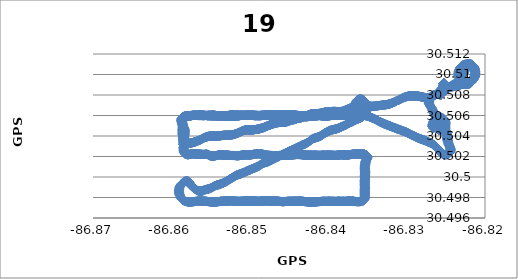
| Category | GPS Long |
|---|---|
| -86.825249 | 30.509 |
| -86.825249 | 30.509 |
| -86.825249 | 30.509 |
| -86.825249 | 30.509 |
| -86.825249 | 30.509 |
| -86.825249 | 30.509 |
| -86.825249 | 30.509 |
| -86.825249 | 30.509 |
| -86.825249 | 30.509 |
| -86.825249 | 30.509 |
| -86.825249 | 30.509 |
| -86.825249 | 30.509 |
| -86.825249 | 30.509 |
| -86.825249 | 30.509 |
| -86.825249 | 30.509 |
| -86.825249 | 30.509 |
| -86.825249 | 30.509 |
| -86.825249 | 30.509 |
| -86.825249 | 30.509 |
| -86.825249 | 30.509 |
| -86.825249 | 30.509 |
| -86.825249 | 30.509 |
| -86.825249 | 30.509 |
| -86.825249 | 30.509 |
| -86.825249 | 30.509 |
| -86.825249 | 30.509 |
| -86.825249 | 30.509 |
| -86.825249 | 30.509 |
| -86.825249 | 30.509 |
| -86.825249 | 30.509 |
| -86.825249 | 30.509 |
| -86.825249 | 30.509 |
| -86.825249 | 30.509 |
| -86.825249 | 30.509 |
| -86.825249 | 30.509 |
| -86.825249 | 30.509 |
| -86.825249 | 30.509 |
| -86.825249 | 30.509 |
| -86.825249 | 30.509 |
| -86.825249 | 30.509 |
| -86.825249 | 30.509 |
| -86.825249 | 30.509 |
| -86.825249 | 30.509 |
| -86.825249 | 30.509 |
| -86.825249 | 30.509 |
| -86.825249 | 30.509 |
| -86.825249 | 30.509 |
| -86.825249 | 30.509 |
| -86.825233 | 30.509 |
| -86.825233 | 30.509 |
| -86.825233 | 30.509 |
| -86.825233 | 30.509 |
| -86.825233 | 30.509 |
| -86.825233 | 30.509 |
| -86.825233 | 30.509 |
| -86.825233 | 30.509 |
| -86.825233 | 30.509 |
| -86.825233 | 30.509 |
| -86.825233 | 30.509 |
| -86.825233 | 30.509 |
| -86.825233 | 30.509 |
| -86.825233 | 30.509 |
| -86.825233 | 30.509 |
| -86.825233 | 30.509 |
| -86.825233 | 30.509 |
| -86.825233 | 30.509 |
| -86.825233 | 30.509 |
| -86.825233 | 30.509 |
| -86.825233 | 30.509 |
| -86.825233 | 30.509 |
| -86.825233 | 30.509 |
| -86.825233 | 30.509 |
| -86.825233 | 30.509 |
| -86.825233 | 30.509 |
| -86.825233 | 30.509 |
| -86.825233 | 30.509 |
| -86.825233 | 30.509 |
| -86.825233 | 30.509 |
| -86.825233 | 30.509 |
| -86.825233 | 30.509 |
| -86.825233 | 30.509 |
| -86.825233 | 30.509 |
| -86.825233 | 30.509 |
| -86.825233 | 30.509 |
| -86.825233 | 30.509 |
| -86.825233 | 30.509 |
| -86.825233 | 30.509 |
| -86.825233 | 30.509 |
| -86.825233 | 30.509 |
| -86.825233 | 30.509 |
| -86.825233 | 30.509 |
| -86.825233 | 30.509 |
| -86.825233 | 30.509 |
| -86.825233 | 30.509 |
| -86.825233 | 30.509 |
| -86.825233 | 30.509 |
| -86.825233 | 30.509 |
| -86.825233 | 30.509 |
| -86.825233 | 30.509 |
| -86.825233 | 30.509 |
| -86.825233 | 30.509 |
| -86.825233 | 30.509 |
| -86.825233 | 30.509 |
| -86.825233 | 30.509 |
| -86.825233 | 30.509 |
| -86.825233 | 30.509 |
| -86.825233 | 30.509 |
| -86.825233 | 30.509 |
| -86.825233 | 30.509 |
| -86.825233 | 30.509 |
| -86.825233 | 30.509 |
| -86.825233 | 30.509 |
| -86.825233 | 30.509 |
| -86.825233 | 30.509 |
| -86.825233 | 30.509 |
| -86.825233 | 30.509 |
| -86.825233 | 30.509 |
| -86.825233 | 30.509 |
| -86.825233 | 30.509 |
| -86.825233 | 30.509 |
| -86.825233 | 30.509 |
| -86.825233 | 30.509 |
| -86.825233 | 30.509 |
| -86.825233 | 30.509 |
| -86.825233 | 30.509 |
| -86.825233 | 30.509 |
| -86.825233 | 30.509 |
| -86.825233 | 30.509 |
| -86.825233 | 30.509 |
| -86.825233 | 30.509 |
| -86.825233 | 30.509 |
| -86.825233 | 30.509 |
| -86.825233 | 30.509 |
| -86.825233 | 30.509 |
| -86.825233 | 30.509 |
| -86.825233 | 30.509 |
| -86.825233 | 30.509 |
| -86.825233 | 30.509 |
| -86.825233 | 30.509 |
| -86.825249 | 30.509 |
| -86.825264 | 30.509 |
| -86.825264 | 30.509 |
| -86.825279 | 30.509 |
| -86.825279 | 30.509 |
| -86.82531 | 30.509 |
| -86.82531 | 30.509 |
| -86.82531 | 30.509 |
| -86.825325 | 30.509 |
| -86.825325 | 30.509 |
| -86.825325 | 30.509 |
| -86.825371 | 30.509 |
| -86.825409 | 30.509 |
| -86.825409 | 30.509 |
| -86.825455 | 30.509 |
| -86.825455 | 30.509 |
| -86.825485 | 30.509 |
| -86.825485 | 30.509 |
| -86.825531 | 30.509 |
| -86.825539 | 30.509 |
| -86.825539 | 30.509 |
| -86.825577 | 30.509 |
| -86.825577 | 30.509 |
| -86.82563 | 30.509 |
| -86.82563 | 30.509 |
| -86.825691 | 30.508 |
| -86.825691 | 30.508 |
| -86.825737 | 30.508 |
| -86.825737 | 30.508 |
| -86.825783 | 30.508 |
| -86.825783 | 30.508 |
| -86.825851 | 30.508 |
| -86.825851 | 30.508 |
| -86.825897 | 30.508 |
| -86.825897 | 30.508 |
| -86.825897 | 30.508 |
| -86.825958 | 30.508 |
| -86.825958 | 30.508 |
| -86.825958 | 30.508 |
| -86.826027 | 30.508 |
| -86.826027 | 30.508 |
| -86.826065 | 30.508 |
| -86.826065 | 30.508 |
| -86.826134 | 30.508 |
| -86.826134 | 30.508 |
| -86.826187 | 30.508 |
| -86.826248 | 30.508 |
| -86.826248 | 30.508 |
| -86.826309 | 30.508 |
| -86.826309 | 30.508 |
| -86.82637 | 30.508 |
| -86.82637 | 30.508 |
| -86.826485 | 30.508 |
| -86.826485 | 30.508 |
| -86.826515 | 30.508 |
| -86.826515 | 30.508 |
| -86.826607 | 30.508 |
| -86.826607 | 30.508 |
| -86.826668 | 30.508 |
| -86.826668 | 30.508 |
| -86.826759 | 30.508 |
| -86.826759 | 30.508 |
| -86.82682 | 30.508 |
| -86.82682 | 30.508 |
| -86.826866 | 30.508 |
| -86.826866 | 30.508 |
| -86.826866 | 30.508 |
| -86.826912 | 30.508 |
| -86.82692 | 30.508 |
| -86.82692 | 30.508 |
| -86.826958 | 30.508 |
| -86.826958 | 30.508 |
| -86.827003 | 30.508 |
| -86.827003 | 30.508 |
| -86.827034 | 30.508 |
| -86.827034 | 30.508 |
| -86.827065 | 30.508 |
| -86.827065 | 30.508 |
| -86.82708 | 30.508 |
| -86.82708 | 30.508 |
| -86.827095 | 30.508 |
| -86.827095 | 30.508 |
| -86.827095 | 30.508 |
| -86.82711 | 30.508 |
| -86.82711 | 30.508 |
| -86.82711 | 30.508 |
| -86.827126 | 30.507 |
| -86.827126 | 30.507 |
| -86.827126 | 30.507 |
| -86.827126 | 30.507 |
| -86.827141 | 30.507 |
| -86.827141 | 30.507 |
| -86.827156 | 30.507 |
| -86.827156 | 30.507 |
| -86.827141 | 30.507 |
| -86.827141 | 30.507 |
| -86.827126 | 30.507 |
| -86.827126 | 30.507 |
| -86.82708 | 30.507 |
| -86.82708 | 30.507 |
| -86.827065 | 30.507 |
| -86.827065 | 30.507 |
| -86.827011 | 30.507 |
| -86.827011 | 30.507 |
| -86.826973 | 30.507 |
| -86.826973 | 30.507 |
| -86.826927 | 30.507 |
| -86.826927 | 30.507 |
| -86.826912 | 30.507 |
| -86.826912 | 30.507 |
| -86.826851 | 30.507 |
| -86.826851 | 30.507 |
| -86.826851 | 30.507 |
| -86.826836 | 30.507 |
| -86.826805 | 30.507 |
| -86.826775 | 30.507 |
| -86.826775 | 30.507 |
| -86.826729 | 30.507 |
| -86.826698 | 30.507 |
| -86.826698 | 30.507 |
| -86.826668 | 30.506 |
| -86.826668 | 30.506 |
| -86.826668 | 30.506 |
| -86.826637 | 30.506 |
| -86.826637 | 30.506 |
| -86.826607 | 30.506 |
| -86.826561 | 30.506 |
| -86.826561 | 30.506 |
| -86.826561 | 30.506 |
| -86.82653 | 30.506 |
| -86.82653 | 30.506 |
| -86.8265 | 30.506 |
| -86.8265 | 30.506 |
| -86.8265 | 30.506 |
| -86.826454 | 30.506 |
| -86.826454 | 30.506 |
| -86.826424 | 30.506 |
| -86.826424 | 30.506 |
| -86.82637 | 30.506 |
| -86.82637 | 30.506 |
| -86.826317 | 30.506 |
| -86.826317 | 30.506 |
| -86.826302 | 30.506 |
| -86.826302 | 30.506 |
| -86.826256 | 30.506 |
| -86.826256 | 30.506 |
| -86.826202 | 30.506 |
| -86.826202 | 30.506 |
| -86.826164 | 30.506 |
| -86.826164 | 30.506 |
| -86.826111 | 30.506 |
| -86.826111 | 30.506 |
| -86.826065 | 30.506 |
| -86.826065 | 30.506 |
| -86.826035 | 30.506 |
| -86.826035 | 30.506 |
| -86.826004 | 30.505 |
| -86.826004 | 30.505 |
| -86.825951 | 30.505 |
| -86.825951 | 30.505 |
| -86.825897 | 30.505 |
| -86.82589 | 30.505 |
| -86.825859 | 30.505 |
| -86.825859 | 30.505 |
| -86.825813 | 30.505 |
| -86.825813 | 30.505 |
| -86.825783 | 30.505 |
| -86.825752 | 30.505 |
| -86.825745 | 30.505 |
| -86.825745 | 30.505 |
| -86.825722 | 30.505 |
| -86.825722 | 30.505 |
| -86.825661 | 30.505 |
| -86.825645 | 30.505 |
| -86.82563 | 30.505 |
| -86.82563 | 30.505 |
| -86.82563 | 30.505 |
| -86.825569 | 30.505 |
| -86.825569 | 30.505 |
| -86.825569 | 30.505 |
| -86.825516 | 30.505 |
| -86.825516 | 30.505 |
| -86.825485 | 30.505 |
| -86.825485 | 30.505 |
| -86.825409 | 30.505 |
| -86.825409 | 30.505 |
| -86.825363 | 30.505 |
| -86.825363 | 30.505 |
| -86.825294 | 30.505 |
| -86.825294 | 30.505 |
| -86.825195 | 30.505 |
| -86.825195 | 30.505 |
| -86.825104 | 30.505 |
| -86.825104 | 30.505 |
| -86.824989 | 30.504 |
| -86.824989 | 30.504 |
| -86.824974 | 30.504 |
| -86.824974 | 30.504 |
| -86.824928 | 30.504 |
| -86.824928 | 30.504 |
| -86.824898 | 30.504 |
| -86.824898 | 30.504 |
| -86.824898 | 30.504 |
| -86.824867 | 30.504 |
| -86.824867 | 30.504 |
| -86.824837 | 30.504 |
| -86.824837 | 30.504 |
| -86.824837 | 30.504 |
| -86.824791 | 30.504 |
| -86.824791 | 30.504 |
| -86.824791 | 30.504 |
| -86.824776 | 30.504 |
| -86.824776 | 30.504 |
| -86.824776 | 30.504 |
| -86.824776 | 30.504 |
| -86.824776 | 30.504 |
| -86.824776 | 30.504 |
| -86.824776 | 30.504 |
| -86.824776 | 30.504 |
| -86.824776 | 30.504 |
| -86.824776 | 30.504 |
| -86.824776 | 30.504 |
| -86.824776 | 30.504 |
| -86.824776 | 30.504 |
| -86.824776 | 30.504 |
| -86.824776 | 30.504 |
| -86.824776 | 30.504 |
| -86.824776 | 30.504 |
| -86.824776 | 30.504 |
| -86.824776 | 30.504 |
| -86.824776 | 30.504 |
| -86.824776 | 30.504 |
| -86.824776 | 30.504 |
| -86.824776 | 30.504 |
| -86.824776 | 30.504 |
| -86.824776 | 30.504 |
| -86.824776 | 30.504 |
| -86.824776 | 30.504 |
| -86.824776 | 30.504 |
| -86.824776 | 30.504 |
| -86.824776 | 30.504 |
| -86.824776 | 30.504 |
| -86.824776 | 30.504 |
| -86.824776 | 30.504 |
| -86.824776 | 30.504 |
| -86.824776 | 30.504 |
| -86.825836 | 30.505 |
| -86.825836 | 30.505 |
| -86.826576 | 30.505 |
| -86.826576 | 30.505 |
| -86.826714 | 30.505 |
| -86.826714 | 30.505 |
| -86.826714 | 30.505 |
| -86.826714 | 30.505 |
| -86.826729 | 30.505 |
| -86.826729 | 30.505 |
| -86.826714 | 30.505 |
| -86.826714 | 30.505 |
| -86.826675 | 30.505 |
| -86.826675 | 30.505 |
| -86.826607 | 30.505 |
| -86.826607 | 30.505 |
| -86.826569 | 30.505 |
| -86.826569 | 30.505 |
| -86.826508 | 30.506 |
| -86.826508 | 30.506 |
| -86.826462 | 30.506 |
| -86.826462 | 30.506 |
| -86.826401 | 30.506 |
| -86.826401 | 30.506 |
| -86.82634 | 30.506 |
| -86.82634 | 30.506 |
| -86.826279 | 30.506 |
| -86.826279 | 30.506 |
| -86.826202 | 30.506 |
| -86.826202 | 30.506 |
| -86.826057 | 30.506 |
| -86.826057 | 30.506 |
| -86.826004 | 30.506 |
| -86.826004 | 30.506 |
| -86.82589 | 30.506 |
| -86.82589 | 30.506 |
| -86.825798 | 30.506 |
| -86.825798 | 30.506 |
| -86.825722 | 30.506 |
| -86.825722 | 30.506 |
| -86.82563 | 30.506 |
| -86.82563 | 30.506 |
| -86.82563 | 30.506 |
| -86.825539 | 30.506 |
| -86.825539 | 30.506 |
| -86.825462 | 30.506 |
| -86.825386 | 30.506 |
| -86.825386 | 30.506 |
| -86.825386 | 30.506 |
| -86.825325 | 30.506 |
| -86.825325 | 30.506 |
| -86.825241 | 30.506 |
| -86.825241 | 30.506 |
| -86.825195 | 30.506 |
| -86.825195 | 30.506 |
| -86.825142 | 30.506 |
| -86.825142 | 30.506 |
| -86.825111 | 30.505 |
| -86.825111 | 30.505 |
| -86.825081 | 30.505 |
| -86.825081 | 30.505 |
| -86.825066 | 30.505 |
| -86.825066 | 30.505 |
| -86.82505 | 30.505 |
| -86.82505 | 30.505 |
| -86.82505 | 30.505 |
| -86.82505 | 30.505 |
| -86.82505 | 30.505 |
| -86.82505 | 30.505 |
| -86.825066 | 30.505 |
| -86.825066 | 30.505 |
| -86.825066 | 30.505 |
| -86.825066 | 30.505 |
| -86.825066 | 30.505 |
| -86.825081 | 30.505 |
| -86.825081 | 30.505 |
| -86.825081 | 30.505 |
| -86.825081 | 30.505 |
| -86.825081 | 30.505 |
| -86.825081 | 30.505 |
| -86.825081 | 30.505 |
| -86.825081 | 30.505 |
| -86.825066 | 30.505 |
| -86.825066 | 30.505 |
| -86.825066 | 30.505 |
| -86.825066 | 30.505 |
| -86.825066 | 30.505 |
| -86.82505 | 30.505 |
| -86.82505 | 30.505 |
| -86.82505 | 30.505 |
| -86.82505 | 30.505 |
| -86.82502 | 30.504 |
| -86.825005 | 30.504 |
| -86.825005 | 30.504 |
| -86.824989 | 30.504 |
| -86.824989 | 30.504 |
| -86.824974 | 30.504 |
| -86.824974 | 30.504 |
| -86.824944 | 30.504 |
| -86.824944 | 30.504 |
| -86.824928 | 30.504 |
| -86.824928 | 30.504 |
| -86.824898 | 30.504 |
| -86.824898 | 30.504 |
| -86.824883 | 30.504 |
| -86.824883 | 30.504 |
| -86.824867 | 30.504 |
| -86.824867 | 30.504 |
| -86.824852 | 30.504 |
| -86.824852 | 30.504 |
| -86.824837 | 30.504 |
| -86.824837 | 30.504 |
| -86.824837 | 30.504 |
| -86.824837 | 30.504 |
| -86.824821 | 30.504 |
| -86.824821 | 30.504 |
| -86.824806 | 30.504 |
| -86.824806 | 30.504 |
| -86.824791 | 30.504 |
| -86.824791 | 30.504 |
| -86.824776 | 30.504 |
| -86.824776 | 30.504 |
| -86.82476 | 30.504 |
| -86.82476 | 30.504 |
| -86.82476 | 30.504 |
| -86.82473 | 30.503 |
| -86.82473 | 30.503 |
| -86.824699 | 30.503 |
| -86.824699 | 30.503 |
| -86.824684 | 30.503 |
| -86.824684 | 30.503 |
| -86.824654 | 30.503 |
| -86.824654 | 30.503 |
| -86.824638 | 30.503 |
| -86.824638 | 30.503 |
| -86.824608 | 30.503 |
| -86.824608 | 30.503 |
| -86.824577 | 30.503 |
| -86.824577 | 30.503 |
| -86.824547 | 30.503 |
| -86.824547 | 30.503 |
| -86.824547 | 30.503 |
| -86.824547 | 30.503 |
| -86.824486 | 30.503 |
| -86.824486 | 30.503 |
| -86.824486 | 30.503 |
| -86.824486 | 30.503 |
| -86.824455 | 30.503 |
| -86.824455 | 30.503 |
| -86.824425 | 30.503 |
| -86.824409 | 30.503 |
| -86.824409 | 30.503 |
| -86.824394 | 30.503 |
| -86.824394 | 30.503 |
| -86.824394 | 30.503 |
| -86.824394 | 30.503 |
| -86.824394 | 30.503 |
| -86.824394 | 30.503 |
| -86.824394 | 30.503 |
| -86.824409 | 30.503 |
| -86.824409 | 30.503 |
| -86.82444 | 30.502 |
| -86.82444 | 30.502 |
| -86.824471 | 30.502 |
| -86.824471 | 30.502 |
| -86.824509 | 30.502 |
| -86.824509 | 30.502 |
| -86.824562 | 30.502 |
| -86.824562 | 30.502 |
| -86.8246 | 30.502 |
| -86.8246 | 30.502 |
| -86.824669 | 30.502 |
| -86.824669 | 30.502 |
| -86.82473 | 30.502 |
| -86.82473 | 30.502 |
| -86.824814 | 30.502 |
| -86.824814 | 30.502 |
| -86.824898 | 30.502 |
| -86.824898 | 30.502 |
| -86.824974 | 30.502 |
| -86.824974 | 30.502 |
| -86.825096 | 30.502 |
| -86.825096 | 30.502 |
| -86.825165 | 30.502 |
| -86.825165 | 30.502 |
| -86.825279 | 30.502 |
| -86.825279 | 30.502 |
| -86.825356 | 30.502 |
| -86.825356 | 30.502 |
| -86.825356 | 30.502 |
| -86.825447 | 30.502 |
| -86.825447 | 30.502 |
| -86.825523 | 30.502 |
| -86.825546 | 30.502 |
| -86.8256 | 30.502 |
| -86.8256 | 30.502 |
| -86.8256 | 30.502 |
| -86.825668 | 30.502 |
| -86.825668 | 30.502 |
| -86.825745 | 30.502 |
| -86.825745 | 30.502 |
| -86.825813 | 30.503 |
| -86.825813 | 30.503 |
| -86.825867 | 30.503 |
| -86.825867 | 30.503 |
| -86.825928 | 30.503 |
| -86.825928 | 30.503 |
| -86.825989 | 30.503 |
| -86.825989 | 30.503 |
| -86.826057 | 30.503 |
| -86.826057 | 30.503 |
| -86.826057 | 30.503 |
| -86.826096 | 30.503 |
| -86.826096 | 30.503 |
| -86.82618 | 30.503 |
| -86.826202 | 30.503 |
| -86.826202 | 30.503 |
| -86.826241 | 30.503 |
| -86.826302 | 30.503 |
| -86.826302 | 30.503 |
| -86.826378 | 30.503 |
| -86.826378 | 30.503 |
| -86.826462 | 30.503 |
| -86.826462 | 30.503 |
| -86.826561 | 30.503 |
| -86.826561 | 30.503 |
| -86.826637 | 30.503 |
| -86.826637 | 30.503 |
| -86.826714 | 30.503 |
| -86.826714 | 30.503 |
| -86.826736 | 30.503 |
| -86.826828 | 30.503 |
| -86.826828 | 30.503 |
| -86.826904 | 30.503 |
| -86.826904 | 30.503 |
| -86.826981 | 30.503 |
| -86.826981 | 30.503 |
| -86.827072 | 30.503 |
| -86.827072 | 30.503 |
| -86.827148 | 30.503 |
| -86.827148 | 30.503 |
| -86.82724 | 30.503 |
| -86.82724 | 30.503 |
| -86.827332 | 30.503 |
| -86.827332 | 30.503 |
| -86.827423 | 30.503 |
| -86.827423 | 30.503 |
| -86.827499 | 30.504 |
| -86.827499 | 30.504 |
| -86.827614 | 30.504 |
| -86.827614 | 30.504 |
| -86.827705 | 30.504 |
| -86.827705 | 30.504 |
| -86.827705 | 30.504 |
| -86.827782 | 30.504 |
| -86.827766 | 30.504 |
| -86.827766 | 30.504 |
| -86.827843 | 30.504 |
| -86.827919 | 30.504 |
| -86.827942 | 30.504 |
| -86.827942 | 30.504 |
| -86.828011 | 30.504 |
| -86.828087 | 30.504 |
| -86.828087 | 30.504 |
| -86.828087 | 30.504 |
| -86.828186 | 30.504 |
| -86.828186 | 30.504 |
| -86.828262 | 30.504 |
| -86.828262 | 30.504 |
| -86.828339 | 30.504 |
| -86.828339 | 30.504 |
| -86.828415 | 30.504 |
| -86.828415 | 30.504 |
| -86.828491 | 30.504 |
| -86.828491 | 30.504 |
| -86.828606 | 30.504 |
| -86.828606 | 30.504 |
| -86.828682 | 30.504 |
| -86.828682 | 30.504 |
| -86.828781 | 30.504 |
| -86.828781 | 30.504 |
| -86.828827 | 30.504 |
| -86.828827 | 30.504 |
| -86.828918 | 30.504 |
| -86.828918 | 30.504 |
| -86.828995 | 30.504 |
| -86.828995 | 30.504 |
| -86.829056 | 30.504 |
| -86.829056 | 30.504 |
| -86.829163 | 30.504 |
| -86.829185 | 30.504 |
| -86.829277 | 30.504 |
| -86.829277 | 30.504 |
| -86.829353 | 30.504 |
| -86.829338 | 30.504 |
| -86.829414 | 30.504 |
| -86.829414 | 30.504 |
| -86.829414 | 30.504 |
| -86.829529 | 30.504 |
| -86.829597 | 30.504 |
| -86.829597 | 30.504 |
| -86.829597 | 30.504 |
| -86.829659 | 30.504 |
| -86.829681 | 30.504 |
| -86.829735 | 30.504 |
| -86.829826 | 30.504 |
| -86.829826 | 30.504 |
| -86.829826 | 30.504 |
| -86.829903 | 30.504 |
| -86.829903 | 30.504 |
| -86.829979 | 30.504 |
| -86.83007 | 30.504 |
| -86.83007 | 30.504 |
| -86.83007 | 30.504 |
| -86.83007 | 30.504 |
| -86.830147 | 30.504 |
| -86.830147 | 30.504 |
| -86.830246 | 30.504 |
| -86.830246 | 30.504 |
| -86.830338 | 30.504 |
| -86.830338 | 30.504 |
| -86.830414 | 30.504 |
| -86.830414 | 30.504 |
| -86.830505 | 30.505 |
| -86.830582 | 30.505 |
| -86.830582 | 30.505 |
| -86.830582 | 30.505 |
| -86.830582 | 30.505 |
| -86.830696 | 30.505 |
| -86.830696 | 30.505 |
| -86.830772 | 30.505 |
| -86.830772 | 30.505 |
| -86.830887 | 30.505 |
| -86.830887 | 30.505 |
| -86.830956 | 30.505 |
| -86.830956 | 30.505 |
| -86.831032 | 30.505 |
| -86.831032 | 30.505 |
| -86.831146 | 30.505 |
| -86.831146 | 30.505 |
| -86.831245 | 30.505 |
| -86.831245 | 30.505 |
| -86.831245 | 30.505 |
| -86.831322 | 30.505 |
| -86.831345 | 30.505 |
| -86.831413 | 30.505 |
| -86.831413 | 30.505 |
| -86.83149 | 30.505 |
| -86.83149 | 30.505 |
| -86.83149 | 30.505 |
| -86.831589 | 30.505 |
| -86.83168 | 30.505 |
| -86.83168 | 30.505 |
| -86.831779 | 30.505 |
| -86.831779 | 30.505 |
| -86.831833 | 30.505 |
| -86.831833 | 30.505 |
| -86.831924 | 30.505 |
| -86.831924 | 30.505 |
| -86.832024 | 30.505 |
| -86.832024 | 30.505 |
| -86.832062 | 30.505 |
| -86.832153 | 30.505 |
| -86.832153 | 30.505 |
| -86.832153 | 30.505 |
| -86.832153 | 30.505 |
| -86.83223 | 30.505 |
| -86.83223 | 30.505 |
| -86.832329 | 30.505 |
| -86.832329 | 30.505 |
| -86.83242 | 30.505 |
| -86.83242 | 30.505 |
| -86.832497 | 30.505 |
| -86.832497 | 30.505 |
| -86.832573 | 30.505 |
| -86.832573 | 30.505 |
| -86.832649 | 30.505 |
| -86.832649 | 30.505 |
| -86.832741 | 30.505 |
| -86.832741 | 30.505 |
| -86.832817 | 30.505 |
| -86.832817 | 30.505 |
| -86.832817 | 30.505 |
| -86.832893 | 30.505 |
| -86.832893 | 30.505 |
| -86.83297 | 30.505 |
| -86.83297 | 30.505 |
| -86.83297 | 30.505 |
| -86.833015 | 30.505 |
| -86.833015 | 30.505 |
| -86.833107 | 30.505 |
| -86.833107 | 30.505 |
| -86.833176 | 30.505 |
| -86.833176 | 30.505 |
| -86.833252 | 30.505 |
| -86.833252 | 30.505 |
| -86.833328 | 30.505 |
| -86.833328 | 30.505 |
| -86.833405 | 30.505 |
| -86.833405 | 30.505 |
| -86.833466 | 30.505 |
| -86.833466 | 30.505 |
| -86.833595 | 30.505 |
| -86.833626 | 30.505 |
| -86.833626 | 30.505 |
| -86.833733 | 30.506 |
| -86.833733 | 30.506 |
| -86.833733 | 30.506 |
| -86.833794 | 30.506 |
| -86.833801 | 30.506 |
| -86.83387 | 30.506 |
| -86.83387 | 30.506 |
| -86.833946 | 30.506 |
| -86.834023 | 30.506 |
| -86.834023 | 30.506 |
| -86.834099 | 30.506 |
| -86.834099 | 30.506 |
| -86.834175 | 30.506 |
| -86.834183 | 30.506 |
| -86.834183 | 30.506 |
| -86.834251 | 30.506 |
| -86.834251 | 30.506 |
| -86.834373 | 30.506 |
| -86.834373 | 30.506 |
| -86.834427 | 30.506 |
| -86.834427 | 30.506 |
| -86.834503 | 30.506 |
| -86.834503 | 30.506 |
| -86.834625 | 30.506 |
| -86.834625 | 30.506 |
| -86.834694 | 30.506 |
| -86.834694 | 30.506 |
| -86.83477 | 30.506 |
| -86.83477 | 30.506 |
| -86.834862 | 30.506 |
| -86.834862 | 30.506 |
| -86.834938 | 30.506 |
| -86.834938 | 30.506 |
| -86.834938 | 30.506 |
| -86.83503 | 30.506 |
| -86.83503 | 30.506 |
| -86.83503 | 30.506 |
| -86.835129 | 30.506 |
| -86.835129 | 30.506 |
| -86.835197 | 30.506 |
| -86.835197 | 30.506 |
| -86.835297 | 30.506 |
| -86.835297 | 30.506 |
| -86.835388 | 30.506 |
| -86.835487 | 30.506 |
| -86.835487 | 30.506 |
| -86.835487 | 30.506 |
| -86.835556 | 30.506 |
| -86.835556 | 30.506 |
| -86.835655 | 30.506 |
| -86.835655 | 30.506 |
| -86.835732 | 30.506 |
| -86.835732 | 30.506 |
| -86.835808 | 30.506 |
| -86.835808 | 30.506 |
| -86.835899 | 30.506 |
| -86.835899 | 30.506 |
| -86.835976 | 30.506 |
| -86.835976 | 30.506 |
| -86.835976 | 30.506 |
| -86.836067 | 30.506 |
| -86.836067 | 30.506 |
| -86.836159 | 30.506 |
| -86.836159 | 30.506 |
| -86.83625 | 30.506 |
| -86.83625 | 30.506 |
| -86.836327 | 30.506 |
| -86.836327 | 30.506 |
| -86.836418 | 30.506 |
| -86.836418 | 30.506 |
| -86.836494 | 30.506 |
| -86.836494 | 30.506 |
| -86.836586 | 30.506 |
| -86.836609 | 30.506 |
| -86.836609 | 30.506 |
| -86.8367 | 30.506 |
| -86.8367 | 30.506 |
| -86.8368 | 30.506 |
| -86.8368 | 30.506 |
| -86.836868 | 30.506 |
| -86.836868 | 30.506 |
| -86.83699 | 30.506 |
| -86.83699 | 30.506 |
| -86.837036 | 30.506 |
| -86.837036 | 30.506 |
| -86.837173 | 30.506 |
| -86.837173 | 30.506 |
| -86.837242 | 30.506 |
| -86.837242 | 30.506 |
| -86.837357 | 30.506 |
| -86.837357 | 30.506 |
| -86.83741 | 30.506 |
| -86.83741 | 30.506 |
| -86.83754 | 30.506 |
| -86.837563 | 30.506 |
| -86.837631 | 30.506 |
| -86.837631 | 30.506 |
| -86.837631 | 30.506 |
| -86.837631 | 30.506 |
| -86.83773 | 30.506 |
| -86.83773 | 30.506 |
| -86.837822 | 30.506 |
| -86.837822 | 30.506 |
| -86.837914 | 30.506 |
| -86.837914 | 30.506 |
| -86.838005 | 30.506 |
| -86.838005 | 30.506 |
| -86.838005 | 30.506 |
| -86.838005 | 30.506 |
| -86.838127 | 30.506 |
| -86.838127 | 30.506 |
| -86.838196 | 30.506 |
| -86.838196 | 30.506 |
| -86.83831 | 30.506 |
| -86.83831 | 30.506 |
| -86.838379 | 30.506 |
| -86.838379 | 30.506 |
| -86.838493 | 30.506 |
| -86.838493 | 30.506 |
| -86.838585 | 30.506 |
| -86.838585 | 30.506 |
| -86.838676 | 30.506 |
| -86.838699 | 30.506 |
| -86.838699 | 30.506 |
| -86.838791 | 30.506 |
| -86.838791 | 30.506 |
| -86.83889 | 30.506 |
| -86.83889 | 30.506 |
| -86.838959 | 30.506 |
| -86.838959 | 30.506 |
| -86.839073 | 30.506 |
| -86.839073 | 30.506 |
| -86.839165 | 30.506 |
| -86.839165 | 30.506 |
| -86.839256 | 30.506 |
| -86.839256 | 30.506 |
| -86.839256 | 30.506 |
| -86.839256 | 30.506 |
| -86.839371 | 30.506 |
| -86.839371 | 30.506 |
| -86.839424 | 30.506 |
| -86.839424 | 30.506 |
| -86.839516 | 30.506 |
| -86.839516 | 30.506 |
| -86.839607 | 30.506 |
| -86.839607 | 30.506 |
| -86.839745 | 30.506 |
| -86.839745 | 30.506 |
| -86.839813 | 30.506 |
| -86.839813 | 30.506 |
| -86.839905 | 30.506 |
| -86.839905 | 30.506 |
| -86.840004 | 30.506 |
| -86.840004 | 30.506 |
| -86.840096 | 30.506 |
| -86.840096 | 30.506 |
| -86.84021 | 30.506 |
| -86.84021 | 30.506 |
| -86.840286 | 30.506 |
| -86.840286 | 30.506 |
| -86.840401 | 30.506 |
| -86.840401 | 30.506 |
| -86.840469 | 30.506 |
| -86.840469 | 30.506 |
| -86.840546 | 30.506 |
| -86.840546 | 30.506 |
| -86.840645 | 30.506 |
| -86.840645 | 30.506 |
| -86.840698 | 30.506 |
| -86.840698 | 30.506 |
| -86.840797 | 30.506 |
| -86.840797 | 30.506 |
| -86.840889 | 30.506 |
| -86.840889 | 30.506 |
| -86.840965 | 30.506 |
| -86.840965 | 30.506 |
| -86.841026 | 30.506 |
| -86.841026 | 30.506 |
| -86.841118 | 30.506 |
| -86.841118 | 30.506 |
| -86.841118 | 30.506 |
| -86.841209 | 30.506 |
| -86.841286 | 30.506 |
| -86.841286 | 30.506 |
| -86.84127 | 30.506 |
| -86.84127 | 30.506 |
| -86.841362 | 30.506 |
| -86.841362 | 30.506 |
| -86.841438 | 30.506 |
| -86.841522 | 30.506 |
| -86.841522 | 30.506 |
| -86.841591 | 30.506 |
| -86.841591 | 30.506 |
| -86.841591 | 30.506 |
| -86.841675 | 30.506 |
| -86.841675 | 30.506 |
| -86.841736 | 30.506 |
| -86.841736 | 30.506 |
| -86.841812 | 30.506 |
| -86.841812 | 30.506 |
| -86.841888 | 30.506 |
| -86.841888 | 30.506 |
| -86.841949 | 30.506 |
| -86.842026 | 30.506 |
| -86.842026 | 30.506 |
| -86.842026 | 30.506 |
| -86.842117 | 30.506 |
| -86.842117 | 30.506 |
| -86.842194 | 30.506 |
| -86.842194 | 30.506 |
| -86.842194 | 30.506 |
| -86.842278 | 30.506 |
| -86.842278 | 30.506 |
| -86.842339 | 30.506 |
| -86.842339 | 30.506 |
| -86.842415 | 30.506 |
| -86.842415 | 30.506 |
| -86.842491 | 30.506 |
| -86.842491 | 30.506 |
| -86.842552 | 30.506 |
| -86.842552 | 30.506 |
| -86.842552 | 30.506 |
| -86.842628 | 30.506 |
| -86.842628 | 30.506 |
| -86.84272 | 30.506 |
| -86.84272 | 30.506 |
| -86.842804 | 30.506 |
| -86.842804 | 30.506 |
| -86.842865 | 30.506 |
| -86.842865 | 30.506 |
| -86.842941 | 30.506 |
| -86.842941 | 30.506 |
| -86.843056 | 30.506 |
| -86.843056 | 30.506 |
| -86.843094 | 30.506 |
| -86.843094 | 30.506 |
| -86.84317 | 30.506 |
| -86.84317 | 30.506 |
| -86.843285 | 30.506 |
| -86.843285 | 30.506 |
| -86.843315 | 30.506 |
| -86.843315 | 30.506 |
| -86.843391 | 30.506 |
| -86.843391 | 30.506 |
| -86.843452 | 30.506 |
| -86.843452 | 30.506 |
| -86.843498 | 30.506 |
| -86.843559 | 30.506 |
| -86.843559 | 30.506 |
| -86.843636 | 30.506 |
| -86.843643 | 30.506 |
| -86.843719 | 30.506 |
| -86.843719 | 30.506 |
| -86.843719 | 30.506 |
| -86.843765 | 30.506 |
| -86.843765 | 30.506 |
| -86.843842 | 30.506 |
| -86.843842 | 30.506 |
| -86.843918 | 30.506 |
| -86.843918 | 30.506 |
| -86.843979 | 30.506 |
| -86.843979 | 30.506 |
| -86.844078 | 30.506 |
| -86.844078 | 30.506 |
| -86.84417 | 30.506 |
| -86.84417 | 30.506 |
| -86.844246 | 30.506 |
| -86.844246 | 30.506 |
| -86.844246 | 30.506 |
| -86.844307 | 30.506 |
| -86.844307 | 30.506 |
| -86.844307 | 30.506 |
| -86.844383 | 30.506 |
| -86.844383 | 30.506 |
| -86.844498 | 30.506 |
| -86.844498 | 30.506 |
| -86.844536 | 30.506 |
| -86.844536 | 30.506 |
| -86.844597 | 30.506 |
| -86.844597 | 30.506 |
| -86.844704 | 30.506 |
| -86.844704 | 30.506 |
| -86.844757 | 30.506 |
| -86.844757 | 30.506 |
| -86.844818 | 30.506 |
| -86.844818 | 30.506 |
| -86.844894 | 30.506 |
| -86.844894 | 30.506 |
| -86.844933 | 30.506 |
| -86.844933 | 30.506 |
| -86.844978 | 30.506 |
| -86.844978 | 30.506 |
| -86.84507 | 30.506 |
| -86.84507 | 30.506 |
| -86.845146 | 30.506 |
| -86.845146 | 30.506 |
| -86.845245 | 30.506 |
| -86.845245 | 30.506 |
| -86.845314 | 30.506 |
| -86.845314 | 30.506 |
| -86.845413 | 30.506 |
| -86.845413 | 30.506 |
| -86.845413 | 30.506 |
| -86.845413 | 30.506 |
| -86.84549 | 30.506 |
| -86.845581 | 30.506 |
| -86.845581 | 30.506 |
| -86.845581 | 30.506 |
| -86.845673 | 30.506 |
| -86.845673 | 30.506 |
| -86.845772 | 30.506 |
| -86.845772 | 30.506 |
| -86.845833 | 30.506 |
| -86.845833 | 30.506 |
| -86.845894 | 30.506 |
| -86.845894 | 30.506 |
| -86.845993 | 30.506 |
| -86.845993 | 30.506 |
| -86.846054 | 30.506 |
| -86.846054 | 30.506 |
| -86.84613 | 30.506 |
| -86.846184 | 30.506 |
| -86.84626 | 30.506 |
| -86.84626 | 30.506 |
| -86.846352 | 30.506 |
| -86.846352 | 30.506 |
| -86.846428 | 30.506 |
| -86.846413 | 30.506 |
| -86.846489 | 30.506 |
| -86.846489 | 30.506 |
| -86.846581 | 30.506 |
| -86.846657 | 30.506 |
| -86.846657 | 30.506 |
| -86.846657 | 30.506 |
| -86.846733 | 30.506 |
| -86.846733 | 30.506 |
| -86.846825 | 30.506 |
| -86.846825 | 30.506 |
| -86.846901 | 30.506 |
| -86.846901 | 30.506 |
| -86.846901 | 30.506 |
| -86.847023 | 30.506 |
| -86.847115 | 30.506 |
| -86.847115 | 30.506 |
| -86.847191 | 30.506 |
| -86.847191 | 30.506 |
| -86.847305 | 30.506 |
| -86.847305 | 30.506 |
| -86.847359 | 30.506 |
| -86.847359 | 30.506 |
| -86.847473 | 30.506 |
| -86.847473 | 30.506 |
| -86.847549 | 30.506 |
| -86.847549 | 30.506 |
| -86.847626 | 30.506 |
| -86.847626 | 30.506 |
| -86.847702 | 30.506 |
| -86.847702 | 30.506 |
| -86.847794 | 30.506 |
| -86.847794 | 30.506 |
| -86.84787 | 30.506 |
| -86.84787 | 30.506 |
| -86.84787 | 30.506 |
| -86.847984 | 30.506 |
| -86.847984 | 30.506 |
| -86.847984 | 30.506 |
| -86.848061 | 30.506 |
| -86.848061 | 30.506 |
| -86.848152 | 30.506 |
| -86.848152 | 30.506 |
| -86.848244 | 30.506 |
| -86.848244 | 30.506 |
| -86.848335 | 30.506 |
| -86.848335 | 30.506 |
| -86.848412 | 30.506 |
| -86.848412 | 30.506 |
| -86.848503 | 30.506 |
| -86.848526 | 30.506 |
| -86.848526 | 30.506 |
| -86.848595 | 30.506 |
| -86.848686 | 30.506 |
| -86.848709 | 30.506 |
| -86.848763 | 30.506 |
| -86.848763 | 30.506 |
| -86.848854 | 30.506 |
| -86.848877 | 30.506 |
| -86.848877 | 30.506 |
| -86.848969 | 30.506 |
| -86.848969 | 30.506 |
| -86.84906 | 30.506 |
| -86.849182 | 30.506 |
| -86.849182 | 30.506 |
| -86.849228 | 30.506 |
| -86.849228 | 30.506 |
| -86.849319 | 30.506 |
| -86.849342 | 30.506 |
| -86.849411 | 30.506 |
| -86.849411 | 30.506 |
| -86.849411 | 30.506 |
| -86.849503 | 30.506 |
| -86.849503 | 30.506 |
| -86.849503 | 30.506 |
| -86.84964 | 30.506 |
| -86.84964 | 30.506 |
| -86.849709 | 30.506 |
| -86.849709 | 30.506 |
| -86.8498 | 30.506 |
| -86.849899 | 30.506 |
| -86.849899 | 30.506 |
| -86.849991 | 30.506 |
| -86.849991 | 30.506 |
| -86.850082 | 30.506 |
| -86.850082 | 30.506 |
| -86.850082 | 30.506 |
| -86.850182 | 30.506 |
| -86.850182 | 30.506 |
| -86.850273 | 30.506 |
| -86.850273 | 30.506 |
| -86.850365 | 30.506 |
| -86.850456 | 30.506 |
| -86.850456 | 30.506 |
| -86.850662 | 30.506 |
| -86.850662 | 30.506 |
| -86.850731 | 30.506 |
| -86.850731 | 30.506 |
| -86.850731 | 30.506 |
| -86.850822 | 30.506 |
| -86.850822 | 30.506 |
| -86.850937 | 30.506 |
| -86.850937 | 30.506 |
| -86.851028 | 30.506 |
| -86.851028 | 30.506 |
| -86.851143 | 30.506 |
| -86.851143 | 30.506 |
| -86.851212 | 30.506 |
| -86.851212 | 30.506 |
| -86.851349 | 30.506 |
| -86.851349 | 30.506 |
| -86.851433 | 30.506 |
| -86.851433 | 30.506 |
| -86.851524 | 30.506 |
| -86.851524 | 30.506 |
| -86.851616 | 30.506 |
| -86.851616 | 30.506 |
| -86.851707 | 30.506 |
| -86.851707 | 30.506 |
| -86.85186 | 30.506 |
| -86.85186 | 30.506 |
| -86.851929 | 30.506 |
| -86.851929 | 30.506 |
| -86.85202 | 30.506 |
| -86.85202 | 30.506 |
| -86.852112 | 30.506 |
| -86.852112 | 30.506 |
| -86.852135 | 30.506 |
| -86.852226 | 30.506 |
| -86.852226 | 30.506 |
| -86.852226 | 30.506 |
| -86.852303 | 30.506 |
| -86.852303 | 30.506 |
| -86.852394 | 30.506 |
| -86.852394 | 30.506 |
| -86.852486 | 30.506 |
| -86.852486 | 30.506 |
| -86.852562 | 30.506 |
| -86.852562 | 30.506 |
| -86.852654 | 30.506 |
| -86.852654 | 30.506 |
| -86.85273 | 30.506 |
| -86.85273 | 30.506 |
| -86.852821 | 30.506 |
| -86.852821 | 30.506 |
| -86.852821 | 30.506 |
| -86.852898 | 30.506 |
| -86.852921 | 30.506 |
| -86.852989 | 30.506 |
| -86.852989 | 30.506 |
| -86.853081 | 30.506 |
| -86.853081 | 30.506 |
| -86.853172 | 30.506 |
| -86.853172 | 30.506 |
| -86.853279 | 30.506 |
| -86.853279 | 30.506 |
| -86.853279 | 30.506 |
| -86.853371 | 30.506 |
| -86.853371 | 30.506 |
| -86.853485 | 30.506 |
| -86.853485 | 30.506 |
| -86.853577 | 30.506 |
| -86.853577 | 30.506 |
| -86.853668 | 30.506 |
| -86.853668 | 30.506 |
| -86.853745 | 30.506 |
| -86.853745 | 30.506 |
| -86.853836 | 30.506 |
| -86.853836 | 30.506 |
| -86.853912 | 30.506 |
| -86.853912 | 30.506 |
| -86.854004 | 30.506 |
| -86.854004 | 30.506 |
| -86.854004 | 30.506 |
| -86.854095 | 30.506 |
| -86.854095 | 30.506 |
| -86.854225 | 30.506 |
| -86.854225 | 30.506 |
| -86.854332 | 30.506 |
| -86.854332 | 30.506 |
| -86.854424 | 30.506 |
| -86.854424 | 30.506 |
| -86.85453 | 30.506 |
| -86.85453 | 30.506 |
| -86.854645 | 30.506 |
| -86.854645 | 30.506 |
| -86.854713 | 30.506 |
| -86.854713 | 30.506 |
| -86.854828 | 30.506 |
| -86.854828 | 30.506 |
| -86.854828 | 30.506 |
| -86.854919 | 30.506 |
| -86.854919 | 30.506 |
| -86.855049 | 30.506 |
| -86.855049 | 30.506 |
| -86.855118 | 30.506 |
| -86.855118 | 30.506 |
| -86.855209 | 30.506 |
| -86.855209 | 30.506 |
| -86.855301 | 30.506 |
| -86.855301 | 30.506 |
| -86.855392 | 30.506 |
| -86.855392 | 30.506 |
| -86.855522 | 30.506 |
| -86.855522 | 30.506 |
| -86.855614 | 30.506 |
| -86.855614 | 30.506 |
| -86.85569 | 30.506 |
| -86.85569 | 30.506 |
| -86.855782 | 30.506 |
| -86.855782 | 30.506 |
| -86.855782 | 30.506 |
| -86.855873 | 30.506 |
| -86.855896 | 30.506 |
| -86.855896 | 30.506 |
| -86.855949 | 30.506 |
| -86.855949 | 30.506 |
| -86.856041 | 30.506 |
| -86.856041 | 30.506 |
| -86.856133 | 30.506 |
| -86.856133 | 30.506 |
| -86.856224 | 30.506 |
| -86.856224 | 30.506 |
| -86.8563 | 30.506 |
| -86.8563 | 30.506 |
| -86.856392 | 30.506 |
| -86.856468 | 30.506 |
| -86.856491 | 30.506 |
| -86.856491 | 30.506 |
| -86.856567 | 30.506 |
| -86.856567 | 30.506 |
| -86.856659 | 30.506 |
| -86.856659 | 30.506 |
| -86.856735 | 30.506 |
| -86.856735 | 30.506 |
| -86.856812 | 30.506 |
| -86.856812 | 30.506 |
| -86.856926 | 30.506 |
| -86.856926 | 30.506 |
| -86.856979 | 30.506 |
| -86.856979 | 30.506 |
| -86.856979 | 30.506 |
| -86.857063 | 30.506 |
| -86.857063 | 30.506 |
| -86.85714 | 30.506 |
| -86.85714 | 30.506 |
| -86.85714 | 30.506 |
| -86.857239 | 30.506 |
| -86.857239 | 30.506 |
| -86.857307 | 30.506 |
| -86.857307 | 30.506 |
| -86.857368 | 30.506 |
| -86.857368 | 30.506 |
| -86.857475 | 30.506 |
| -86.857475 | 30.506 |
| -86.857559 | 30.506 |
| -86.857559 | 30.506 |
| -86.857658 | 30.506 |
| -86.857658 | 30.506 |
| -86.85775 | 30.506 |
| -86.85775 | 30.506 |
| -86.857803 | 30.506 |
| -86.857803 | 30.506 |
| -86.857903 | 30.506 |
| -86.857903 | 30.506 |
| -86.857994 | 30.506 |
| -86.857994 | 30.506 |
| -86.857994 | 30.506 |
| -86.858086 | 30.506 |
| -86.858086 | 30.506 |
| -86.858086 | 30.506 |
| -86.8582 | 30.506 |
| -86.8582 | 30.506 |
| -86.858253 | 30.506 |
| -86.858253 | 30.506 |
| -86.858353 | 30.506 |
| -86.858353 | 30.506 |
| -86.858421 | 30.506 |
| -86.858421 | 30.506 |
| -86.858505 | 30.506 |
| -86.858505 | 30.506 |
| -86.858582 | 30.506 |
| -86.858582 | 30.506 |
| -86.858582 | 30.506 |
| -86.858627 | 30.506 |
| -86.858627 | 30.506 |
| -86.858665 | 30.506 |
| -86.858665 | 30.506 |
| -86.858696 | 30.506 |
| -86.858696 | 30.506 |
| -86.858711 | 30.506 |
| -86.858711 | 30.506 |
| -86.858727 | 30.506 |
| -86.858727 | 30.506 |
| -86.858727 | 30.506 |
| -86.858727 | 30.506 |
| -86.858711 | 30.505 |
| -86.858711 | 30.505 |
| -86.858696 | 30.505 |
| -86.858696 | 30.505 |
| -86.858696 | 30.505 |
| -86.858696 | 30.505 |
| -86.858696 | 30.505 |
| -86.858665 | 30.505 |
| -86.858665 | 30.505 |
| -86.85865 | 30.505 |
| -86.85865 | 30.505 |
| -86.85862 | 30.505 |
| -86.85862 | 30.505 |
| -86.858604 | 30.505 |
| -86.858604 | 30.505 |
| -86.858604 | 30.505 |
| -86.858574 | 30.505 |
| -86.858574 | 30.505 |
| -86.858559 | 30.505 |
| -86.858559 | 30.505 |
| -86.858543 | 30.505 |
| -86.858543 | 30.505 |
| -86.858543 | 30.505 |
| -86.858543 | 30.505 |
| -86.858543 | 30.505 |
| -86.858543 | 30.505 |
| -86.858543 | 30.505 |
| -86.858559 | 30.505 |
| -86.858559 | 30.505 |
| -86.858559 | 30.505 |
| -86.858559 | 30.505 |
| -86.858574 | 30.505 |
| -86.858574 | 30.505 |
| -86.858574 | 30.505 |
| -86.858574 | 30.505 |
| -86.858574 | 30.505 |
| -86.858574 | 30.505 |
| -86.858574 | 30.504 |
| -86.858574 | 30.504 |
| -86.858574 | 30.504 |
| -86.858574 | 30.504 |
| -86.858574 | 30.504 |
| -86.858574 | 30.504 |
| -86.858574 | 30.504 |
| -86.858559 | 30.504 |
| -86.858559 | 30.504 |
| -86.858559 | 30.504 |
| -86.858559 | 30.504 |
| -86.858559 | 30.504 |
| -86.858559 | 30.504 |
| -86.858543 | 30.504 |
| -86.858543 | 30.504 |
| -86.858528 | 30.504 |
| -86.858528 | 30.504 |
| -86.858528 | 30.504 |
| -86.858528 | 30.504 |
| -86.858513 | 30.504 |
| -86.858498 | 30.504 |
| -86.858498 | 30.504 |
| -86.858498 | 30.504 |
| -86.858498 | 30.504 |
| -86.858498 | 30.504 |
| -86.858498 | 30.504 |
| -86.858498 | 30.504 |
| -86.858498 | 30.504 |
| -86.858498 | 30.504 |
| -86.858498 | 30.504 |
| -86.858498 | 30.504 |
| -86.858482 | 30.504 |
| -86.858482 | 30.504 |
| -86.858482 | 30.503 |
| -86.858482 | 30.503 |
| -86.858482 | 30.503 |
| -86.858482 | 30.503 |
| -86.858467 | 30.503 |
| -86.858467 | 30.503 |
| -86.858452 | 30.503 |
| -86.858452 | 30.503 |
| -86.858452 | 30.503 |
| -86.858452 | 30.503 |
| -86.858452 | 30.503 |
| -86.858452 | 30.503 |
| -86.858437 | 30.503 |
| -86.858437 | 30.503 |
| -86.858437 | 30.503 |
| -86.858437 | 30.503 |
| -86.858437 | 30.503 |
| -86.858437 | 30.503 |
| -86.858437 | 30.503 |
| -86.858437 | 30.503 |
| -86.858437 | 30.503 |
| -86.858437 | 30.503 |
| -86.858437 | 30.503 |
| -86.858437 | 30.503 |
| -86.858421 | 30.503 |
| -86.858421 | 30.503 |
| -86.858421 | 30.503 |
| -86.858421 | 30.503 |
| -86.858421 | 30.503 |
| -86.858406 | 30.503 |
| -86.858406 | 30.503 |
| -86.858406 | 30.503 |
| -86.858391 | 30.502 |
| -86.858391 | 30.502 |
| -86.858368 | 30.502 |
| -86.858368 | 30.502 |
| -86.858315 | 30.502 |
| -86.858315 | 30.502 |
| -86.858269 | 30.502 |
| -86.858269 | 30.502 |
| -86.858223 | 30.502 |
| -86.858223 | 30.502 |
| -86.858162 | 30.502 |
| -86.858162 | 30.502 |
| -86.858101 | 30.502 |
| -86.858101 | 30.502 |
| -86.857979 | 30.502 |
| -86.857979 | 30.502 |
| -86.857887 | 30.502 |
| -86.857887 | 30.502 |
| -86.857811 | 30.502 |
| -86.857811 | 30.502 |
| -86.857788 | 30.502 |
| -86.857735 | 30.502 |
| -86.857658 | 30.502 |
| -86.857658 | 30.502 |
| -86.857635 | 30.502 |
| -86.857635 | 30.502 |
| -86.857574 | 30.502 |
| -86.857574 | 30.502 |
| -86.857513 | 30.502 |
| -86.857513 | 30.502 |
| -86.857422 | 30.502 |
| -86.857422 | 30.502 |
| -86.857368 | 30.502 |
| -86.857368 | 30.502 |
| -86.857292 | 30.502 |
| -86.857292 | 30.502 |
| -86.857216 | 30.502 |
| -86.857216 | 30.502 |
| -86.857155 | 30.502 |
| -86.857155 | 30.502 |
| -86.857079 | 30.502 |
| -86.857079 | 30.502 |
| -86.857079 | 30.502 |
| -86.856987 | 30.502 |
| -86.856979 | 30.502 |
| -86.856979 | 30.502 |
| -86.856926 | 30.502 |
| -86.856865 | 30.502 |
| -86.856865 | 30.502 |
| -86.856812 | 30.502 |
| -86.856812 | 30.502 |
| -86.85675 | 30.502 |
| -86.85675 | 30.502 |
| -86.856689 | 30.502 |
| -86.856689 | 30.502 |
| -86.856613 | 30.502 |
| -86.856613 | 30.502 |
| -86.856552 | 30.502 |
| -86.856552 | 30.502 |
| -86.856491 | 30.502 |
| -86.856491 | 30.502 |
| -86.856415 | 30.502 |
| -86.856415 | 30.502 |
| -86.856346 | 30.502 |
| -86.856346 | 30.502 |
| -86.85627 | 30.502 |
| -86.85627 | 30.502 |
| -86.856194 | 30.502 |
| -86.856194 | 30.502 |
| -86.856133 | 30.502 |
| -86.856133 | 30.502 |
| -86.856133 | 30.502 |
| -86.856056 | 30.502 |
| -86.856056 | 30.502 |
| -86.856056 | 30.502 |
| -86.855949 | 30.502 |
| -86.855949 | 30.502 |
| -86.855896 | 30.502 |
| -86.855896 | 30.502 |
| -86.855797 | 30.502 |
| -86.855736 | 30.502 |
| -86.855736 | 30.502 |
| -86.855675 | 30.502 |
| -86.855675 | 30.502 |
| -86.855675 | 30.502 |
| -86.855614 | 30.502 |
| -86.855614 | 30.502 |
| -86.855553 | 30.502 |
| -86.855545 | 30.502 |
| -86.855545 | 30.502 |
| -86.855492 | 30.502 |
| -86.855492 | 30.502 |
| -86.855423 | 30.502 |
| -86.855423 | 30.502 |
| -86.855362 | 30.502 |
| -86.855362 | 30.502 |
| -86.855301 | 30.502 |
| -86.855255 | 30.502 |
| -86.855194 | 30.502 |
| -86.855194 | 30.502 |
| -86.855194 | 30.502 |
| -86.855148 | 30.502 |
| -86.855148 | 30.502 |
| -86.855087 | 30.502 |
| -86.855087 | 30.502 |
| -86.855019 | 30.502 |
| -86.855019 | 30.502 |
| -86.85498 | 30.502 |
| -86.85498 | 30.502 |
| -86.854919 | 30.502 |
| -86.854919 | 30.502 |
| -86.854851 | 30.502 |
| -86.854851 | 30.502 |
| -86.854782 | 30.502 |
| -86.854782 | 30.502 |
| -86.854729 | 30.502 |
| -86.854729 | 30.502 |
| -86.854652 | 30.502 |
| -86.854645 | 30.502 |
| -86.854584 | 30.502 |
| -86.854584 | 30.502 |
| -86.854584 | 30.502 |
| -86.854492 | 30.502 |
| -86.854492 | 30.502 |
| -86.854492 | 30.502 |
| -86.854385 | 30.502 |
| -86.854385 | 30.502 |
| -86.854301 | 30.502 |
| -86.854301 | 30.502 |
| -86.85421 | 30.502 |
| -86.85421 | 30.502 |
| -86.854118 | 30.502 |
| -86.854118 | 30.502 |
| -86.854057 | 30.502 |
| -86.854057 | 30.502 |
| -86.853996 | 30.502 |
| -86.853996 | 30.502 |
| -86.85392 | 30.502 |
| -86.85392 | 30.502 |
| -86.853844 | 30.502 |
| -86.853844 | 30.502 |
| -86.853767 | 30.502 |
| -86.853767 | 30.502 |
| -86.853706 | 30.502 |
| -86.853706 | 30.502 |
| -86.85363 | 30.502 |
| -86.85363 | 30.502 |
| -86.85363 | 30.502 |
| -86.853569 | 30.502 |
| -86.853546 | 30.502 |
| -86.853546 | 30.502 |
| -86.853493 | 30.502 |
| -86.853493 | 30.502 |
| -86.853409 | 30.502 |
| -86.853409 | 30.502 |
| -86.853333 | 30.502 |
| -86.853333 | 30.502 |
| -86.853256 | 30.502 |
| -86.853256 | 30.502 |
| -86.853195 | 30.502 |
| -86.853195 | 30.502 |
| -86.853119 | 30.502 |
| -86.853119 | 30.502 |
| -86.85305 | 30.502 |
| -86.85305 | 30.502 |
| -86.852951 | 30.502 |
| -86.852951 | 30.502 |
| -86.852951 | 30.502 |
| -86.852882 | 30.502 |
| -86.852882 | 30.502 |
| -86.852814 | 30.502 |
| -86.852814 | 30.502 |
| -86.852753 | 30.502 |
| -86.852753 | 30.502 |
| -86.852623 | 30.502 |
| -86.852623 | 30.502 |
| -86.852547 | 30.502 |
| -86.852547 | 30.502 |
| -86.852547 | 30.502 |
| -86.85247 | 30.502 |
| -86.85244 | 30.502 |
| -86.85244 | 30.502 |
| -86.852364 | 30.502 |
| -86.852318 | 30.502 |
| -86.852242 | 30.502 |
| -86.852242 | 30.502 |
| -86.852165 | 30.502 |
| -86.852165 | 30.502 |
| -86.852089 | 30.502 |
| -86.852089 | 30.502 |
| -86.852013 | 30.502 |
| -86.852013 | 30.502 |
| -86.852013 | 30.502 |
| -86.851913 | 30.502 |
| -86.851913 | 30.502 |
| -86.851837 | 30.502 |
| -86.851837 | 30.502 |
| -86.851784 | 30.502 |
| -86.851784 | 30.502 |
| -86.851662 | 30.502 |
| -86.851662 | 30.502 |
| -86.851608 | 30.502 |
| -86.851608 | 30.502 |
| -86.851517 | 30.502 |
| -86.851517 | 30.502 |
| -86.85144 | 30.502 |
| -86.85144 | 30.502 |
| -86.851364 | 30.502 |
| -86.851364 | 30.502 |
| -86.851288 | 30.502 |
| -86.851196 | 30.502 |
| -86.851196 | 30.502 |
| -86.851097 | 30.502 |
| -86.851097 | 30.502 |
| -86.851021 | 30.502 |
| -86.851021 | 30.502 |
| -86.850937 | 30.502 |
| -86.850937 | 30.502 |
| -86.850868 | 30.502 |
| -86.850868 | 30.502 |
| -86.850746 | 30.502 |
| -86.850746 | 30.502 |
| -86.850723 | 30.502 |
| -86.850723 | 30.502 |
| -86.850632 | 30.502 |
| -86.850632 | 30.502 |
| -86.850555 | 30.502 |
| -86.850555 | 30.502 |
| -86.850479 | 30.502 |
| -86.850479 | 30.502 |
| -86.850365 | 30.502 |
| -86.850365 | 30.502 |
| -86.850273 | 30.502 |
| -86.850273 | 30.502 |
| -86.850197 | 30.502 |
| -86.850197 | 30.502 |
| -86.850197 | 30.502 |
| -86.850105 | 30.502 |
| -86.850029 | 30.502 |
| -86.850029 | 30.502 |
| -86.849937 | 30.502 |
| -86.849937 | 30.502 |
| -86.849846 | 30.502 |
| -86.849846 | 30.502 |
| -86.849754 | 30.502 |
| -86.849731 | 30.502 |
| -86.849648 | 30.502 |
| -86.849648 | 30.502 |
| -86.849556 | 30.502 |
| -86.849556 | 30.502 |
| -86.84948 | 30.502 |
| -86.84948 | 30.502 |
| -86.84948 | 30.502 |
| -86.849365 | 30.502 |
| -86.849365 | 30.502 |
| -86.849274 | 30.502 |
| -86.849174 | 30.502 |
| -86.849174 | 30.502 |
| -86.849098 | 30.502 |
| -86.849098 | 30.502 |
| -86.849022 | 30.502 |
| -86.849022 | 30.502 |
| -86.848946 | 30.502 |
| -86.848946 | 30.502 |
| -86.848885 | 30.502 |
| -86.848885 | 30.502 |
| -86.848808 | 30.502 |
| -86.848808 | 30.502 |
| -86.848747 | 30.502 |
| -86.848747 | 30.502 |
| -86.848656 | 30.502 |
| -86.848656 | 30.502 |
| -86.848602 | 30.502 |
| -86.848602 | 30.502 |
| -86.848526 | 30.502 |
| -86.848526 | 30.502 |
| -86.84845 | 30.502 |
| -86.84845 | 30.502 |
| -86.848396 | 30.502 |
| -86.848396 | 30.502 |
| -86.84832 | 30.502 |
| -86.848289 | 30.502 |
| -86.848228 | 30.502 |
| -86.848228 | 30.502 |
| -86.848152 | 30.502 |
| -86.848152 | 30.502 |
| -86.848152 | 30.502 |
| -86.848091 | 30.502 |
| -86.848015 | 30.502 |
| -86.848015 | 30.502 |
| -86.848015 | 30.502 |
| -86.847931 | 30.502 |
| -86.847931 | 30.502 |
| -86.847855 | 30.502 |
| -86.847855 | 30.502 |
| -86.847855 | 30.502 |
| -86.847794 | 30.502 |
| -86.847794 | 30.502 |
| -86.847717 | 30.502 |
| -86.847717 | 30.502 |
| -86.847649 | 30.502 |
| -86.847649 | 30.502 |
| -86.847572 | 30.502 |
| -86.847572 | 30.502 |
| -86.847511 | 30.502 |
| -86.847511 | 30.502 |
| -86.847435 | 30.502 |
| -86.847435 | 30.502 |
| -86.847374 | 30.502 |
| -86.847374 | 30.502 |
| -86.847298 | 30.502 |
| -86.847298 | 30.502 |
| -86.847214 | 30.502 |
| -86.847214 | 30.502 |
| -86.847153 | 30.502 |
| -86.847153 | 30.502 |
| -86.847076 | 30.502 |
| -86.847076 | 30.502 |
| -86.847015 | 30.502 |
| -86.847015 | 30.502 |
| -86.846939 | 30.502 |
| -86.846939 | 30.502 |
| -86.846863 | 30.502 |
| -86.846863 | 30.502 |
| -86.846748 | 30.502 |
| -86.846748 | 30.502 |
| -86.846657 | 30.502 |
| -86.846657 | 30.502 |
| -86.846581 | 30.502 |
| -86.846489 | 30.502 |
| -86.846489 | 30.502 |
| -86.846413 | 30.502 |
| -86.846413 | 30.502 |
| -86.846413 | 30.502 |
| -86.846336 | 30.502 |
| -86.846336 | 30.502 |
| -86.846336 | 30.502 |
| -86.846237 | 30.502 |
| -86.846237 | 30.502 |
| -86.846161 | 30.502 |
| -86.846161 | 30.502 |
| -86.846085 | 30.502 |
| -86.846085 | 30.502 |
| -86.845993 | 30.502 |
| -86.845917 | 30.502 |
| -86.845917 | 30.502 |
| -86.845818 | 30.502 |
| -86.845818 | 30.502 |
| -86.845795 | 30.502 |
| -86.845795 | 30.502 |
| -86.845741 | 30.502 |
| -86.84565 | 30.502 |
| -86.84565 | 30.502 |
| -86.845566 | 30.502 |
| -86.845566 | 30.502 |
| -86.845474 | 30.502 |
| -86.845474 | 30.502 |
| -86.845398 | 30.502 |
| -86.845398 | 30.502 |
| -86.845306 | 30.502 |
| -86.845306 | 30.502 |
| -86.845207 | 30.502 |
| -86.845207 | 30.502 |
| -86.845131 | 30.502 |
| -86.845131 | 30.502 |
| -86.845039 | 30.502 |
| -86.845039 | 30.502 |
| -86.844948 | 30.502 |
| -86.844948 | 30.502 |
| -86.844856 | 30.502 |
| -86.844872 | 30.502 |
| -86.84478 | 30.502 |
| -86.84478 | 30.502 |
| -86.84478 | 30.502 |
| -86.844688 | 30.502 |
| -86.844688 | 30.502 |
| -86.844597 | 30.502 |
| -86.844597 | 30.502 |
| -86.844597 | 30.502 |
| -86.844482 | 30.502 |
| -86.844482 | 30.502 |
| -86.844429 | 30.502 |
| -86.844429 | 30.502 |
| -86.844315 | 30.502 |
| -86.844238 | 30.502 |
| -86.844238 | 30.502 |
| -86.844238 | 30.502 |
| -86.844238 | 30.502 |
| -86.844139 | 30.502 |
| -86.844139 | 30.502 |
| -86.844063 | 30.502 |
| -86.844063 | 30.502 |
| -86.843964 | 30.502 |
| -86.843964 | 30.502 |
| -86.843903 | 30.502 |
| -86.843903 | 30.502 |
| -86.843811 | 30.502 |
| -86.843811 | 30.502 |
| -86.843735 | 30.502 |
| -86.843712 | 30.502 |
| -86.843643 | 30.502 |
| -86.843643 | 30.502 |
| -86.843582 | 30.502 |
| -86.843582 | 30.502 |
| -86.843468 | 30.502 |
| -86.843468 | 30.502 |
| -86.843414 | 30.502 |
| -86.843414 | 30.502 |
| -86.843315 | 30.502 |
| -86.843315 | 30.502 |
| -86.843224 | 30.502 |
| -86.843224 | 30.502 |
| -86.843224 | 30.502 |
| -86.843224 | 30.502 |
| -86.843163 | 30.502 |
| -86.843163 | 30.502 |
| -86.843086 | 30.502 |
| -86.843086 | 30.502 |
| -86.84301 | 30.502 |
| -86.84301 | 30.502 |
| -86.842918 | 30.502 |
| -86.842842 | 30.502 |
| -86.842842 | 30.502 |
| -86.842766 | 30.502 |
| -86.842743 | 30.502 |
| -86.842651 | 30.502 |
| -86.842651 | 30.502 |
| -86.842575 | 30.502 |
| -86.842575 | 30.502 |
| -86.842484 | 30.502 |
| -86.842484 | 30.502 |
| -86.842407 | 30.502 |
| -86.842407 | 30.502 |
| -86.842316 | 30.502 |
| -86.842224 | 30.502 |
| -86.842224 | 30.502 |
| -86.842224 | 30.502 |
| -86.842224 | 30.502 |
| -86.842148 | 30.502 |
| -86.842148 | 30.502 |
| -86.842049 | 30.502 |
| -86.842049 | 30.502 |
| -86.841957 | 30.502 |
| -86.841866 | 30.502 |
| -86.841866 | 30.502 |
| -86.841789 | 30.502 |
| -86.841789 | 30.502 |
| -86.841789 | 30.502 |
| -86.841675 | 30.502 |
| -86.841675 | 30.502 |
| -86.841599 | 30.502 |
| -86.841599 | 30.502 |
| -86.841507 | 30.502 |
| -86.841507 | 30.502 |
| -86.841454 | 30.502 |
| -86.841454 | 30.502 |
| -86.841339 | 30.502 |
| -86.841339 | 30.502 |
| -86.84124 | 30.502 |
| -86.84124 | 30.502 |
| -86.84124 | 30.502 |
| -86.841148 | 30.502 |
| -86.841148 | 30.502 |
| -86.841148 | 30.502 |
| -86.841072 | 30.502 |
| -86.840981 | 30.502 |
| -86.840981 | 30.502 |
| -86.840904 | 30.502 |
| -86.840904 | 30.502 |
| -86.840813 | 30.502 |
| -86.840813 | 30.502 |
| -86.840721 | 30.502 |
| -86.840721 | 30.502 |
| -86.840721 | 30.502 |
| -86.840607 | 30.502 |
| -86.840607 | 30.502 |
| -86.840607 | 30.502 |
| -86.840492 | 30.502 |
| -86.840492 | 30.502 |
| -86.840439 | 30.502 |
| -86.840439 | 30.502 |
| -86.840347 | 30.502 |
| -86.840256 | 30.502 |
| -86.840256 | 30.502 |
| -86.840164 | 30.502 |
| -86.840164 | 30.502 |
| -86.840088 | 30.502 |
| -86.840088 | 30.502 |
| -86.839996 | 30.502 |
| -86.839996 | 30.502 |
| -86.839905 | 30.502 |
| -86.839905 | 30.502 |
| -86.839905 | 30.502 |
| -86.839905 | 30.502 |
| -86.83979 | 30.502 |
| -86.83979 | 30.502 |
| -86.839699 | 30.502 |
| -86.839699 | 30.502 |
| -86.839622 | 30.502 |
| -86.839622 | 30.502 |
| -86.839508 | 30.502 |
| -86.839508 | 30.502 |
| -86.839401 | 30.502 |
| -86.839401 | 30.502 |
| -86.839325 | 30.502 |
| -86.839325 | 30.502 |
| -86.839218 | 30.502 |
| -86.839218 | 30.502 |
| -86.839127 | 30.502 |
| -86.839127 | 30.502 |
| -86.83905 | 30.502 |
| -86.83905 | 30.502 |
| -86.838936 | 30.502 |
| -86.838936 | 30.502 |
| -86.838867 | 30.502 |
| -86.838867 | 30.502 |
| -86.838776 | 30.502 |
| -86.838776 | 30.502 |
| -86.838661 | 30.502 |
| -86.838661 | 30.502 |
| -86.838661 | 30.502 |
| -86.83857 | 30.502 |
| -86.83857 | 30.502 |
| -86.83857 | 30.502 |
| -86.838493 | 30.502 |
| -86.838493 | 30.502 |
| -86.838402 | 30.502 |
| -86.838402 | 30.502 |
| -86.83831 | 30.502 |
| -86.838211 | 30.502 |
| -86.838211 | 30.502 |
| -86.83812 | 30.502 |
| -86.83812 | 30.502 |
| -86.83812 | 30.502 |
| -86.838028 | 30.502 |
| -86.838005 | 30.502 |
| -86.838005 | 30.502 |
| -86.837936 | 30.502 |
| -86.837936 | 30.502 |
| -86.837845 | 30.502 |
| -86.837845 | 30.502 |
| -86.837753 | 30.502 |
| -86.837753 | 30.502 |
| -86.837662 | 30.502 |
| -86.837662 | 30.502 |
| -86.837547 | 30.502 |
| -86.837547 | 30.502 |
| -86.83744 | 30.502 |
| -86.83744 | 30.502 |
| -86.837341 | 30.502 |
| -86.837341 | 30.502 |
| -86.83725 | 30.502 |
| -86.83725 | 30.502 |
| -86.837158 | 30.502 |
| -86.837158 | 30.502 |
| -86.837067 | 30.502 |
| -86.837044 | 30.502 |
| -86.836952 | 30.502 |
| -86.836952 | 30.502 |
| -86.836952 | 30.502 |
| -86.836861 | 30.502 |
| -86.836769 | 30.502 |
| -86.836769 | 30.502 |
| -86.836769 | 30.502 |
| -86.836655 | 30.502 |
| -86.836655 | 30.502 |
| -86.836548 | 30.502 |
| -86.836548 | 30.502 |
| -86.836456 | 30.502 |
| -86.836456 | 30.502 |
| -86.836365 | 30.502 |
| -86.836365 | 30.502 |
| -86.83625 | 30.502 |
| -86.83625 | 30.502 |
| -86.836166 | 30.502 |
| -86.836166 | 30.502 |
| -86.836075 | 30.502 |
| -86.836075 | 30.502 |
| -86.83596 | 30.502 |
| -86.83596 | 30.502 |
| -86.835938 | 30.502 |
| -86.835869 | 30.502 |
| -86.835869 | 30.502 |
| -86.835869 | 30.502 |
| -86.835754 | 30.502 |
| -86.835754 | 30.502 |
| -86.835686 | 30.502 |
| -86.835686 | 30.502 |
| -86.835587 | 30.502 |
| -86.835587 | 30.502 |
| -86.835495 | 30.502 |
| -86.835495 | 30.502 |
| -86.835396 | 30.502 |
| -86.835411 | 30.502 |
| -86.835388 | 30.502 |
| -86.835388 | 30.502 |
| -86.835304 | 30.502 |
| -86.835228 | 30.502 |
| -86.835228 | 30.502 |
| -86.835167 | 30.502 |
| -86.835167 | 30.502 |
| -86.835167 | 30.502 |
| -86.835106 | 30.502 |
| -86.835106 | 30.502 |
| -86.835075 | 30.502 |
| -86.835075 | 30.502 |
| -86.835045 | 30.502 |
| -86.835045 | 30.502 |
| -86.83503 | 30.502 |
| -86.83503 | 30.502 |
| -86.835014 | 30.502 |
| -86.835014 | 30.502 |
| -86.835014 | 30.502 |
| -86.835014 | 30.502 |
| -86.83503 | 30.502 |
| -86.83503 | 30.502 |
| -86.83506 | 30.502 |
| -86.83506 | 30.502 |
| -86.835091 | 30.502 |
| -86.835091 | 30.502 |
| -86.835121 | 30.502 |
| -86.835121 | 30.502 |
| -86.835152 | 30.502 |
| -86.835152 | 30.502 |
| -86.835182 | 30.502 |
| -86.835182 | 30.502 |
| -86.835213 | 30.502 |
| -86.835213 | 30.502 |
| -86.835228 | 30.501 |
| -86.835228 | 30.501 |
| -86.835243 | 30.501 |
| -86.835243 | 30.501 |
| -86.835258 | 30.501 |
| -86.835258 | 30.501 |
| -86.835258 | 30.501 |
| -86.835258 | 30.501 |
| -86.835274 | 30.501 |
| -86.835289 | 30.501 |
| -86.835289 | 30.501 |
| -86.835289 | 30.501 |
| -86.835304 | 30.501 |
| -86.835304 | 30.501 |
| -86.835304 | 30.501 |
| -86.835304 | 30.501 |
| -86.83532 | 30.501 |
| -86.83532 | 30.501 |
| -86.83532 | 30.501 |
| -86.83532 | 30.501 |
| -86.835335 | 30.501 |
| -86.835335 | 30.501 |
| -86.835335 | 30.501 |
| -86.835335 | 30.501 |
| -86.835335 | 30.501 |
| -86.835335 | 30.501 |
| -86.83532 | 30.501 |
| -86.83532 | 30.501 |
| -86.83532 | 30.501 |
| -86.83532 | 30.501 |
| -86.83532 | 30.501 |
| -86.83532 | 30.501 |
| -86.83532 | 30.501 |
| -86.835304 | 30.501 |
| -86.835304 | 30.501 |
| -86.835304 | 30.501 |
| -86.835304 | 30.501 |
| -86.835304 | 30.501 |
| -86.835304 | 30.501 |
| -86.835289 | 30.5 |
| -86.835289 | 30.5 |
| -86.835289 | 30.5 |
| -86.835289 | 30.5 |
| -86.835289 | 30.5 |
| -86.835289 | 30.5 |
| -86.835304 | 30.5 |
| -86.835304 | 30.5 |
| -86.835304 | 30.5 |
| -86.835304 | 30.5 |
| -86.835304 | 30.5 |
| -86.835304 | 30.5 |
| -86.83532 | 30.5 |
| -86.83532 | 30.5 |
| -86.83532 | 30.5 |
| -86.83532 | 30.5 |
| -86.83532 | 30.5 |
| -86.83532 | 30.5 |
| -86.83532 | 30.5 |
| -86.83532 | 30.5 |
| -86.83532 | 30.5 |
| -86.83532 | 30.5 |
| -86.83532 | 30.5 |
| -86.835304 | 30.5 |
| -86.835304 | 30.5 |
| -86.835304 | 30.5 |
| -86.835304 | 30.5 |
| -86.83532 | 30.5 |
| -86.83532 | 30.5 |
| -86.83532 | 30.5 |
| -86.83532 | 30.5 |
| -86.83532 | 30.5 |
| -86.835335 | 30.5 |
| -86.835335 | 30.5 |
| -86.835335 | 30.5 |
| -86.835335 | 30.5 |
| -86.835335 | 30.5 |
| -86.835335 | 30.5 |
| -86.835335 | 30.5 |
| -86.835335 | 30.499 |
| -86.835335 | 30.499 |
| -86.835335 | 30.499 |
| -86.835335 | 30.499 |
| -86.835335 | 30.499 |
| -86.835335 | 30.499 |
| -86.835335 | 30.499 |
| -86.835335 | 30.499 |
| -86.835335 | 30.499 |
| -86.835335 | 30.499 |
| -86.835335 | 30.499 |
| -86.835335 | 30.499 |
| -86.835335 | 30.499 |
| -86.835335 | 30.499 |
| -86.83532 | 30.499 |
| -86.83532 | 30.499 |
| -86.83532 | 30.499 |
| -86.83532 | 30.499 |
| -86.83532 | 30.499 |
| -86.83532 | 30.499 |
| -86.83532 | 30.499 |
| -86.83532 | 30.499 |
| -86.835335 | 30.499 |
| -86.835335 | 30.499 |
| -86.835335 | 30.499 |
| -86.835335 | 30.499 |
| -86.835335 | 30.499 |
| -86.835335 | 30.499 |
| -86.835335 | 30.499 |
| -86.835335 | 30.499 |
| -86.835335 | 30.499 |
| -86.835335 | 30.499 |
| -86.835335 | 30.499 |
| -86.835335 | 30.499 |
| -86.835335 | 30.499 |
| -86.835335 | 30.498 |
| -86.835335 | 30.498 |
| -86.835335 | 30.498 |
| -86.835335 | 30.498 |
| -86.835335 | 30.498 |
| -86.835335 | 30.498 |
| -86.835335 | 30.498 |
| -86.835335 | 30.498 |
| -86.835335 | 30.498 |
| -86.835335 | 30.498 |
| -86.835335 | 30.498 |
| -86.835335 | 30.498 |
| -86.835335 | 30.498 |
| -86.835335 | 30.498 |
| -86.835335 | 30.498 |
| -86.835335 | 30.498 |
| -86.835335 | 30.498 |
| -86.835335 | 30.498 |
| -86.835335 | 30.498 |
| -86.835335 | 30.498 |
| -86.83535 | 30.498 |
| -86.83535 | 30.498 |
| -86.835365 | 30.498 |
| -86.835365 | 30.498 |
| -86.835403 | 30.498 |
| -86.835403 | 30.498 |
| -86.835449 | 30.498 |
| -86.835449 | 30.498 |
| -86.835503 | 30.498 |
| -86.835503 | 30.498 |
| -86.835564 | 30.498 |
| -86.835564 | 30.498 |
| -86.835625 | 30.498 |
| -86.835625 | 30.498 |
| -86.835732 | 30.498 |
| -86.835732 | 30.498 |
| -86.835808 | 30.498 |
| -86.835808 | 30.498 |
| -86.835907 | 30.498 |
| -86.835907 | 30.498 |
| -86.835999 | 30.498 |
| -86.835999 | 30.498 |
| -86.836075 | 30.498 |
| -86.836075 | 30.498 |
| -86.836189 | 30.498 |
| -86.836189 | 30.498 |
| -86.836266 | 30.498 |
| -86.836266 | 30.498 |
| -86.836357 | 30.498 |
| -86.836357 | 30.498 |
| -86.836357 | 30.498 |
| -86.836357 | 30.498 |
| -86.83654 | 30.498 |
| -86.83654 | 30.498 |
| -86.836632 | 30.498 |
| -86.836632 | 30.498 |
| -86.836723 | 30.498 |
| -86.836723 | 30.498 |
| -86.836815 | 30.498 |
| -86.836815 | 30.498 |
| -86.836838 | 30.498 |
| -86.836906 | 30.498 |
| -86.836906 | 30.498 |
| -86.836998 | 30.498 |
| -86.837021 | 30.498 |
| -86.83709 | 30.498 |
| -86.837181 | 30.498 |
| -86.837181 | 30.498 |
| -86.837273 | 30.498 |
| -86.837273 | 30.498 |
| -86.837296 | 30.498 |
| -86.837364 | 30.498 |
| -86.837364 | 30.498 |
| -86.837364 | 30.498 |
| -86.837509 | 30.498 |
| -86.837509 | 30.498 |
| -86.837555 | 30.498 |
| -86.837555 | 30.498 |
| -86.837646 | 30.498 |
| -86.837646 | 30.498 |
| -86.837723 | 30.498 |
| -86.837723 | 30.498 |
| -86.83786 | 30.498 |
| -86.837914 | 30.498 |
| -86.837914 | 30.498 |
| -86.838005 | 30.498 |
| -86.838028 | 30.498 |
| -86.838081 | 30.498 |
| -86.838081 | 30.498 |
| -86.838081 | 30.498 |
| -86.838173 | 30.498 |
| -86.838173 | 30.498 |
| -86.838264 | 30.498 |
| -86.838264 | 30.498 |
| -86.838402 | 30.498 |
| -86.838402 | 30.498 |
| -86.83847 | 30.498 |
| -86.838547 | 30.498 |
| -86.838547 | 30.498 |
| -86.838623 | 30.498 |
| -86.838623 | 30.498 |
| -86.838715 | 30.498 |
| -86.838715 | 30.498 |
| -86.838715 | 30.498 |
| -86.838829 | 30.498 |
| -86.838829 | 30.498 |
| -86.838829 | 30.498 |
| -86.838928 | 30.498 |
| -86.838997 | 30.498 |
| -86.838997 | 30.498 |
| -86.839088 | 30.498 |
| -86.839088 | 30.498 |
| -86.83918 | 30.498 |
| -86.83918 | 30.498 |
| -86.839272 | 30.498 |
| -86.839272 | 30.498 |
| -86.839272 | 30.498 |
| -86.839363 | 30.498 |
| -86.839363 | 30.498 |
| -86.839363 | 30.498 |
| -86.839439 | 30.498 |
| -86.839439 | 30.498 |
| -86.839577 | 30.498 |
| -86.839645 | 30.498 |
| -86.839645 | 30.498 |
| -86.839737 | 30.498 |
| -86.839737 | 30.498 |
| -86.839813 | 30.498 |
| -86.839813 | 30.498 |
| -86.83989 | 30.498 |
| -86.839981 | 30.498 |
| -86.839981 | 30.498 |
| -86.839981 | 30.498 |
| -86.839981 | 30.498 |
| -86.840073 | 30.498 |
| -86.840073 | 30.498 |
| -86.840187 | 30.498 |
| -86.840187 | 30.498 |
| -86.840263 | 30.498 |
| -86.840263 | 30.498 |
| -86.840355 | 30.498 |
| -86.840355 | 30.498 |
| -86.840446 | 30.498 |
| -86.840446 | 30.498 |
| -86.840538 | 30.498 |
| -86.840538 | 30.498 |
| -86.840614 | 30.498 |
| -86.840706 | 30.498 |
| -86.840706 | 30.498 |
| -86.840782 | 30.498 |
| -86.840782 | 30.498 |
| -86.840782 | 30.498 |
| -86.840782 | 30.498 |
| -86.840897 | 30.498 |
| -86.840897 | 30.498 |
| -86.840965 | 30.498 |
| -86.840965 | 30.498 |
| -86.841103 | 30.498 |
| -86.841103 | 30.498 |
| -86.841171 | 30.498 |
| -86.841171 | 30.498 |
| -86.841263 | 30.498 |
| -86.841263 | 30.498 |
| -86.841377 | 30.498 |
| -86.841377 | 30.498 |
| -86.841446 | 30.498 |
| -86.841446 | 30.498 |
| -86.841446 | 30.498 |
| -86.841446 | 30.498 |
| -86.841537 | 30.498 |
| -86.841537 | 30.498 |
| -86.841667 | 30.498 |
| -86.841667 | 30.498 |
| -86.841766 | 30.498 |
| -86.841766 | 30.498 |
| -86.841835 | 30.498 |
| -86.841835 | 30.498 |
| -86.841949 | 30.498 |
| -86.841949 | 30.498 |
| -86.842003 | 30.498 |
| -86.842003 | 30.498 |
| -86.842094 | 30.498 |
| -86.842094 | 30.498 |
| -86.842178 | 30.498 |
| -86.842178 | 30.498 |
| -86.842255 | 30.498 |
| -86.842255 | 30.498 |
| -86.842346 | 30.498 |
| -86.842346 | 30.498 |
| -86.842346 | 30.498 |
| -86.842422 | 30.498 |
| -86.842422 | 30.498 |
| -86.842499 | 30.498 |
| -86.842499 | 30.498 |
| -86.842613 | 30.498 |
| -86.842636 | 30.498 |
| -86.842636 | 30.498 |
| -86.84269 | 30.498 |
| -86.842766 | 30.498 |
| -86.842766 | 30.498 |
| -86.84288 | 30.498 |
| -86.84288 | 30.498 |
| -86.842957 | 30.498 |
| -86.842957 | 30.498 |
| -86.842957 | 30.498 |
| -86.84304 | 30.498 |
| -86.84304 | 30.498 |
| -86.84304 | 30.498 |
| -86.843132 | 30.498 |
| -86.843132 | 30.498 |
| -86.843208 | 30.498 |
| -86.843208 | 30.498 |
| -86.843285 | 30.498 |
| -86.843285 | 30.498 |
| -86.843369 | 30.498 |
| -86.843369 | 30.498 |
| -86.843437 | 30.498 |
| -86.843437 | 30.498 |
| -86.843437 | 30.498 |
| -86.843536 | 30.498 |
| -86.843536 | 30.498 |
| -86.843613 | 30.498 |
| -86.843613 | 30.498 |
| -86.843689 | 30.498 |
| -86.843689 | 30.498 |
| -86.843781 | 30.498 |
| -86.843781 | 30.498 |
| -86.84388 | 30.498 |
| -86.84388 | 30.498 |
| -86.843933 | 30.498 |
| -86.843933 | 30.498 |
| -86.844025 | 30.498 |
| -86.844025 | 30.498 |
| -86.844124 | 30.498 |
| -86.844124 | 30.498 |
| -86.8442 | 30.498 |
| -86.8442 | 30.498 |
| -86.844292 | 30.498 |
| -86.844292 | 30.498 |
| -86.844368 | 30.498 |
| -86.844368 | 30.498 |
| -86.844444 | 30.498 |
| -86.844444 | 30.498 |
| -86.844521 | 30.498 |
| -86.844521 | 30.498 |
| -86.844597 | 30.498 |
| -86.844597 | 30.498 |
| -86.844711 | 30.498 |
| -86.844711 | 30.498 |
| -86.844788 | 30.498 |
| -86.844788 | 30.498 |
| -86.844864 | 30.498 |
| -86.844864 | 30.498 |
| -86.844955 | 30.498 |
| -86.845032 | 30.498 |
| -86.845032 | 30.498 |
| -86.845123 | 30.498 |
| -86.845123 | 30.498 |
| -86.845123 | 30.498 |
| -86.8452 | 30.498 |
| -86.8452 | 30.498 |
| -86.845299 | 30.498 |
| -86.845352 | 30.498 |
| -86.845352 | 30.498 |
| -86.845413 | 30.498 |
| -86.845543 | 30.498 |
| -86.845543 | 30.498 |
| -86.845619 | 30.498 |
| -86.845619 | 30.498 |
| -86.84568 | 30.498 |
| -86.84568 | 30.498 |
| -86.845772 | 30.498 |
| -86.845772 | 30.498 |
| -86.845833 | 30.498 |
| -86.845833 | 30.498 |
| -86.845833 | 30.498 |
| -86.845833 | 30.498 |
| -86.845917 | 30.498 |
| -86.845917 | 30.498 |
| -86.845985 | 30.498 |
| -86.845985 | 30.498 |
| -86.846069 | 30.498 |
| -86.846069 | 30.498 |
| -86.846153 | 30.498 |
| -86.846153 | 30.498 |
| -86.846222 | 30.498 |
| -86.846222 | 30.498 |
| -86.846283 | 30.498 |
| -86.846283 | 30.498 |
| -86.846359 | 30.498 |
| -86.846359 | 30.498 |
| -86.846359 | 30.498 |
| -86.84642 | 30.498 |
| -86.846428 | 30.498 |
| -86.846428 | 30.498 |
| -86.846504 | 30.498 |
| -86.846504 | 30.498 |
| -86.846588 | 30.498 |
| -86.846588 | 30.498 |
| -86.846657 | 30.498 |
| -86.846657 | 30.498 |
| -86.846725 | 30.498 |
| -86.846725 | 30.498 |
| -86.846817 | 30.498 |
| -86.846817 | 30.498 |
| -86.846909 | 30.498 |
| -86.846909 | 30.498 |
| -86.846909 | 30.498 |
| -86.846977 | 30.498 |
| -86.846977 | 30.498 |
| -86.847069 | 30.498 |
| -86.847069 | 30.498 |
| -86.84716 | 30.498 |
| -86.84716 | 30.498 |
| -86.847191 | 30.498 |
| -86.847191 | 30.498 |
| -86.847282 | 30.498 |
| -86.847282 | 30.498 |
| -86.847374 | 30.498 |
| -86.847374 | 30.498 |
| -86.84745 | 30.498 |
| -86.84745 | 30.498 |
| -86.847527 | 30.498 |
| -86.847527 | 30.498 |
| -86.847618 | 30.498 |
| -86.847618 | 30.498 |
| -86.847694 | 30.498 |
| -86.847694 | 30.498 |
| -86.847771 | 30.498 |
| -86.847771 | 30.498 |
| -86.847847 | 30.498 |
| -86.847847 | 30.498 |
| -86.847847 | 30.498 |
| -86.847923 | 30.498 |
| -86.848015 | 30.498 |
| -86.848015 | 30.498 |
| -86.848091 | 30.498 |
| -86.848091 | 30.498 |
| -86.848091 | 30.498 |
| -86.848091 | 30.498 |
| -86.84819 | 30.498 |
| -86.84819 | 30.498 |
| -86.848267 | 30.498 |
| -86.848267 | 30.498 |
| -86.848366 | 30.498 |
| -86.848366 | 30.498 |
| -86.848419 | 30.498 |
| -86.848419 | 30.498 |
| -86.848495 | 30.498 |
| -86.848495 | 30.498 |
| -86.848572 | 30.498 |
| -86.848572 | 30.498 |
| -86.84864 | 30.498 |
| -86.84864 | 30.498 |
| -86.848717 | 30.498 |
| -86.848717 | 30.498 |
| -86.848816 | 30.498 |
| -86.848816 | 30.498 |
| -86.848892 | 30.498 |
| -86.848892 | 30.498 |
| -86.848999 | 30.498 |
| -86.848999 | 30.498 |
| -86.849075 | 30.498 |
| -86.849075 | 30.498 |
| -86.849152 | 30.498 |
| -86.849152 | 30.498 |
| -86.849228 | 30.498 |
| -86.849228 | 30.498 |
| -86.849228 | 30.498 |
| -86.849228 | 30.498 |
| -86.849327 | 30.498 |
| -86.849327 | 30.498 |
| -86.849419 | 30.498 |
| -86.849419 | 30.498 |
| -86.849487 | 30.498 |
| -86.849487 | 30.498 |
| -86.849556 | 30.498 |
| -86.849556 | 30.498 |
| -86.849556 | 30.498 |
| -86.849556 | 30.498 |
| -86.849678 | 30.498 |
| -86.849678 | 30.498 |
| -86.849739 | 30.498 |
| -86.849739 | 30.498 |
| -86.849823 | 30.498 |
| -86.849823 | 30.498 |
| -86.849922 | 30.498 |
| -86.849922 | 30.498 |
| -86.849922 | 30.498 |
| -86.849998 | 30.498 |
| -86.849998 | 30.498 |
| -86.85009 | 30.498 |
| -86.85009 | 30.498 |
| -86.850166 | 30.498 |
| -86.850166 | 30.498 |
| -86.850258 | 30.498 |
| -86.850258 | 30.498 |
| -86.850357 | 30.498 |
| -86.850357 | 30.498 |
| -86.850449 | 30.498 |
| -86.850449 | 30.498 |
| -86.850525 | 30.498 |
| -86.850525 | 30.498 |
| -86.850601 | 30.498 |
| -86.850601 | 30.498 |
| -86.850677 | 30.498 |
| -86.850677 | 30.498 |
| -86.850769 | 30.498 |
| -86.850769 | 30.498 |
| -86.85083 | 30.498 |
| -86.85083 | 30.498 |
| -86.850922 | 30.498 |
| -86.850922 | 30.498 |
| -86.850998 | 30.498 |
| -86.850998 | 30.498 |
| -86.851097 | 30.498 |
| -86.851097 | 30.498 |
| -86.851097 | 30.498 |
| -86.851173 | 30.498 |
| -86.851173 | 30.498 |
| -86.85125 | 30.498 |
| -86.85125 | 30.498 |
| -86.851326 | 30.498 |
| -86.851402 | 30.498 |
| -86.851402 | 30.498 |
| -86.851479 | 30.498 |
| -86.851479 | 30.498 |
| -86.851479 | 30.498 |
| -86.85157 | 30.498 |
| -86.851593 | 30.498 |
| -86.851593 | 30.498 |
| -86.851669 | 30.498 |
| -86.851669 | 30.498 |
| -86.851746 | 30.498 |
| -86.851822 | 30.498 |
| -86.851822 | 30.498 |
| -86.851913 | 30.498 |
| -86.851913 | 30.498 |
| -86.85199 | 30.498 |
| -86.85199 | 30.498 |
| -86.852104 | 30.498 |
| -86.852104 | 30.498 |
| -86.85218 | 30.498 |
| -86.852203 | 30.498 |
| -86.852203 | 30.498 |
| -86.852272 | 30.498 |
| -86.852272 | 30.498 |
| -86.852348 | 30.498 |
| -86.852348 | 30.498 |
| -86.852463 | 30.498 |
| -86.852463 | 30.498 |
| -86.852554 | 30.498 |
| -86.852646 | 30.498 |
| -86.852646 | 30.498 |
| -86.852722 | 30.498 |
| -86.852722 | 30.498 |
| -86.852722 | 30.498 |
| -86.852837 | 30.498 |
| -86.852852 | 30.498 |
| -86.852852 | 30.498 |
| -86.852943 | 30.498 |
| -86.852943 | 30.498 |
| -86.85302 | 30.498 |
| -86.85302 | 30.498 |
| -86.853111 | 30.498 |
| -86.853134 | 30.498 |
| -86.853203 | 30.498 |
| -86.853203 | 30.498 |
| -86.853294 | 30.498 |
| -86.853294 | 30.498 |
| -86.853371 | 30.498 |
| -86.853371 | 30.498 |
| -86.853462 | 30.498 |
| -86.853462 | 30.498 |
| -86.853554 | 30.498 |
| -86.853676 | 30.498 |
| -86.853676 | 30.498 |
| -86.853722 | 30.498 |
| -86.853722 | 30.498 |
| -86.853859 | 30.498 |
| -86.853859 | 30.498 |
| -86.853912 | 30.498 |
| -86.853912 | 30.498 |
| -86.854004 | 30.498 |
| -86.854004 | 30.498 |
| -86.854118 | 30.498 |
| -86.854118 | 30.498 |
| -86.854172 | 30.498 |
| -86.854172 | 30.498 |
| -86.854248 | 30.498 |
| -86.85434 | 30.498 |
| -86.85434 | 30.498 |
| -86.854401 | 30.498 |
| -86.854401 | 30.498 |
| -86.854401 | 30.498 |
| -86.8545 | 30.498 |
| -86.854546 | 30.498 |
| -86.854546 | 30.498 |
| -86.854637 | 30.498 |
| -86.854637 | 30.498 |
| -86.854729 | 30.498 |
| -86.854729 | 30.498 |
| -86.854805 | 30.498 |
| -86.854805 | 30.498 |
| -86.854805 | 30.498 |
| -86.854904 | 30.498 |
| -86.854904 | 30.498 |
| -86.854996 | 30.498 |
| -86.854996 | 30.498 |
| -86.855072 | 30.498 |
| -86.855072 | 30.498 |
| -86.855186 | 30.498 |
| -86.855186 | 30.498 |
| -86.855255 | 30.498 |
| -86.855255 | 30.498 |
| -86.855347 | 30.498 |
| -86.855347 | 30.498 |
| -86.855446 | 30.498 |
| -86.855446 | 30.498 |
| -86.855537 | 30.498 |
| -86.855537 | 30.498 |
| -86.855629 | 30.498 |
| -86.855629 | 30.498 |
| -86.855721 | 30.498 |
| -86.855721 | 30.498 |
| -86.855812 | 30.498 |
| -86.855812 | 30.498 |
| -86.855888 | 30.498 |
| -86.855888 | 30.498 |
| -86.85598 | 30.498 |
| -86.85598 | 30.498 |
| -86.85598 | 30.498 |
| -86.856071 | 30.498 |
| -86.856148 | 30.498 |
| -86.856148 | 30.498 |
| -86.856148 | 30.498 |
| -86.856148 | 30.498 |
| -86.856262 | 30.498 |
| -86.856262 | 30.498 |
| -86.856354 | 30.498 |
| -86.856354 | 30.498 |
| -86.85643 | 30.498 |
| -86.85643 | 30.498 |
| -86.856537 | 30.498 |
| -86.856537 | 30.498 |
| -86.856606 | 30.498 |
| -86.856606 | 30.498 |
| -86.856682 | 30.498 |
| -86.856682 | 30.498 |
| -86.856796 | 30.498 |
| -86.856796 | 30.498 |
| -86.85685 | 30.498 |
| -86.85685 | 30.498 |
| -86.856941 | 30.498 |
| -86.856941 | 30.498 |
| -86.856941 | 30.498 |
| -86.85704 | 30.498 |
| -86.85704 | 30.498 |
| -86.857132 | 30.498 |
| -86.857132 | 30.498 |
| -86.857231 | 30.498 |
| -86.857231 | 30.498 |
| -86.8573 | 30.498 |
| -86.8573 | 30.498 |
| -86.857384 | 30.498 |
| -86.857384 | 30.498 |
| -86.857475 | 30.498 |
| -86.857475 | 30.498 |
| -86.857552 | 30.498 |
| -86.857552 | 30.498 |
| -86.857643 | 30.498 |
| -86.857643 | 30.498 |
| -86.857719 | 30.498 |
| -86.857719 | 30.498 |
| -86.857719 | 30.498 |
| -86.857811 | 30.498 |
| -86.857811 | 30.498 |
| -86.857811 | 30.498 |
| -86.857925 | 30.498 |
| -86.857925 | 30.498 |
| -86.858002 | 30.498 |
| -86.858002 | 30.498 |
| -86.858093 | 30.498 |
| -86.858093 | 30.498 |
| -86.858185 | 30.498 |
| -86.858185 | 30.498 |
| -86.858307 | 30.498 |
| -86.858307 | 30.498 |
| -86.858376 | 30.498 |
| -86.858376 | 30.498 |
| -86.858452 | 30.498 |
| -86.858452 | 30.498 |
| -86.858452 | 30.498 |
| -86.858452 | 30.498 |
| -86.858566 | 30.498 |
| -86.858566 | 30.498 |
| -86.858643 | 30.498 |
| -86.858643 | 30.498 |
| -86.858727 | 30.498 |
| -86.858727 | 30.498 |
| -86.858749 | 30.498 |
| -86.858749 | 30.498 |
| -86.85881 | 30.498 |
| -86.85881 | 30.498 |
| -86.858879 | 30.498 |
| -86.858879 | 30.498 |
| -86.85894 | 30.498 |
| -86.858955 | 30.498 |
| -86.858955 | 30.498 |
| -86.858955 | 30.498 |
| -86.858955 | 30.498 |
| -86.859016 | 30.498 |
| -86.859016 | 30.498 |
| -86.859016 | 30.498 |
| -86.859016 | 30.498 |
| -86.859032 | 30.499 |
| -86.859032 | 30.499 |
| -86.859032 | 30.499 |
| -86.859032 | 30.499 |
| -86.859016 | 30.499 |
| -86.859016 | 30.499 |
| -86.859001 | 30.499 |
| -86.858971 | 30.499 |
| -86.858971 | 30.499 |
| -86.858917 | 30.499 |
| -86.858917 | 30.499 |
| -86.858917 | 30.499 |
| -86.858871 | 30.499 |
| -86.858871 | 30.499 |
| -86.858871 | 30.499 |
| -86.85881 | 30.499 |
| -86.85881 | 30.499 |
| -86.858757 | 30.499 |
| -86.858757 | 30.499 |
| -86.858673 | 30.499 |
| -86.858673 | 30.499 |
| -86.858597 | 30.499 |
| -86.858597 | 30.499 |
| -86.858521 | 30.499 |
| -86.858521 | 30.499 |
| -86.858414 | 30.5 |
| -86.858414 | 30.5 |
| -86.858337 | 30.5 |
| -86.858337 | 30.5 |
| -86.858246 | 30.5 |
| -86.858246 | 30.5 |
| -86.858246 | 30.5 |
| -86.858246 | 30.5 |
| -86.858147 | 30.5 |
| -86.858147 | 30.5 |
| -86.858116 | 30.5 |
| -86.858116 | 30.5 |
| -86.858009 | 30.5 |
| -86.858009 | 30.5 |
| -86.857933 | 30.5 |
| -86.857933 | 30.5 |
| -86.857887 | 30.5 |
| -86.857887 | 30.5 |
| -86.857841 | 30.5 |
| -86.857841 | 30.5 |
| -86.857796 | 30.5 |
| -86.857796 | 30.5 |
| -86.85775 | 30.499 |
| -86.85775 | 30.499 |
| -86.857719 | 30.499 |
| -86.857719 | 30.499 |
| -86.857719 | 30.499 |
| -86.857689 | 30.499 |
| -86.857689 | 30.499 |
| -86.857658 | 30.499 |
| -86.857658 | 30.499 |
| -86.857613 | 30.499 |
| -86.857613 | 30.499 |
| -86.857582 | 30.499 |
| -86.857582 | 30.499 |
| -86.857536 | 30.499 |
| -86.857529 | 30.499 |
| -86.857529 | 30.499 |
| -86.857506 | 30.499 |
| -86.857506 | 30.499 |
| -86.85746 | 30.499 |
| -86.85746 | 30.499 |
| -86.857399 | 30.499 |
| -86.857399 | 30.499 |
| -86.857338 | 30.499 |
| -86.857338 | 30.499 |
| -86.8573 | 30.499 |
| -86.8573 | 30.499 |
| -86.857239 | 30.499 |
| -86.857239 | 30.499 |
| -86.857185 | 30.499 |
| -86.857185 | 30.499 |
| -86.857132 | 30.499 |
| -86.857101 | 30.499 |
| -86.857101 | 30.499 |
| -86.857048 | 30.499 |
| -86.857048 | 30.499 |
| -86.856987 | 30.499 |
| -86.856987 | 30.499 |
| -86.856941 | 30.499 |
| -86.856941 | 30.499 |
| -86.856895 | 30.499 |
| -86.856895 | 30.499 |
| -86.856834 | 30.499 |
| -86.856827 | 30.499 |
| -86.856766 | 30.499 |
| -86.856766 | 30.499 |
| -86.856766 | 30.499 |
| -86.856667 | 30.499 |
| -86.856667 | 30.499 |
| -86.856583 | 30.499 |
| -86.856583 | 30.499 |
| -86.856506 | 30.499 |
| -86.856506 | 30.499 |
| -86.856392 | 30.499 |
| -86.856392 | 30.499 |
| -86.856339 | 30.499 |
| -86.856339 | 30.499 |
| -86.856224 | 30.499 |
| -86.856224 | 30.499 |
| -86.856133 | 30.499 |
| -86.856133 | 30.499 |
| -86.856056 | 30.499 |
| -86.856056 | 30.499 |
| -86.85601 | 30.499 |
| -86.85601 | 30.499 |
| -86.85601 | 30.499 |
| -86.855965 | 30.499 |
| -86.855965 | 30.499 |
| -86.855965 | 30.499 |
| -86.855835 | 30.499 |
| -86.855835 | 30.499 |
| -86.855812 | 30.499 |
| -86.855812 | 30.499 |
| -86.855705 | 30.499 |
| -86.855705 | 30.499 |
| -86.855629 | 30.499 |
| -86.855629 | 30.499 |
| -86.855553 | 30.499 |
| -86.855461 | 30.499 |
| -86.855461 | 30.499 |
| -86.855385 | 30.499 |
| -86.855385 | 30.499 |
| -86.855362 | 30.499 |
| -86.855293 | 30.499 |
| -86.855293 | 30.499 |
| -86.855217 | 30.499 |
| -86.855217 | 30.499 |
| -86.855217 | 30.499 |
| -86.855103 | 30.499 |
| -86.855103 | 30.499 |
| -86.855049 | 30.499 |
| -86.855049 | 30.499 |
| -86.85495 | 30.499 |
| -86.85495 | 30.499 |
| -86.854858 | 30.499 |
| -86.854858 | 30.499 |
| -86.854759 | 30.499 |
| -86.854759 | 30.499 |
| -86.854683 | 30.499 |
| -86.854683 | 30.499 |
| -86.854622 | 30.499 |
| -86.854622 | 30.499 |
| -86.854538 | 30.499 |
| -86.854538 | 30.499 |
| -86.854431 | 30.499 |
| -86.854431 | 30.499 |
| -86.854355 | 30.499 |
| -86.854355 | 30.499 |
| -86.854256 | 30.499 |
| -86.854179 | 30.499 |
| -86.854179 | 30.499 |
| -86.854103 | 30.499 |
| -86.854103 | 30.499 |
| -86.854012 | 30.499 |
| -86.854012 | 30.499 |
| -86.853935 | 30.499 |
| -86.853935 | 30.499 |
| -86.853905 | 30.499 |
| -86.853905 | 30.499 |
| -86.853828 | 30.499 |
| -86.853828 | 30.499 |
| -86.853722 | 30.499 |
| -86.853722 | 30.499 |
| -86.85363 | 30.499 |
| -86.85363 | 30.499 |
| -86.853569 | 30.499 |
| -86.853546 | 30.499 |
| -86.853477 | 30.499 |
| -86.853477 | 30.499 |
| -86.853363 | 30.499 |
| -86.853363 | 30.499 |
| -86.853363 | 30.499 |
| -86.853264 | 30.499 |
| -86.853264 | 30.499 |
| -86.853195 | 30.499 |
| -86.853195 | 30.499 |
| -86.853081 | 30.5 |
| -86.853081 | 30.5 |
| -86.853027 | 30.5 |
| -86.853027 | 30.5 |
| -86.852913 | 30.5 |
| -86.852913 | 30.5 |
| -86.852821 | 30.5 |
| -86.852821 | 30.5 |
| -86.85273 | 30.5 |
| -86.85273 | 30.5 |
| -86.852638 | 30.5 |
| -86.852638 | 30.5 |
| -86.852547 | 30.5 |
| -86.852547 | 30.5 |
| -86.852455 | 30.5 |
| -86.852432 | 30.5 |
| -86.852432 | 30.5 |
| -86.852341 | 30.5 |
| -86.852341 | 30.5 |
| -86.852272 | 30.5 |
| -86.852272 | 30.5 |
| -86.852135 | 30.5 |
| -86.852135 | 30.5 |
| -86.852043 | 30.5 |
| -86.852043 | 30.5 |
| -86.851967 | 30.5 |
| -86.851982 | 30.5 |
| -86.851891 | 30.5 |
| -86.851891 | 30.5 |
| -86.851891 | 30.5 |
| -86.851814 | 30.5 |
| -86.851814 | 30.5 |
| -86.851738 | 30.5 |
| -86.851738 | 30.5 |
| -86.851662 | 30.5 |
| -86.851662 | 30.5 |
| -86.851662 | 30.5 |
| -86.851578 | 30.5 |
| -86.851509 | 30.5 |
| -86.851509 | 30.5 |
| -86.851509 | 30.5 |
| -86.851372 | 30.5 |
| -86.851372 | 30.5 |
| -86.851318 | 30.5 |
| -86.851318 | 30.5 |
| -86.851234 | 30.5 |
| -86.851234 | 30.5 |
| -86.851181 | 30.5 |
| -86.851181 | 30.5 |
| -86.851105 | 30.5 |
| -86.851105 | 30.5 |
| -86.851021 | 30.5 |
| -86.851021 | 30.5 |
| -86.850937 | 30.5 |
| -86.850937 | 30.5 |
| -86.850937 | 30.5 |
| -86.850937 | 30.5 |
| -86.850815 | 30.5 |
| -86.850815 | 30.5 |
| -86.850746 | 30.5 |
| -86.850746 | 30.5 |
| -86.85067 | 30.5 |
| -86.850578 | 30.5 |
| -86.850578 | 30.5 |
| -86.850517 | 30.501 |
| -86.850517 | 30.501 |
| -86.850456 | 30.501 |
| -86.850456 | 30.501 |
| -86.850426 | 30.501 |
| -86.850349 | 30.501 |
| -86.850349 | 30.501 |
| -86.850273 | 30.501 |
| -86.850266 | 30.501 |
| -86.850197 | 30.501 |
| -86.850121 | 30.501 |
| -86.850121 | 30.501 |
| -86.850044 | 30.501 |
| -86.850044 | 30.501 |
| -86.850044 | 30.501 |
| -86.849968 | 30.501 |
| -86.849968 | 30.501 |
| -86.849968 | 30.501 |
| -86.849884 | 30.501 |
| -86.849884 | 30.501 |
| -86.849808 | 30.501 |
| -86.849808 | 30.501 |
| -86.849724 | 30.501 |
| -86.849724 | 30.501 |
| -86.849655 | 30.501 |
| -86.849655 | 30.501 |
| -86.849564 | 30.501 |
| -86.849564 | 30.501 |
| -86.849487 | 30.501 |
| -86.849487 | 30.501 |
| -86.849365 | 30.501 |
| -86.849365 | 30.501 |
| -86.849297 | 30.501 |
| -86.849297 | 30.501 |
| -86.84922 | 30.501 |
| -86.84922 | 30.501 |
| -86.849106 | 30.501 |
| -86.849106 | 30.501 |
| -86.849014 | 30.501 |
| -86.849014 | 30.501 |
| -86.848938 | 30.501 |
| -86.848938 | 30.501 |
| -86.848846 | 30.501 |
| -86.848846 | 30.501 |
| -86.848846 | 30.501 |
| -86.848763 | 30.501 |
| -86.848763 | 30.501 |
| -86.848709 | 30.501 |
| -86.848709 | 30.501 |
| -86.84861 | 30.501 |
| -86.84861 | 30.501 |
| -86.848564 | 30.501 |
| -86.848564 | 30.501 |
| -86.848473 | 30.501 |
| -86.848473 | 30.501 |
| -86.848427 | 30.501 |
| -86.848427 | 30.501 |
| -86.848366 | 30.501 |
| -86.848366 | 30.501 |
| -86.848244 | 30.501 |
| -86.848244 | 30.501 |
| -86.848167 | 30.501 |
| -86.848167 | 30.501 |
| -86.848167 | 30.501 |
| -86.848091 | 30.501 |
| -86.848091 | 30.501 |
| -86.848015 | 30.501 |
| -86.848015 | 30.501 |
| -86.8479 | 30.501 |
| -86.8479 | 30.501 |
| -86.8479 | 30.501 |
| -86.847824 | 30.501 |
| -86.847824 | 30.501 |
| -86.847725 | 30.501 |
| -86.847725 | 30.501 |
| -86.847633 | 30.502 |
| -86.847633 | 30.502 |
| -86.847557 | 30.502 |
| -86.847557 | 30.502 |
| -86.847496 | 30.502 |
| -86.847496 | 30.502 |
| -86.847404 | 30.502 |
| -86.847404 | 30.502 |
| -86.847404 | 30.502 |
| -86.847328 | 30.502 |
| -86.847328 | 30.502 |
| -86.847229 | 30.502 |
| -86.847229 | 30.502 |
| -86.847153 | 30.502 |
| -86.847153 | 30.502 |
| -86.847038 | 30.502 |
| -86.847038 | 30.502 |
| -86.846962 | 30.502 |
| -86.846962 | 30.502 |
| -86.846886 | 30.502 |
| -86.846886 | 30.502 |
| -86.846886 | 30.502 |
| -86.846809 | 30.502 |
| -86.846809 | 30.502 |
| -86.846733 | 30.502 |
| -86.846733 | 30.502 |
| -86.846657 | 30.502 |
| -86.846657 | 30.502 |
| -86.846657 | 30.502 |
| -86.846535 | 30.502 |
| -86.846535 | 30.502 |
| -86.846481 | 30.502 |
| -86.846481 | 30.502 |
| -86.84639 | 30.502 |
| -86.84639 | 30.502 |
| -86.846313 | 30.502 |
| -86.846313 | 30.502 |
| -86.846237 | 30.502 |
| -86.846237 | 30.502 |
| -86.8461 | 30.502 |
| -86.846069 | 30.502 |
| -86.846069 | 30.502 |
| -86.84597 | 30.502 |
| -86.84597 | 30.502 |
| -86.845917 | 30.502 |
| -86.845917 | 30.502 |
| -86.845825 | 30.502 |
| -86.845825 | 30.502 |
| -86.845802 | 30.502 |
| -86.845726 | 30.502 |
| -86.845726 | 30.502 |
| -86.845634 | 30.502 |
| -86.845634 | 30.502 |
| -86.845634 | 30.502 |
| -86.845558 | 30.502 |
| -86.845558 | 30.502 |
| -86.845467 | 30.502 |
| -86.845467 | 30.502 |
| -86.845367 | 30.502 |
| -86.845367 | 30.502 |
| -86.845276 | 30.502 |
| -86.845276 | 30.502 |
| -86.845276 | 30.502 |
| -86.845177 | 30.502 |
| -86.845108 | 30.502 |
| -86.845108 | 30.502 |
| -86.845032 | 30.502 |
| -86.845032 | 30.502 |
| -86.84494 | 30.503 |
| -86.84494 | 30.503 |
| -86.844864 | 30.503 |
| -86.844864 | 30.503 |
| -86.844749 | 30.503 |
| -86.844749 | 30.503 |
| -86.844658 | 30.503 |
| -86.844658 | 30.503 |
| -86.844658 | 30.503 |
| -86.844582 | 30.503 |
| -86.844582 | 30.503 |
| -86.84449 | 30.503 |
| -86.84449 | 30.503 |
| -86.844414 | 30.503 |
| -86.844368 | 30.503 |
| -86.844322 | 30.503 |
| -86.844231 | 30.503 |
| -86.844231 | 30.503 |
| -86.844231 | 30.503 |
| -86.844139 | 30.503 |
| -86.844116 | 30.503 |
| -86.844048 | 30.503 |
| -86.844048 | 30.503 |
| -86.844048 | 30.503 |
| -86.843933 | 30.503 |
| -86.843933 | 30.503 |
| -86.843857 | 30.503 |
| -86.843857 | 30.503 |
| -86.843765 | 30.503 |
| -86.843765 | 30.503 |
| -86.843674 | 30.503 |
| -86.843674 | 30.503 |
| -86.843559 | 30.503 |
| -86.843559 | 30.503 |
| -86.843468 | 30.503 |
| -86.843468 | 30.503 |
| -86.843353 | 30.503 |
| -86.843353 | 30.503 |
| -86.843285 | 30.503 |
| -86.843285 | 30.503 |
| -86.84317 | 30.503 |
| -86.84317 | 30.503 |
| -86.843086 | 30.503 |
| -86.843086 | 30.503 |
| -86.842995 | 30.503 |
| -86.842995 | 30.503 |
| -86.842903 | 30.503 |
| -86.842903 | 30.503 |
| -86.842789 | 30.503 |
| -86.842781 | 30.503 |
| -86.842712 | 30.503 |
| -86.842712 | 30.503 |
| -86.842621 | 30.503 |
| -86.842621 | 30.503 |
| -86.842529 | 30.503 |
| -86.842529 | 30.503 |
| -86.842438 | 30.503 |
| -86.842438 | 30.503 |
| -86.842361 | 30.504 |
| -86.842361 | 30.504 |
| -86.84227 | 30.504 |
| -86.84227 | 30.504 |
| -86.842209 | 30.504 |
| -86.842209 | 30.504 |
| -86.842163 | 30.504 |
| -86.842163 | 30.504 |
| -86.842087 | 30.504 |
| -86.842087 | 30.504 |
| -86.84201 | 30.504 |
| -86.84201 | 30.504 |
| -86.841934 | 30.504 |
| -86.841934 | 30.504 |
| -86.841873 | 30.504 |
| -86.841873 | 30.504 |
| -86.841873 | 30.504 |
| -86.841728 | 30.504 |
| -86.841728 | 30.504 |
| -86.841637 | 30.504 |
| -86.841637 | 30.504 |
| -86.841576 | 30.504 |
| -86.841576 | 30.504 |
| -86.841484 | 30.504 |
| -86.841393 | 30.504 |
| -86.841393 | 30.504 |
| -86.841301 | 30.504 |
| -86.841301 | 30.504 |
| -86.841301 | 30.504 |
| -86.841209 | 30.504 |
| -86.841118 | 30.504 |
| -86.841118 | 30.504 |
| -86.841042 | 30.504 |
| -86.841042 | 30.504 |
| -86.841042 | 30.504 |
| -86.84095 | 30.504 |
| -86.84095 | 30.504 |
| -86.840851 | 30.504 |
| -86.840851 | 30.504 |
| -86.840797 | 30.504 |
| -86.840797 | 30.504 |
| -86.840698 | 30.504 |
| -86.840698 | 30.504 |
| -86.840622 | 30.504 |
| -86.840622 | 30.504 |
| -86.840622 | 30.504 |
| -86.840546 | 30.504 |
| -86.840546 | 30.504 |
| -86.840546 | 30.504 |
| -86.840446 | 30.504 |
| -86.840446 | 30.504 |
| -86.840385 | 30.504 |
| -86.840385 | 30.504 |
| -86.840294 | 30.504 |
| -86.840294 | 30.504 |
| -86.840179 | 30.504 |
| -86.840179 | 30.504 |
| -86.840134 | 30.504 |
| -86.840134 | 30.504 |
| -86.840034 | 30.504 |
| -86.840034 | 30.504 |
| -86.840019 | 30.504 |
| -86.840019 | 30.504 |
| -86.839943 | 30.504 |
| -86.839943 | 30.504 |
| -86.839867 | 30.504 |
| -86.839867 | 30.504 |
| -86.839783 | 30.505 |
| -86.839783 | 30.505 |
| -86.839729 | 30.505 |
| -86.839729 | 30.505 |
| -86.839653 | 30.505 |
| -86.839653 | 30.505 |
| -86.839584 | 30.505 |
| -86.839584 | 30.505 |
| -86.839516 | 30.505 |
| -86.839516 | 30.505 |
| -86.839432 | 30.505 |
| -86.839432 | 30.505 |
| -86.839378 | 30.505 |
| -86.839378 | 30.505 |
| -86.839378 | 30.505 |
| -86.839294 | 30.505 |
| -86.839294 | 30.505 |
| -86.839218 | 30.505 |
| -86.839218 | 30.505 |
| -86.839142 | 30.505 |
| -86.839142 | 30.505 |
| -86.839081 | 30.505 |
| -86.839081 | 30.505 |
| -86.838989 | 30.505 |
| -86.838989 | 30.505 |
| -86.838943 | 30.505 |
| -86.838943 | 30.505 |
| -86.838867 | 30.505 |
| -86.838867 | 30.505 |
| -86.838776 | 30.505 |
| -86.838776 | 30.505 |
| -86.838707 | 30.505 |
| -86.838623 | 30.505 |
| -86.838623 | 30.505 |
| -86.83857 | 30.505 |
| -86.83857 | 30.505 |
| -86.838493 | 30.505 |
| -86.838493 | 30.505 |
| -86.838417 | 30.505 |
| -86.838417 | 30.505 |
| -86.838326 | 30.505 |
| -86.838326 | 30.505 |
| -86.838272 | 30.505 |
| -86.838272 | 30.505 |
| -86.838181 | 30.505 |
| -86.838181 | 30.505 |
| -86.838074 | 30.505 |
| -86.837997 | 30.505 |
| -86.83799 | 30.505 |
| -86.837936 | 30.505 |
| -86.837936 | 30.505 |
| -86.837822 | 30.505 |
| -86.837822 | 30.505 |
| -86.83773 | 30.505 |
| -86.83773 | 30.505 |
| -86.837654 | 30.505 |
| -86.837654 | 30.505 |
| -86.837593 | 30.505 |
| -86.837593 | 30.505 |
| -86.837593 | 30.505 |
| -86.837517 | 30.505 |
| -86.837494 | 30.505 |
| -86.837425 | 30.505 |
| -86.837425 | 30.505 |
| -86.837349 | 30.505 |
| -86.837349 | 30.505 |
| -86.837349 | 30.505 |
| -86.837257 | 30.505 |
| -86.837257 | 30.505 |
| -86.837143 | 30.505 |
| -86.837143 | 30.505 |
| -86.837067 | 30.505 |
| -86.836975 | 30.505 |
| -86.836975 | 30.505 |
| -86.836899 | 30.505 |
| -86.836899 | 30.505 |
| -86.836899 | 30.505 |
| -86.836899 | 30.505 |
| -86.836792 | 30.505 |
| -86.836792 | 30.505 |
| -86.836723 | 30.505 |
| -86.836723 | 30.505 |
| -86.836632 | 30.506 |
| -86.836632 | 30.506 |
| -86.836555 | 30.506 |
| -86.836555 | 30.506 |
| -86.836456 | 30.506 |
| -86.836456 | 30.506 |
| -86.836365 | 30.506 |
| -86.836365 | 30.506 |
| -86.836288 | 30.506 |
| -86.836288 | 30.506 |
| -86.836197 | 30.506 |
| -86.836197 | 30.506 |
| -86.836197 | 30.506 |
| -86.836098 | 30.506 |
| -86.836098 | 30.506 |
| -86.836006 | 30.506 |
| -86.836006 | 30.506 |
| -86.83593 | 30.506 |
| -86.835907 | 30.506 |
| -86.835854 | 30.506 |
| -86.835854 | 30.506 |
| -86.835854 | 30.506 |
| -86.835762 | 30.506 |
| -86.835762 | 30.506 |
| -86.835663 | 30.506 |
| -86.835663 | 30.506 |
| -86.835571 | 30.506 |
| -86.835571 | 30.506 |
| -86.835487 | 30.506 |
| -86.835487 | 30.506 |
| -86.835426 | 30.506 |
| -86.835426 | 30.506 |
| -86.835365 | 30.506 |
| -86.835365 | 30.506 |
| -86.835289 | 30.506 |
| -86.835289 | 30.506 |
| -86.835228 | 30.506 |
| -86.835228 | 30.506 |
| -86.835159 | 30.506 |
| -86.835159 | 30.506 |
| -86.835136 | 30.506 |
| -86.835136 | 30.506 |
| -86.835106 | 30.507 |
| -86.835106 | 30.507 |
| -86.835075 | 30.507 |
| -86.835075 | 30.507 |
| -86.835075 | 30.507 |
| -86.83506 | 30.507 |
| -86.83506 | 30.507 |
| -86.83506 | 30.507 |
| -86.83506 | 30.507 |
| -86.83506 | 30.507 |
| -86.83506 | 30.507 |
| -86.83506 | 30.507 |
| -86.835075 | 30.507 |
| -86.835075 | 30.507 |
| -86.835091 | 30.507 |
| -86.835091 | 30.507 |
| -86.835129 | 30.507 |
| -86.835152 | 30.507 |
| -86.835197 | 30.507 |
| -86.835197 | 30.507 |
| -86.835258 | 30.507 |
| -86.835258 | 30.507 |
| -86.83532 | 30.507 |
| -86.83532 | 30.507 |
| -86.83532 | 30.507 |
| -86.835381 | 30.507 |
| -86.835457 | 30.507 |
| -86.835457 | 30.507 |
| -86.835457 | 30.507 |
| -86.835457 | 30.507 |
| -86.835541 | 30.508 |
| -86.835541 | 30.508 |
| -86.835632 | 30.508 |
| -86.835632 | 30.508 |
| -86.835724 | 30.508 |
| -86.835724 | 30.508 |
| -86.835823 | 30.508 |
| -86.835823 | 30.508 |
| -86.835899 | 30.508 |
| -86.835899 | 30.508 |
| -86.836014 | 30.508 |
| -86.836014 | 30.508 |
| -86.836037 | 30.508 |
| -86.836037 | 30.508 |
| -86.836121 | 30.508 |
| -86.836121 | 30.508 |
| -86.836197 | 30.508 |
| -86.836197 | 30.508 |
| -86.83625 | 30.508 |
| -86.83625 | 30.508 |
| -86.836311 | 30.507 |
| -86.836311 | 30.507 |
| -86.836327 | 30.507 |
| -86.836327 | 30.507 |
| -86.836372 | 30.507 |
| -86.836372 | 30.507 |
| -86.836403 | 30.507 |
| -86.836403 | 30.507 |
| -86.836433 | 30.507 |
| -86.836433 | 30.507 |
| -86.836464 | 30.507 |
| -86.836464 | 30.507 |
| -86.836494 | 30.507 |
| -86.83651 | 30.507 |
| -86.83651 | 30.507 |
| -86.83651 | 30.507 |
| -86.83651 | 30.507 |
| -86.836548 | 30.507 |
| -86.836548 | 30.507 |
| -86.836601 | 30.507 |
| -86.836601 | 30.507 |
| -86.836632 | 30.507 |
| -86.836632 | 30.507 |
| -86.836662 | 30.507 |
| -86.836662 | 30.507 |
| -86.836693 | 30.507 |
| -86.836693 | 30.507 |
| -86.836693 | 30.507 |
| -86.836739 | 30.507 |
| -86.836739 | 30.507 |
| -86.836769 | 30.507 |
| -86.836769 | 30.507 |
| -86.836815 | 30.507 |
| -86.836815 | 30.507 |
| -86.836815 | 30.507 |
| -86.836853 | 30.507 |
| -86.836853 | 30.507 |
| -86.836899 | 30.507 |
| -86.836899 | 30.507 |
| -86.836952 | 30.507 |
| -86.836952 | 30.507 |
| -86.836998 | 30.507 |
| -86.836998 | 30.507 |
| -86.837036 | 30.507 |
| -86.837036 | 30.507 |
| -86.837082 | 30.507 |
| -86.837082 | 30.507 |
| -86.837143 | 30.507 |
| -86.837143 | 30.507 |
| -86.837181 | 30.506 |
| -86.837181 | 30.506 |
| -86.837242 | 30.506 |
| -86.837242 | 30.506 |
| -86.837288 | 30.506 |
| -86.837288 | 30.506 |
| -86.837341 | 30.506 |
| -86.837341 | 30.506 |
| -86.837402 | 30.506 |
| -86.837402 | 30.506 |
| -86.837448 | 30.506 |
| -86.837448 | 30.506 |
| -86.837517 | 30.506 |
| -86.837517 | 30.506 |
| -86.837563 | 30.506 |
| -86.837563 | 30.506 |
| -86.837624 | 30.506 |
| -86.837624 | 30.506 |
| -86.837715 | 30.506 |
| -86.837715 | 30.506 |
| -86.837776 | 30.506 |
| -86.837776 | 30.506 |
| -86.837837 | 30.506 |
| -86.837837 | 30.506 |
| -86.837914 | 30.506 |
| -86.837914 | 30.506 |
| -86.837914 | 30.506 |
| -86.83799 | 30.506 |
| -86.83799 | 30.506 |
| -86.83799 | 30.506 |
| -86.838066 | 30.506 |
| -86.838066 | 30.506 |
| -86.838188 | 30.506 |
| -86.838188 | 30.506 |
| -86.83828 | 30.506 |
| -86.83828 | 30.506 |
| -86.838356 | 30.506 |
| -86.838356 | 30.506 |
| -86.838448 | 30.506 |
| -86.838448 | 30.506 |
| -86.838547 | 30.506 |
| -86.838547 | 30.506 |
| -86.8386 | 30.506 |
| -86.838692 | 30.506 |
| -86.838692 | 30.506 |
| -86.838692 | 30.506 |
| -86.838806 | 30.506 |
| -86.838806 | 30.506 |
| -86.838806 | 30.506 |
| -86.838898 | 30.506 |
| -86.838974 | 30.506 |
| -86.838974 | 30.506 |
| -86.839088 | 30.506 |
| -86.839088 | 30.506 |
| -86.839165 | 30.506 |
| -86.839165 | 30.506 |
| -86.839165 | 30.506 |
| -86.839241 | 30.506 |
| -86.839241 | 30.506 |
| -86.839355 | 30.506 |
| -86.839355 | 30.506 |
| -86.839447 | 30.506 |
| -86.839447 | 30.506 |
| -86.839539 | 30.506 |
| -86.839539 | 30.506 |
| -86.839615 | 30.506 |
| -86.839615 | 30.506 |
| -86.839706 | 30.506 |
| -86.839706 | 30.506 |
| -86.839706 | 30.506 |
| -86.839836 | 30.506 |
| -86.839836 | 30.506 |
| -86.839912 | 30.506 |
| -86.839912 | 30.506 |
| -86.840004 | 30.506 |
| -86.840004 | 30.506 |
| -86.840096 | 30.506 |
| -86.840096 | 30.506 |
| -86.84021 | 30.506 |
| -86.84021 | 30.506 |
| -86.840286 | 30.506 |
| -86.840286 | 30.506 |
| -86.840309 | 30.506 |
| -86.840378 | 30.506 |
| -86.840378 | 30.506 |
| -86.840454 | 30.506 |
| -86.840454 | 30.506 |
| -86.840546 | 30.506 |
| -86.840546 | 30.506 |
| -86.840637 | 30.506 |
| -86.840637 | 30.506 |
| -86.840714 | 30.506 |
| -86.840805 | 30.506 |
| -86.840805 | 30.506 |
| -86.840897 | 30.506 |
| -86.840897 | 30.506 |
| -86.840973 | 30.506 |
| -86.840973 | 30.506 |
| -86.841087 | 30.506 |
| -86.841087 | 30.506 |
| -86.841171 | 30.506 |
| -86.841171 | 30.506 |
| -86.84127 | 30.506 |
| -86.84127 | 30.506 |
| -86.841377 | 30.506 |
| -86.841377 | 30.506 |
| -86.841377 | 30.506 |
| -86.841469 | 30.506 |
| -86.841469 | 30.506 |
| -86.841469 | 30.506 |
| -86.84156 | 30.506 |
| -86.84156 | 30.506 |
| -86.841652 | 30.506 |
| -86.841652 | 30.506 |
| -86.841743 | 30.506 |
| -86.841743 | 30.506 |
| -86.841835 | 30.506 |
| -86.841835 | 30.506 |
| -86.841927 | 30.506 |
| -86.841927 | 30.506 |
| -86.841927 | 30.506 |
| -86.842018 | 30.506 |
| -86.842018 | 30.506 |
| -86.842125 | 30.506 |
| -86.842125 | 30.506 |
| -86.842125 | 30.506 |
| -86.842262 | 30.506 |
| -86.842262 | 30.506 |
| -86.842316 | 30.506 |
| -86.842316 | 30.506 |
| -86.842407 | 30.506 |
| -86.842407 | 30.506 |
| -86.842499 | 30.506 |
| -86.842499 | 30.506 |
| -86.842613 | 30.506 |
| -86.842613 | 30.506 |
| -86.842613 | 30.506 |
| -86.842712 | 30.506 |
| -86.842712 | 30.506 |
| -86.842781 | 30.506 |
| -86.842781 | 30.506 |
| -86.842911 | 30.506 |
| -86.842911 | 30.506 |
| -86.84301 | 30.506 |
| -86.84301 | 30.506 |
| -86.843079 | 30.506 |
| -86.843079 | 30.506 |
| -86.84317 | 30.506 |
| -86.84317 | 30.506 |
| -86.843262 | 30.506 |
| -86.843262 | 30.506 |
| -86.843323 | 30.506 |
| -86.843323 | 30.506 |
| -86.843399 | 30.506 |
| -86.843422 | 30.506 |
| -86.843483 | 30.506 |
| -86.843483 | 30.506 |
| -86.843529 | 30.506 |
| -86.843529 | 30.506 |
| -86.843575 | 30.506 |
| -86.843651 | 30.506 |
| -86.843651 | 30.506 |
| -86.843712 | 30.506 |
| -86.843712 | 30.506 |
| -86.843803 | 30.506 |
| -86.843811 | 30.506 |
| -86.843864 | 30.506 |
| -86.843864 | 30.506 |
| -86.843948 | 30.506 |
| -86.843956 | 30.506 |
| -86.843956 | 30.506 |
| -86.844009 | 30.506 |
| -86.844009 | 30.506 |
| -86.844086 | 30.506 |
| -86.844086 | 30.506 |
| -86.84417 | 30.506 |
| -86.84417 | 30.506 |
| -86.844246 | 30.506 |
| -86.844246 | 30.506 |
| -86.844307 | 30.506 |
| -86.844307 | 30.506 |
| -86.844383 | 30.506 |
| -86.844383 | 30.506 |
| -86.844467 | 30.506 |
| -86.844467 | 30.506 |
| -86.844536 | 30.506 |
| -86.844536 | 30.506 |
| -86.844597 | 30.506 |
| -86.844597 | 30.506 |
| -86.844673 | 30.506 |
| -86.844673 | 30.506 |
| -86.844673 | 30.506 |
| -86.844757 | 30.506 |
| -86.84478 | 30.506 |
| -86.84478 | 30.506 |
| -86.844849 | 30.506 |
| -86.844849 | 30.506 |
| -86.844894 | 30.506 |
| -86.844894 | 30.506 |
| -86.844971 | 30.506 |
| -86.844971 | 30.506 |
| -86.845062 | 30.506 |
| -86.845062 | 30.506 |
| -86.845154 | 30.506 |
| -86.845154 | 30.506 |
| -86.845245 | 30.506 |
| -86.845245 | 30.506 |
| -86.845345 | 30.506 |
| -86.845345 | 30.506 |
| -86.845436 | 30.506 |
| -86.845436 | 30.506 |
| -86.845512 | 30.506 |
| -86.845512 | 30.506 |
| -86.845589 | 30.506 |
| -86.845589 | 30.506 |
| -86.845589 | 30.506 |
| -86.84565 | 30.506 |
| -86.84565 | 30.506 |
| -86.845726 | 30.506 |
| -86.845726 | 30.506 |
| -86.845818 | 30.506 |
| -86.84584 | 30.506 |
| -86.845894 | 30.506 |
| -86.845894 | 30.506 |
| -86.84597 | 30.506 |
| -86.845978 | 30.506 |
| -86.845978 | 30.506 |
| -86.846046 | 30.506 |
| -86.846046 | 30.506 |
| -86.846146 | 30.506 |
| -86.846146 | 30.506 |
| -86.846207 | 30.506 |
| -86.846207 | 30.506 |
| -86.846306 | 30.506 |
| -86.846306 | 30.506 |
| -86.846306 | 30.506 |
| -86.846405 | 30.506 |
| -86.846474 | 30.506 |
| -86.846474 | 30.506 |
| -86.84655 | 30.506 |
| -86.846573 | 30.506 |
| -86.846573 | 30.506 |
| -86.846626 | 30.506 |
| -86.846626 | 30.506 |
| -86.846703 | 30.506 |
| -86.846703 | 30.506 |
| -86.846779 | 30.506 |
| -86.846779 | 30.506 |
| -86.846901 | 30.506 |
| -86.846901 | 30.506 |
| -86.846954 | 30.506 |
| -86.846954 | 30.506 |
| -86.847054 | 30.506 |
| -86.847054 | 30.506 |
| -86.847122 | 30.506 |
| -86.847122 | 30.506 |
| -86.847206 | 30.506 |
| -86.847206 | 30.506 |
| -86.847267 | 30.506 |
| -86.847267 | 30.506 |
| -86.847313 | 30.506 |
| -86.847313 | 30.506 |
| -86.847313 | 30.506 |
| -86.847435 | 30.506 |
| -86.847443 | 30.506 |
| -86.847443 | 30.506 |
| -86.847511 | 30.506 |
| -86.847588 | 30.506 |
| -86.847588 | 30.506 |
| -86.847664 | 30.506 |
| -86.847664 | 30.506 |
| -86.847755 | 30.506 |
| -86.847755 | 30.506 |
| -86.847755 | 30.506 |
| -86.847878 | 30.506 |
| -86.847878 | 30.506 |
| -86.847946 | 30.506 |
| -86.847946 | 30.506 |
| -86.848038 | 30.506 |
| -86.848038 | 30.506 |
| -86.848114 | 30.506 |
| -86.848114 | 30.506 |
| -86.848206 | 30.506 |
| -86.848206 | 30.506 |
| -86.848297 | 30.506 |
| -86.848297 | 30.506 |
| -86.848412 | 30.506 |
| -86.848412 | 30.506 |
| -86.848488 | 30.506 |
| -86.848488 | 30.506 |
| -86.848579 | 30.506 |
| -86.848579 | 30.506 |
| -86.848656 | 30.506 |
| -86.848656 | 30.506 |
| -86.84877 | 30.506 |
| -86.84877 | 30.506 |
| -86.848862 | 30.506 |
| -86.848862 | 30.506 |
| -86.848862 | 30.506 |
| -86.848938 | 30.506 |
| -86.849022 | 30.506 |
| -86.849022 | 30.506 |
| -86.849113 | 30.506 |
| -86.849113 | 30.506 |
| -86.849205 | 30.506 |
| -86.849205 | 30.506 |
| -86.849297 | 30.506 |
| -86.849297 | 30.506 |
| -86.849373 | 30.506 |
| -86.849358 | 30.506 |
| -86.849449 | 30.506 |
| -86.849541 | 30.506 |
| -86.849541 | 30.506 |
| -86.849541 | 30.506 |
| -86.849617 | 30.506 |
| -86.849693 | 30.506 |
| -86.849693 | 30.506 |
| -86.849693 | 30.506 |
| -86.849693 | 30.506 |
| -86.849808 | 30.506 |
| -86.849808 | 30.506 |
| -86.849884 | 30.506 |
| -86.849884 | 30.506 |
| -86.849976 | 30.506 |
| -86.849976 | 30.506 |
| -86.850052 | 30.506 |
| -86.850052 | 30.506 |
| -86.850166 | 30.506 |
| -86.850166 | 30.506 |
| -86.850243 | 30.506 |
| -86.850243 | 30.506 |
| -86.850334 | 30.506 |
| -86.850334 | 30.506 |
| -86.850334 | 30.506 |
| -86.85041 | 30.506 |
| -86.850433 | 30.506 |
| -86.850502 | 30.506 |
| -86.850502 | 30.506 |
| -86.850502 | 30.506 |
| -86.850594 | 30.506 |
| -86.850594 | 30.506 |
| -86.85067 | 30.506 |
| -86.85067 | 30.506 |
| -86.850761 | 30.506 |
| -86.850761 | 30.506 |
| -86.850899 | 30.506 |
| -86.850899 | 30.506 |
| -86.850967 | 30.506 |
| -86.850967 | 30.506 |
| -86.851059 | 30.506 |
| -86.851059 | 30.506 |
| -86.851158 | 30.506 |
| -86.851158 | 30.506 |
| -86.851227 | 30.506 |
| -86.851227 | 30.506 |
| -86.851326 | 30.506 |
| -86.851326 | 30.506 |
| -86.851326 | 30.506 |
| -86.851418 | 30.506 |
| -86.851418 | 30.506 |
| -86.851494 | 30.506 |
| -86.851494 | 30.506 |
| -86.851494 | 30.506 |
| -86.851585 | 30.506 |
| -86.851585 | 30.506 |
| -86.851685 | 30.506 |
| -86.851685 | 30.506 |
| -86.851738 | 30.506 |
| -86.851738 | 30.506 |
| -86.85183 | 30.506 |
| -86.85183 | 30.506 |
| -86.85183 | 30.506 |
| -86.85183 | 30.506 |
| -86.851967 | 30.506 |
| -86.851967 | 30.506 |
| -86.852036 | 30.506 |
| -86.852036 | 30.506 |
| -86.852173 | 30.506 |
| -86.852173 | 30.506 |
| -86.852242 | 30.506 |
| -86.852242 | 30.506 |
| -86.852356 | 30.506 |
| -86.852356 | 30.506 |
| -86.852425 | 30.506 |
| -86.852425 | 30.506 |
| -86.852539 | 30.506 |
| -86.852539 | 30.506 |
| -86.852539 | 30.506 |
| -86.852631 | 30.506 |
| -86.852631 | 30.506 |
| -86.852722 | 30.506 |
| -86.852722 | 30.506 |
| -86.852722 | 30.506 |
| -86.852806 | 30.506 |
| -86.852806 | 30.506 |
| -86.852829 | 30.506 |
| -86.852829 | 30.506 |
| -86.852921 | 30.506 |
| -86.852921 | 30.506 |
| -86.853035 | 30.506 |
| -86.853035 | 30.506 |
| -86.853035 | 30.506 |
| -86.853035 | 30.506 |
| -86.853188 | 30.506 |
| -86.853188 | 30.506 |
| -86.853188 | 30.506 |
| -86.853264 | 30.506 |
| -86.853355 | 30.506 |
| -86.853355 | 30.506 |
| -86.853355 | 30.506 |
| -86.853355 | 30.506 |
| -86.853447 | 30.506 |
| -86.853447 | 30.506 |
| -86.853523 | 30.506 |
| -86.853523 | 30.506 |
| -86.853661 | 30.506 |
| -86.853661 | 30.506 |
| -86.853745 | 30.506 |
| -86.853745 | 30.506 |
| -86.853836 | 30.506 |
| -86.853836 | 30.506 |
| -86.853951 | 30.506 |
| -86.853951 | 30.506 |
| -86.854034 | 30.506 |
| -86.854034 | 30.506 |
| -86.854126 | 30.506 |
| -86.854126 | 30.506 |
| -86.854218 | 30.506 |
| -86.854218 | 30.506 |
| -86.854309 | 30.506 |
| -86.854309 | 30.506 |
| -86.854424 | 30.506 |
| -86.854424 | 30.506 |
| -86.854424 | 30.506 |
| -86.854515 | 30.506 |
| -86.854538 | 30.506 |
| -86.854538 | 30.506 |
| -86.854591 | 30.506 |
| -86.854591 | 30.506 |
| -86.854706 | 30.506 |
| -86.854706 | 30.506 |
| -86.854729 | 30.506 |
| -86.854729 | 30.506 |
| -86.854828 | 30.506 |
| -86.854828 | 30.506 |
| -86.854897 | 30.506 |
| -86.854897 | 30.506 |
| -86.854965 | 30.506 |
| -86.854965 | 30.506 |
| -86.855026 | 30.506 |
| -86.855026 | 30.506 |
| -86.855133 | 30.506 |
| -86.855225 | 30.506 |
| -86.855232 | 30.506 |
| -86.855324 | 30.506 |
| -86.855324 | 30.506 |
| -86.855408 | 30.506 |
| -86.855408 | 30.506 |
| -86.855492 | 30.506 |
| -86.855492 | 30.506 |
| -86.855568 | 30.506 |
| -86.855568 | 30.506 |
| -86.855591 | 30.506 |
| -86.855659 | 30.506 |
| -86.855659 | 30.506 |
| -86.855751 | 30.506 |
| -86.855751 | 30.506 |
| -86.855843 | 30.506 |
| -86.855843 | 30.506 |
| -86.855934 | 30.506 |
| -86.855934 | 30.506 |
| -86.856049 | 30.506 |
| -86.856049 | 30.506 |
| -86.856117 | 30.506 |
| -86.856117 | 30.506 |
| -86.856209 | 30.506 |
| -86.856209 | 30.506 |
| -86.8563 | 30.506 |
| -86.8563 | 30.506 |
| -86.856392 | 30.506 |
| -86.856392 | 30.506 |
| -86.856506 | 30.506 |
| -86.856506 | 30.506 |
| -86.856506 | 30.506 |
| -86.856506 | 30.506 |
| -86.856621 | 30.506 |
| -86.856621 | 30.506 |
| -86.856689 | 30.506 |
| -86.856689 | 30.506 |
| -86.856766 | 30.506 |
| -86.856766 | 30.506 |
| -86.856857 | 30.506 |
| -86.856857 | 30.506 |
| -86.856995 | 30.506 |
| -86.856995 | 30.506 |
| -86.857063 | 30.506 |
| -86.857063 | 30.506 |
| -86.857155 | 30.506 |
| -86.857155 | 30.506 |
| -86.857246 | 30.506 |
| -86.857246 | 30.506 |
| -86.857338 | 30.506 |
| -86.857338 | 30.506 |
| -86.85743 | 30.506 |
| -86.85743 | 30.506 |
| -86.857506 | 30.506 |
| -86.857506 | 30.506 |
| -86.857643 | 30.506 |
| -86.857643 | 30.506 |
| -86.857712 | 30.506 |
| -86.857712 | 30.506 |
| -86.857788 | 30.506 |
| -86.857788 | 30.506 |
| -86.857903 | 30.506 |
| -86.857903 | 30.506 |
| -86.857994 | 30.506 |
| -86.857994 | 30.506 |
| -86.857994 | 30.506 |
| -86.85807 | 30.506 |
| -86.85807 | 30.506 |
| -86.858147 | 30.506 |
| -86.858147 | 30.506 |
| -86.858223 | 30.506 |
| -86.858223 | 30.506 |
| -86.858253 | 30.506 |
| -86.858253 | 30.506 |
| -86.85836 | 30.506 |
| -86.85836 | 30.506 |
| -86.858421 | 30.506 |
| -86.858421 | 30.506 |
| -86.858421 | 30.506 |
| -86.858498 | 30.506 |
| -86.858498 | 30.506 |
| -86.858498 | 30.506 |
| -86.858551 | 30.506 |
| -86.858551 | 30.506 |
| -86.858574 | 30.506 |
| -86.858574 | 30.506 |
| -86.85862 | 30.506 |
| -86.85862 | 30.506 |
| -86.858635 | 30.506 |
| -86.858635 | 30.506 |
| -86.858635 | 30.506 |
| -86.85865 | 30.506 |
| -86.85865 | 30.506 |
| -86.85865 | 30.505 |
| -86.85865 | 30.505 |
| -86.858635 | 30.505 |
| -86.858635 | 30.505 |
| -86.85862 | 30.505 |
| -86.85862 | 30.505 |
| -86.858589 | 30.505 |
| -86.858589 | 30.505 |
| -86.858574 | 30.505 |
| -86.858574 | 30.505 |
| -86.858543 | 30.505 |
| -86.858543 | 30.505 |
| -86.858513 | 30.505 |
| -86.858513 | 30.505 |
| -86.858498 | 30.505 |
| -86.858498 | 30.505 |
| -86.858467 | 30.505 |
| -86.858467 | 30.505 |
| -86.858406 | 30.505 |
| -86.858406 | 30.505 |
| -86.858376 | 30.505 |
| -86.858376 | 30.505 |
| -86.858376 | 30.505 |
| -86.85836 | 30.505 |
| -86.85836 | 30.505 |
| -86.858345 | 30.505 |
| -86.858345 | 30.505 |
| -86.85833 | 30.505 |
| -86.85833 | 30.505 |
| -86.85833 | 30.505 |
| -86.85833 | 30.505 |
| -86.85833 | 30.505 |
| -86.85833 | 30.504 |
| -86.85833 | 30.504 |
| -86.858315 | 30.504 |
| -86.858315 | 30.504 |
| -86.85833 | 30.504 |
| -86.85833 | 30.504 |
| -86.85833 | 30.504 |
| -86.85833 | 30.504 |
| -86.85833 | 30.504 |
| -86.85833 | 30.504 |
| -86.85833 | 30.504 |
| -86.85833 | 30.504 |
| -86.85833 | 30.504 |
| -86.85833 | 30.504 |
| -86.858345 | 30.504 |
| -86.858345 | 30.504 |
| -86.858345 | 30.504 |
| -86.858345 | 30.504 |
| -86.85836 | 30.504 |
| -86.85836 | 30.504 |
| -86.85836 | 30.504 |
| -86.858376 | 30.504 |
| -86.858376 | 30.504 |
| -86.858376 | 30.504 |
| -86.858376 | 30.504 |
| -86.858391 | 30.504 |
| -86.858391 | 30.504 |
| -86.858391 | 30.504 |
| -86.858391 | 30.504 |
| -86.858391 | 30.504 |
| -86.858406 | 30.504 |
| -86.858406 | 30.504 |
| -86.858406 | 30.504 |
| -86.858406 | 30.504 |
| -86.858406 | 30.504 |
| -86.858406 | 30.504 |
| -86.858406 | 30.504 |
| -86.858391 | 30.504 |
| -86.858391 | 30.504 |
| -86.858376 | 30.504 |
| -86.858376 | 30.504 |
| -86.858345 | 30.504 |
| -86.858345 | 30.504 |
| -86.858299 | 30.504 |
| -86.858299 | 30.504 |
| -86.858253 | 30.503 |
| -86.858253 | 30.503 |
| -86.858208 | 30.503 |
| -86.858208 | 30.503 |
| -86.858154 | 30.503 |
| -86.858154 | 30.503 |
| -86.858093 | 30.503 |
| -86.858093 | 30.503 |
| -86.858017 | 30.503 |
| -86.857979 | 30.503 |
| -86.857903 | 30.503 |
| -86.857903 | 30.503 |
| -86.857811 | 30.503 |
| -86.857811 | 30.503 |
| -86.857719 | 30.503 |
| -86.857719 | 30.503 |
| -86.857643 | 30.503 |
| -86.857643 | 30.503 |
| -86.857536 | 30.503 |
| -86.857536 | 30.503 |
| -86.857513 | 30.503 |
| -86.85746 | 30.503 |
| -86.85746 | 30.503 |
| -86.857368 | 30.503 |
| -86.857368 | 30.503 |
| -86.857292 | 30.503 |
| -86.857292 | 30.503 |
| -86.857216 | 30.503 |
| -86.85714 | 30.503 |
| -86.85714 | 30.503 |
| -86.85714 | 30.503 |
| -86.85714 | 30.503 |
| -86.857033 | 30.503 |
| -86.857033 | 30.503 |
| -86.856979 | 30.503 |
| -86.856979 | 30.503 |
| -86.85688 | 30.503 |
| -86.85688 | 30.503 |
| -86.856819 | 30.503 |
| -86.856819 | 30.503 |
| -86.856743 | 30.504 |
| -86.856743 | 30.504 |
| -86.856636 | 30.504 |
| -86.856636 | 30.504 |
| -86.85656 | 30.504 |
| -86.85656 | 30.504 |
| -86.856445 | 30.504 |
| -86.856445 | 30.504 |
| -86.856392 | 30.504 |
| -86.856392 | 30.504 |
| -86.856392 | 30.504 |
| -86.856392 | 30.504 |
| -86.856293 | 30.504 |
| -86.856293 | 30.504 |
| -86.856201 | 30.504 |
| -86.856201 | 30.504 |
| -86.856117 | 30.504 |
| -86.856117 | 30.504 |
| -86.856056 | 30.504 |
| -86.856056 | 30.504 |
| -86.856056 | 30.504 |
| -86.855965 | 30.504 |
| -86.855957 | 30.504 |
| -86.855888 | 30.504 |
| -86.855888 | 30.504 |
| -86.855888 | 30.504 |
| -86.855827 | 30.504 |
| -86.855827 | 30.504 |
| -86.855743 | 30.504 |
| -86.855743 | 30.504 |
| -86.855667 | 30.504 |
| -86.855667 | 30.504 |
| -86.855591 | 30.504 |
| -86.855591 | 30.504 |
| -86.855499 | 30.504 |
| -86.855499 | 30.504 |
| -86.855453 | 30.504 |
| -86.855377 | 30.504 |
| -86.855377 | 30.504 |
| -86.855309 | 30.504 |
| -86.855309 | 30.504 |
| -86.855309 | 30.504 |
| -86.855309 | 30.504 |
| -86.855225 | 30.504 |
| -86.855225 | 30.504 |
| -86.855156 | 30.504 |
| -86.855156 | 30.504 |
| -86.855103 | 30.504 |
| -86.855103 | 30.504 |
| -86.855026 | 30.504 |
| -86.855026 | 30.504 |
| -86.854965 | 30.504 |
| -86.854965 | 30.504 |
| -86.854889 | 30.504 |
| -86.854828 | 30.504 |
| -86.854828 | 30.504 |
| -86.854767 | 30.504 |
| -86.854767 | 30.504 |
| -86.854683 | 30.504 |
| -86.854683 | 30.504 |
| -86.854607 | 30.504 |
| -86.854576 | 30.504 |
| -86.854546 | 30.504 |
| -86.854546 | 30.504 |
| -86.854439 | 30.504 |
| -86.854439 | 30.504 |
| -86.854439 | 30.504 |
| -86.854362 | 30.504 |
| -86.854362 | 30.504 |
| -86.854279 | 30.504 |
| -86.854279 | 30.504 |
| -86.854279 | 30.504 |
| -86.854187 | 30.504 |
| -86.854187 | 30.504 |
| -86.854126 | 30.504 |
| -86.854126 | 30.504 |
| -86.854034 | 30.504 |
| -86.854034 | 30.504 |
| -86.853973 | 30.504 |
| -86.853973 | 30.504 |
| -86.853897 | 30.504 |
| -86.853897 | 30.504 |
| -86.853813 | 30.504 |
| -86.853813 | 30.504 |
| -86.853752 | 30.504 |
| -86.853752 | 30.504 |
| -86.853752 | 30.504 |
| -86.853676 | 30.504 |
| -86.853676 | 30.504 |
| -86.853676 | 30.504 |
| -86.853584 | 30.504 |
| -86.8535 | 30.504 |
| -86.8535 | 30.504 |
| -86.853455 | 30.504 |
| -86.853455 | 30.504 |
| -86.853378 | 30.504 |
| -86.853378 | 30.504 |
| -86.853287 | 30.504 |
| -86.853287 | 30.504 |
| -86.853195 | 30.504 |
| -86.853195 | 30.504 |
| -86.853081 | 30.504 |
| -86.853081 | 30.504 |
| -86.853081 | 30.504 |
| -86.853004 | 30.504 |
| -86.853004 | 30.504 |
| -86.852928 | 30.504 |
| -86.852928 | 30.504 |
| -86.852837 | 30.504 |
| -86.852837 | 30.504 |
| -86.85276 | 30.504 |
| -86.85276 | 30.504 |
| -86.852684 | 30.504 |
| -86.852684 | 30.504 |
| -86.852684 | 30.504 |
| -86.852592 | 30.504 |
| -86.852592 | 30.504 |
| -86.852592 | 30.504 |
| -86.852516 | 30.504 |
| -86.852516 | 30.504 |
| -86.852402 | 30.504 |
| -86.852402 | 30.504 |
| -86.852325 | 30.504 |
| -86.852234 | 30.504 |
| -86.852234 | 30.504 |
| -86.852234 | 30.504 |
| -86.852158 | 30.504 |
| -86.852158 | 30.504 |
| -86.852158 | 30.504 |
| -86.852066 | 30.504 |
| -86.852066 | 30.504 |
| -86.851929 | 30.504 |
| -86.851929 | 30.504 |
| -86.85186 | 30.504 |
| -86.85186 | 30.504 |
| -86.851768 | 30.504 |
| -86.851768 | 30.504 |
| -86.851692 | 30.504 |
| -86.851692 | 30.504 |
| -86.851578 | 30.504 |
| -86.851578 | 30.504 |
| -86.851486 | 30.504 |
| -86.851486 | 30.504 |
| -86.851387 | 30.504 |
| -86.851387 | 30.504 |
| -86.851318 | 30.504 |
| -86.851318 | 30.504 |
| -86.851242 | 30.504 |
| -86.851242 | 30.504 |
| -86.851151 | 30.504 |
| -86.851151 | 30.504 |
| -86.851051 | 30.504 |
| -86.851051 | 30.504 |
| -86.850975 | 30.504 |
| -86.850975 | 30.504 |
| -86.850883 | 30.505 |
| -86.850883 | 30.505 |
| -86.850807 | 30.505 |
| -86.850807 | 30.505 |
| -86.850777 | 30.505 |
| -86.850777 | 30.505 |
| -86.85067 | 30.505 |
| -86.85067 | 30.505 |
| -86.85067 | 30.505 |
| -86.850624 | 30.505 |
| -86.850594 | 30.505 |
| -86.850533 | 30.505 |
| -86.850533 | 30.505 |
| -86.850456 | 30.505 |
| -86.850456 | 30.505 |
| -86.850365 | 30.505 |
| -86.850365 | 30.505 |
| -86.850304 | 30.505 |
| -86.850304 | 30.505 |
| -86.850212 | 30.505 |
| -86.850212 | 30.505 |
| -86.850136 | 30.505 |
| -86.850136 | 30.505 |
| -86.850044 | 30.505 |
| -86.850044 | 30.505 |
| -86.849968 | 30.505 |
| -86.849968 | 30.505 |
| -86.849968 | 30.505 |
| -86.849876 | 30.505 |
| -86.849876 | 30.505 |
| -86.849876 | 30.505 |
| -86.849815 | 30.505 |
| -86.849815 | 30.505 |
| -86.849678 | 30.505 |
| -86.849678 | 30.505 |
| -86.849625 | 30.505 |
| -86.849625 | 30.505 |
| -86.849548 | 30.505 |
| -86.849548 | 30.505 |
| -86.849548 | 30.505 |
| -86.849457 | 30.505 |
| -86.849457 | 30.505 |
| -86.84938 | 30.505 |
| -86.849358 | 30.505 |
| -86.849266 | 30.505 |
| -86.849266 | 30.505 |
| -86.849266 | 30.505 |
| -86.84919 | 30.505 |
| -86.849113 | 30.505 |
| -86.849113 | 30.505 |
| -86.849037 | 30.505 |
| -86.849037 | 30.505 |
| -86.848946 | 30.505 |
| -86.848946 | 30.505 |
| -86.848846 | 30.505 |
| -86.848846 | 30.505 |
| -86.84877 | 30.505 |
| -86.84877 | 30.505 |
| -86.848694 | 30.505 |
| -86.848694 | 30.505 |
| -86.848602 | 30.505 |
| -86.848602 | 30.505 |
| -86.848526 | 30.505 |
| -86.848526 | 30.505 |
| -86.848412 | 30.505 |
| -86.848412 | 30.505 |
| -86.848335 | 30.505 |
| -86.848335 | 30.505 |
| -86.848244 | 30.505 |
| -86.848244 | 30.505 |
| -86.848152 | 30.505 |
| -86.848152 | 30.505 |
| -86.848152 | 30.505 |
| -86.848076 | 30.505 |
| -86.848053 | 30.505 |
| -86.847984 | 30.505 |
| -86.847984 | 30.505 |
| -86.847908 | 30.505 |
| -86.847885 | 30.505 |
| -86.847816 | 30.505 |
| -86.847816 | 30.505 |
| -86.847816 | 30.505 |
| -86.847717 | 30.505 |
| -86.847717 | 30.505 |
| -86.847626 | 30.505 |
| -86.847626 | 30.505 |
| -86.847549 | 30.505 |
| -86.847549 | 30.505 |
| -86.847473 | 30.505 |
| -86.847473 | 30.505 |
| -86.847397 | 30.505 |
| -86.847397 | 30.505 |
| -86.847305 | 30.505 |
| -86.847305 | 30.505 |
| -86.847206 | 30.505 |
| -86.847206 | 30.505 |
| -86.847176 | 30.505 |
| -86.847176 | 30.505 |
| -86.847084 | 30.505 |
| -86.847084 | 30.505 |
| -86.847015 | 30.505 |
| -86.847015 | 30.505 |
| -86.846931 | 30.505 |
| -86.846931 | 30.505 |
| -86.846855 | 30.505 |
| -86.846855 | 30.505 |
| -86.846779 | 30.505 |
| -86.846779 | 30.505 |
| -86.84671 | 30.505 |
| -86.84671 | 30.505 |
| -86.846619 | 30.505 |
| -86.846619 | 30.505 |
| -86.846542 | 30.505 |
| -86.846542 | 30.505 |
| -86.846466 | 30.505 |
| -86.846443 | 30.505 |
| -86.84642 | 30.505 |
| -86.84642 | 30.505 |
| -86.846321 | 30.505 |
| -86.846321 | 30.505 |
| -86.846275 | 30.505 |
| -86.846275 | 30.505 |
| -86.846199 | 30.505 |
| -86.846199 | 30.505 |
| -86.846199 | 30.505 |
| -86.846107 | 30.505 |
| -86.846031 | 30.505 |
| -86.846031 | 30.505 |
| -86.846031 | 30.505 |
| -86.84594 | 30.505 |
| -86.84594 | 30.505 |
| -86.845863 | 30.505 |
| -86.845856 | 30.505 |
| -86.845787 | 30.505 |
| -86.845787 | 30.505 |
| -86.845711 | 30.505 |
| -86.845703 | 30.505 |
| -86.845634 | 30.505 |
| -86.845634 | 30.505 |
| -86.845535 | 30.505 |
| -86.845512 | 30.505 |
| -86.845512 | 30.505 |
| -86.845444 | 30.505 |
| -86.845444 | 30.505 |
| -86.845345 | 30.505 |
| -86.845345 | 30.505 |
| -86.845268 | 30.505 |
| -86.845268 | 30.505 |
| -86.845177 | 30.505 |
| -86.845177 | 30.505 |
| -86.8451 | 30.505 |
| -86.8451 | 30.505 |
| -86.844986 | 30.505 |
| -86.844986 | 30.505 |
| -86.844933 | 30.505 |
| -86.844933 | 30.505 |
| -86.844864 | 30.506 |
| -86.844864 | 30.506 |
| -86.844788 | 30.506 |
| -86.844788 | 30.506 |
| -86.844788 | 30.506 |
| -86.844788 | 30.506 |
| -86.844604 | 30.506 |
| -86.844604 | 30.506 |
| -86.844505 | 30.506 |
| -86.844505 | 30.506 |
| -86.844414 | 30.506 |
| -86.844414 | 30.506 |
| -86.844337 | 30.506 |
| -86.844337 | 30.506 |
| -86.844261 | 30.506 |
| -86.844261 | 30.506 |
| -86.84417 | 30.506 |
| -86.84417 | 30.506 |
| -86.844093 | 30.506 |
| -86.844093 | 30.506 |
| -86.844093 | 30.506 |
| -86.844017 | 30.506 |
| -86.843941 | 30.506 |
| -86.843941 | 30.506 |
| -86.843849 | 30.506 |
| -86.843849 | 30.506 |
| -86.843773 | 30.506 |
| -86.843773 | 30.506 |
| -86.843773 | 30.506 |
| -86.843697 | 30.506 |
| -86.843697 | 30.506 |
| -86.84362 | 30.506 |
| -86.843544 | 30.506 |
| -86.843544 | 30.506 |
| -86.843452 | 30.506 |
| -86.843452 | 30.506 |
| -86.843452 | 30.506 |
| -86.843361 | 30.506 |
| -86.843361 | 30.506 |
| -86.843361 | 30.506 |
| -86.843262 | 30.506 |
| -86.843262 | 30.506 |
| -86.843185 | 30.506 |
| -86.843185 | 30.506 |
| -86.843094 | 30.506 |
| -86.843094 | 30.506 |
| -86.843002 | 30.506 |
| -86.843002 | 30.506 |
| -86.842911 | 30.506 |
| -86.842911 | 30.506 |
| -86.842834 | 30.506 |
| -86.842834 | 30.506 |
| -86.84272 | 30.506 |
| -86.84272 | 30.506 |
| -86.84272 | 30.506 |
| -86.84272 | 30.506 |
| -86.842644 | 30.506 |
| -86.842644 | 30.506 |
| -86.842583 | 30.506 |
| -86.842583 | 30.506 |
| -86.842484 | 30.506 |
| -86.842484 | 30.506 |
| -86.84243 | 30.506 |
| -86.84243 | 30.506 |
| -86.842354 | 30.506 |
| -86.842354 | 30.506 |
| -86.842293 | 30.506 |
| -86.842293 | 30.506 |
| -86.842216 | 30.506 |
| -86.842216 | 30.506 |
| -86.842155 | 30.506 |
| -86.842155 | 30.506 |
| -86.842094 | 30.506 |
| -86.842094 | 30.506 |
| -86.842033 | 30.506 |
| -86.842033 | 30.506 |
| -86.842033 | 30.506 |
| -86.841957 | 30.506 |
| -86.841957 | 30.506 |
| -86.841866 | 30.506 |
| -86.841866 | 30.506 |
| -86.841789 | 30.506 |
| -86.841789 | 30.506 |
| -86.841713 | 30.506 |
| -86.841713 | 30.506 |
| -86.841713 | 30.506 |
| -86.841637 | 30.506 |
| -86.84156 | 30.506 |
| -86.84156 | 30.506 |
| -86.841499 | 30.506 |
| -86.841476 | 30.506 |
| -86.841476 | 30.506 |
| -86.841385 | 30.506 |
| -86.841385 | 30.506 |
| -86.841309 | 30.506 |
| -86.841309 | 30.506 |
| -86.841232 | 30.506 |
| -86.841232 | 30.506 |
| -86.841156 | 30.506 |
| -86.841156 | 30.506 |
| -86.841019 | 30.506 |
| -86.841019 | 30.506 |
| -86.84095 | 30.506 |
| -86.84095 | 30.506 |
| -86.840851 | 30.506 |
| -86.840851 | 30.506 |
| -86.840759 | 30.506 |
| -86.840759 | 30.506 |
| -86.84066 | 30.506 |
| -86.84066 | 30.506 |
| -86.840607 | 30.506 |
| -86.840607 | 30.506 |
| -86.840607 | 30.506 |
| -86.840508 | 30.506 |
| -86.840508 | 30.506 |
| -86.840416 | 30.506 |
| -86.840416 | 30.506 |
| -86.840416 | 30.506 |
| -86.840332 | 30.506 |
| -86.840256 | 30.506 |
| -86.840256 | 30.506 |
| -86.840195 | 30.506 |
| -86.840195 | 30.506 |
| -86.840118 | 30.506 |
| -86.840118 | 30.506 |
| -86.840027 | 30.506 |
| -86.840027 | 30.506 |
| -86.839958 | 30.506 |
| -86.839958 | 30.506 |
| -86.839882 | 30.506 |
| -86.839882 | 30.506 |
| -86.839783 | 30.506 |
| -86.839783 | 30.506 |
| -86.839737 | 30.506 |
| -86.839737 | 30.506 |
| -86.839661 | 30.506 |
| -86.839661 | 30.506 |
| -86.8396 | 30.506 |
| -86.8396 | 30.506 |
| -86.839523 | 30.506 |
| -86.839523 | 30.506 |
| -86.839447 | 30.506 |
| -86.839447 | 30.506 |
| -86.839371 | 30.506 |
| -86.839371 | 30.506 |
| -86.839371 | 30.506 |
| -86.839287 | 30.506 |
| -86.839287 | 30.506 |
| -86.839195 | 30.506 |
| -86.839195 | 30.506 |
| -86.839119 | 30.506 |
| -86.839119 | 30.506 |
| -86.839058 | 30.506 |
| -86.83905 | 30.506 |
| -86.838997 | 30.506 |
| -86.838997 | 30.506 |
| -86.838997 | 30.506 |
| -86.838921 | 30.506 |
| -86.838921 | 30.506 |
| -86.838844 | 30.506 |
| -86.838844 | 30.506 |
| -86.838783 | 30.506 |
| -86.838783 | 30.506 |
| -86.838707 | 30.506 |
| -86.838707 | 30.506 |
| -86.838585 | 30.506 |
| -86.838585 | 30.506 |
| -86.838486 | 30.506 |
| -86.838486 | 30.506 |
| -86.83844 | 30.506 |
| -86.83844 | 30.506 |
| -86.838341 | 30.506 |
| -86.838341 | 30.506 |
| -86.838272 | 30.506 |
| -86.838272 | 30.506 |
| -86.83815 | 30.506 |
| -86.83815 | 30.506 |
| -86.838081 | 30.506 |
| -86.838081 | 30.506 |
| -86.83799 | 30.506 |
| -86.83799 | 30.506 |
| -86.837891 | 30.506 |
| -86.837891 | 30.506 |
| -86.837822 | 30.507 |
| -86.837822 | 30.507 |
| -86.837723 | 30.507 |
| -86.837723 | 30.507 |
| -86.837631 | 30.507 |
| -86.837631 | 30.507 |
| -86.837555 | 30.507 |
| -86.837555 | 30.507 |
| -86.83744 | 30.507 |
| -86.83744 | 30.507 |
| -86.837395 | 30.507 |
| -86.837395 | 30.507 |
| -86.837334 | 30.507 |
| -86.837334 | 30.507 |
| -86.837257 | 30.507 |
| -86.837257 | 30.507 |
| -86.837212 | 30.507 |
| -86.837212 | 30.507 |
| -86.837212 | 30.507 |
| -86.837135 | 30.507 |
| -86.837135 | 30.507 |
| -86.837074 | 30.507 |
| -86.836967 | 30.507 |
| -86.836967 | 30.507 |
| -86.83696 | 30.507 |
| -86.836891 | 30.507 |
| -86.836891 | 30.507 |
| -86.836815 | 30.507 |
| -86.836792 | 30.507 |
| -86.836739 | 30.507 |
| -86.836739 | 30.507 |
| -86.836662 | 30.507 |
| -86.836662 | 30.507 |
| -86.836586 | 30.507 |
| -86.836586 | 30.507 |
| -86.836494 | 30.507 |
| -86.836494 | 30.507 |
| -86.836418 | 30.507 |
| -86.836395 | 30.507 |
| -86.836395 | 30.507 |
| -86.836327 | 30.507 |
| -86.836327 | 30.507 |
| -86.83625 | 30.507 |
| -86.83625 | 30.507 |
| -86.836136 | 30.507 |
| -86.836136 | 30.507 |
| -86.836037 | 30.507 |
| -86.836037 | 30.507 |
| -86.835983 | 30.507 |
| -86.835983 | 30.507 |
| -86.835892 | 30.507 |
| -86.835869 | 30.507 |
| -86.835869 | 30.507 |
| -86.835793 | 30.507 |
| -86.835793 | 30.507 |
| -86.835678 | 30.507 |
| -86.835678 | 30.507 |
| -86.835625 | 30.507 |
| -86.835625 | 30.507 |
| -86.835541 | 30.507 |
| -86.835541 | 30.507 |
| -86.835472 | 30.507 |
| -86.835472 | 30.507 |
| -86.835403 | 30.507 |
| -86.835403 | 30.507 |
| -86.835342 | 30.507 |
| -86.835342 | 30.507 |
| -86.835266 | 30.507 |
| -86.835266 | 30.507 |
| -86.835266 | 30.507 |
| -86.835266 | 30.507 |
| -86.835136 | 30.507 |
| -86.835136 | 30.507 |
| -86.835045 | 30.507 |
| -86.835045 | 30.507 |
| -86.834969 | 30.507 |
| -86.834969 | 30.507 |
| -86.834892 | 30.507 |
| -86.834892 | 30.507 |
| -86.834816 | 30.507 |
| -86.834816 | 30.507 |
| -86.834724 | 30.507 |
| -86.834724 | 30.507 |
| -86.834648 | 30.507 |
| -86.834648 | 30.507 |
| -86.834557 | 30.507 |
| -86.834557 | 30.507 |
| -86.834557 | 30.507 |
| -86.83448 | 30.507 |
| -86.83448 | 30.507 |
| -86.834389 | 30.507 |
| -86.834366 | 30.507 |
| -86.834366 | 30.507 |
| -86.83429 | 30.507 |
| -86.83429 | 30.507 |
| -86.834198 | 30.507 |
| -86.834198 | 30.507 |
| -86.834099 | 30.507 |
| -86.834099 | 30.507 |
| -86.834007 | 30.507 |
| -86.834007 | 30.507 |
| -86.833916 | 30.507 |
| -86.833916 | 30.507 |
| -86.833916 | 30.507 |
| -86.833916 | 30.507 |
| -86.833817 | 30.507 |
| -86.833817 | 30.507 |
| -86.833725 | 30.507 |
| -86.833725 | 30.507 |
| -86.833626 | 30.507 |
| -86.833626 | 30.507 |
| -86.833557 | 30.507 |
| -86.833557 | 30.507 |
| -86.833458 | 30.507 |
| -86.833458 | 30.507 |
| -86.833366 | 30.507 |
| -86.833366 | 30.507 |
| -86.83329 | 30.507 |
| -86.83329 | 30.507 |
| -86.833214 | 30.507 |
| -86.833214 | 30.507 |
| -86.833214 | 30.507 |
| -86.833138 | 30.507 |
| -86.833115 | 30.507 |
| -86.833061 | 30.507 |
| -86.833061 | 30.507 |
| -86.833061 | 30.507 |
| -86.832947 | 30.507 |
| -86.832947 | 30.507 |
| -86.832893 | 30.507 |
| -86.832893 | 30.507 |
| -86.832794 | 30.507 |
| -86.832794 | 30.507 |
| -86.832726 | 30.507 |
| -86.832649 | 30.507 |
| -86.832649 | 30.507 |
| -86.832558 | 30.507 |
| -86.832558 | 30.507 |
| -86.832458 | 30.507 |
| -86.832458 | 30.507 |
| -86.832458 | 30.507 |
| -86.832367 | 30.507 |
| -86.832344 | 30.507 |
| -86.832275 | 30.507 |
| -86.832275 | 30.507 |
| -86.832275 | 30.507 |
| -86.832161 | 30.507 |
| -86.832161 | 30.507 |
| -86.832092 | 30.507 |
| -86.832092 | 30.507 |
| -86.831978 | 30.507 |
| -86.831978 | 30.507 |
| -86.831886 | 30.507 |
| -86.831886 | 30.507 |
| -86.831818 | 30.507 |
| -86.831818 | 30.507 |
| -86.831696 | 30.507 |
| -86.831696 | 30.507 |
| -86.831604 | 30.507 |
| -86.831604 | 30.507 |
| -86.83149 | 30.507 |
| -86.83149 | 30.507 |
| -86.831421 | 30.507 |
| -86.831421 | 30.507 |
| -86.831329 | 30.507 |
| -86.831329 | 30.507 |
| -86.831329 | 30.507 |
| -86.831329 | 30.507 |
| -86.831123 | 30.507 |
| -86.831123 | 30.507 |
| -86.831032 | 30.508 |
| -86.831032 | 30.508 |
| -86.83094 | 30.508 |
| -86.83094 | 30.508 |
| -86.830864 | 30.508 |
| -86.830864 | 30.508 |
| -86.830772 | 30.508 |
| -86.830772 | 30.508 |
| -86.830788 | 30.508 |
| -86.830696 | 30.508 |
| -86.830696 | 30.508 |
| -86.83062 | 30.508 |
| -86.83062 | 30.508 |
| -86.830528 | 30.508 |
| -86.830528 | 30.508 |
| -86.830452 | 30.508 |
| -86.830452 | 30.508 |
| -86.830376 | 30.508 |
| -86.830376 | 30.508 |
| -86.830299 | 30.508 |
| -86.830299 | 30.508 |
| -86.830208 | 30.508 |
| -86.830208 | 30.508 |
| -86.830124 | 30.508 |
| -86.830124 | 30.508 |
| -86.830124 | 30.508 |
| -86.830048 | 30.508 |
| -86.830048 | 30.508 |
| -86.829964 | 30.508 |
| -86.829895 | 30.508 |
| -86.829895 | 30.508 |
| -86.829826 | 30.508 |
| -86.829826 | 30.508 |
| -86.829742 | 30.508 |
| -86.829735 | 30.508 |
| -86.829735 | 30.508 |
| -86.829666 | 30.508 |
| -86.829666 | 30.508 |
| -86.829605 | 30.508 |
| -86.829605 | 30.508 |
| -86.829529 | 30.508 |
| -86.829529 | 30.508 |
| -86.829468 | 30.508 |
| -86.829468 | 30.508 |
| -86.829391 | 30.508 |
| -86.829391 | 30.508 |
| -86.829323 | 30.508 |
| -86.829323 | 30.508 |
| -86.829269 | 30.508 |
| -86.829216 | 30.508 |
| -86.829185 | 30.508 |
| -86.829185 | 30.508 |
| -86.829124 | 30.508 |
| -86.829124 | 30.508 |
| -86.829048 | 30.508 |
| -86.829048 | 30.508 |
| -86.829018 | 30.508 |
| -86.828957 | 30.508 |
| -86.82888 | 30.508 |
| -86.82888 | 30.508 |
| -86.828819 | 30.508 |
| -86.828819 | 30.508 |
| -86.828743 | 30.508 |
| -86.828743 | 30.508 |
| -86.828682 | 30.508 |
| -86.828682 | 30.508 |
| -86.82859 | 30.508 |
| -86.82859 | 30.508 |
| -86.828545 | 30.508 |
| -86.828545 | 30.508 |
| -86.828468 | 30.508 |
| -86.828468 | 30.508 |
| -86.828415 | 30.508 |
| -86.828415 | 30.508 |
| -86.828354 | 30.508 |
| -86.828354 | 30.508 |
| -86.828285 | 30.508 |
| -86.828285 | 30.508 |
| -86.828201 | 30.508 |
| -86.828201 | 30.508 |
| -86.828148 | 30.508 |
| -86.828148 | 30.508 |
| -86.828056 | 30.508 |
| -86.828056 | 30.508 |
| -86.828003 | 30.508 |
| -86.828003 | 30.508 |
| -86.827919 | 30.508 |
| -86.827919 | 30.508 |
| -86.827873 | 30.508 |
| -86.827873 | 30.508 |
| -86.827805 | 30.508 |
| -86.827805 | 30.508 |
| -86.827736 | 30.508 |
| -86.827736 | 30.508 |
| -86.827629 | 30.508 |
| -86.827629 | 30.508 |
| -86.827629 | 30.508 |
| -86.827553 | 30.508 |
| -86.827545 | 30.508 |
| -86.827545 | 30.508 |
| -86.827477 | 30.508 |
| -86.8274 | 30.508 |
| -86.8274 | 30.508 |
| -86.8274 | 30.508 |
| -86.827301 | 30.508 |
| -86.827301 | 30.508 |
| -86.827225 | 30.508 |
| -86.827225 | 30.508 |
| -86.82711 | 30.508 |
| -86.82711 | 30.508 |
| -86.827034 | 30.508 |
| -86.827034 | 30.508 |
| -86.826935 | 30.508 |
| -86.826935 | 30.508 |
| -86.826859 | 30.508 |
| -86.826859 | 30.508 |
| -86.826759 | 30.508 |
| -86.826759 | 30.508 |
| -86.826691 | 30.508 |
| -86.826691 | 30.508 |
| -86.826614 | 30.508 |
| -86.826614 | 30.508 |
| -86.826515 | 30.508 |
| -86.826515 | 30.508 |
| -86.826424 | 30.508 |
| -86.826424 | 30.508 |
| -86.826424 | 30.508 |
| -86.826424 | 30.508 |
| -86.826363 | 30.508 |
| -86.826363 | 30.508 |
| -86.826286 | 30.508 |
| -86.826286 | 30.508 |
| -86.826187 | 30.508 |
| -86.826187 | 30.508 |
| -86.826118 | 30.508 |
| -86.826118 | 30.508 |
| -86.826019 | 30.508 |
| -86.826019 | 30.508 |
| -86.825958 | 30.508 |
| -86.825958 | 30.508 |
| -86.825958 | 30.508 |
| -86.825958 | 30.508 |
| -86.825867 | 30.508 |
| -86.825867 | 30.508 |
| -86.82579 | 30.508 |
| -86.82579 | 30.508 |
| -86.825699 | 30.508 |
| -86.825699 | 30.508 |
| -86.825623 | 30.508 |
| -86.825623 | 30.508 |
| -86.8255 | 30.508 |
| -86.8255 | 30.508 |
| -86.825447 | 30.508 |
| -86.825447 | 30.508 |
| -86.825371 | 30.508 |
| -86.825371 | 30.508 |
| -86.825279 | 30.508 |
| -86.825279 | 30.508 |
| -86.825203 | 30.509 |
| -86.825203 | 30.509 |
| -86.825127 | 30.509 |
| -86.825127 | 30.509 |
| -86.825127 | 30.509 |
| -86.82505 | 30.509 |
| -86.82505 | 30.509 |
| -86.824959 | 30.509 |
| -86.824959 | 30.509 |
| -86.82486 | 30.509 |
| -86.82486 | 30.509 |
| -86.82476 | 30.509 |
| -86.82476 | 30.509 |
| -86.824722 | 30.509 |
| -86.824722 | 30.509 |
| -86.824661 | 30.509 |
| -86.824661 | 30.509 |
| -86.824539 | 30.509 |
| -86.824539 | 30.509 |
| -86.82444 | 30.509 |
| -86.82444 | 30.509 |
| -86.82444 | 30.509 |
| -86.824364 | 30.509 |
| -86.824364 | 30.509 |
| -86.824364 | 30.509 |
| -86.824287 | 30.509 |
| -86.824287 | 30.509 |
| -86.824211 | 30.509 |
| -86.824211 | 30.509 |
| -86.82412 | 30.509 |
| -86.82412 | 30.509 |
| -86.824043 | 30.509 |
| -86.82402 | 30.509 |
| -86.823952 | 30.509 |
| -86.823952 | 30.509 |
| -86.823952 | 30.509 |
| -86.823853 | 30.509 |
| -86.823853 | 30.509 |
| -86.823784 | 30.509 |
| -86.823784 | 30.509 |
| -86.823708 | 30.509 |
| -86.823708 | 30.509 |
| -86.823616 | 30.509 |
| -86.823616 | 30.509 |
| -86.823616 | 30.509 |
| -86.82354 | 30.509 |
| -86.82354 | 30.509 |
| -86.823425 | 30.509 |
| -86.823425 | 30.509 |
| -86.823349 | 30.509 |
| -86.823349 | 30.509 |
| -86.823235 | 30.509 |
| -86.823235 | 30.509 |
| -86.823174 | 30.509 |
| -86.823174 | 30.509 |
| -86.823151 | 30.509 |
| -86.823151 | 30.509 |
| -86.823074 | 30.509 |
| -86.823074 | 30.509 |
| -86.823013 | 30.509 |
| -86.823013 | 30.509 |
| -86.822884 | 30.509 |
| -86.822884 | 30.509 |
| -86.822845 | 30.509 |
| -86.822845 | 30.509 |
| -86.822845 | 30.509 |
| -86.822762 | 30.509 |
| -86.822746 | 30.509 |
| -86.82267 | 30.509 |
| -86.82267 | 30.509 |
| -86.822594 | 30.509 |
| -86.822594 | 30.509 |
| -86.822517 | 30.509 |
| -86.822517 | 30.509 |
| -86.822426 | 30.509 |
| -86.822426 | 30.509 |
| -86.82235 | 30.509 |
| -86.82235 | 30.509 |
| -86.822258 | 30.509 |
| -86.822258 | 30.509 |
| -86.822258 | 30.509 |
| -86.822159 | 30.509 |
| -86.822159 | 30.509 |
| -86.822044 | 30.509 |
| -86.822044 | 30.509 |
| -86.821968 | 30.509 |
| -86.821968 | 30.509 |
| -86.821877 | 30.509 |
| -86.821877 | 30.509 |
| -86.821877 | 30.509 |
| -86.821831 | 30.509 |
| -86.821831 | 30.509 |
| -86.821754 | 30.509 |
| -86.821754 | 30.509 |
| -86.821693 | 30.509 |
| -86.821693 | 30.509 |
| -86.821617 | 30.509 |
| -86.821617 | 30.509 |
| -86.821579 | 30.509 |
| -86.821579 | 30.509 |
| -86.821518 | 30.509 |
| -86.821518 | 30.509 |
| -86.821457 | 30.51 |
| -86.821457 | 30.51 |
| -86.821358 | 30.51 |
| -86.821358 | 30.51 |
| -86.821327 | 30.51 |
| -86.821327 | 30.51 |
| -86.821304 | 30.51 |
| -86.821304 | 30.51 |
| -86.821304 | 30.51 |
| -86.821281 | 30.51 |
| -86.821281 | 30.51 |
| -86.821281 | 30.51 |
| -86.821251 | 30.51 |
| -86.821251 | 30.51 |
| -86.821236 | 30.51 |
| -86.821236 | 30.51 |
| -86.821251 | 30.51 |
| -86.821251 | 30.51 |
| -86.821281 | 30.51 |
| -86.821281 | 30.51 |
| -86.821297 | 30.51 |
| -86.821297 | 30.51 |
| -86.821297 | 30.51 |
| -86.82135 | 30.51 |
| -86.82135 | 30.51 |
| -86.821411 | 30.511 |
| -86.821411 | 30.511 |
| -86.821472 | 30.511 |
| -86.821472 | 30.511 |
| -86.821541 | 30.511 |
| -86.821541 | 30.511 |
| -86.82164 | 30.511 |
| -86.82164 | 30.511 |
| -86.821724 | 30.511 |
| -86.8218 | 30.511 |
| -86.8218 | 30.511 |
| -86.8218 | 30.511 |
| -86.8218 | 30.511 |
| -86.821915 | 30.511 |
| -86.821915 | 30.511 |
| -86.821991 | 30.511 |
| -86.821991 | 30.511 |
| -86.822083 | 30.511 |
| -86.822083 | 30.511 |
| -86.822159 | 30.511 |
| -86.822159 | 30.511 |
| -86.82225 | 30.511 |
| -86.82225 | 30.511 |
| -86.822342 | 30.511 |
| -86.822342 | 30.511 |
| -86.822342 | 30.511 |
| -86.822342 | 30.511 |
| -86.822533 | 30.511 |
| -86.822533 | 30.511 |
| -86.822609 | 30.511 |
| -86.822609 | 30.511 |
| -86.822693 | 30.511 |
| -86.822693 | 30.511 |
| -86.822693 | 30.511 |
| -86.822762 | 30.511 |
| -86.822762 | 30.511 |
| -86.822762 | 30.511 |
| -86.822838 | 30.511 |
| -86.822838 | 30.511 |
| -86.822899 | 30.511 |
| -86.822899 | 30.511 |
| -86.822968 | 30.511 |
| -86.822968 | 30.511 |
| -86.823029 | 30.511 |
| -86.823029 | 30.511 |
| -86.823074 | 30.511 |
| -86.823074 | 30.511 |
| -86.823128 | 30.511 |
| -86.823128 | 30.511 |
| -86.823135 | 30.511 |
| -86.823135 | 30.511 |
| -86.823158 | 30.511 |
| -86.823158 | 30.511 |
| -86.823189 | 30.511 |
| -86.823189 | 30.511 |
| -86.823219 | 30.511 |
| -86.823219 | 30.511 |
| -86.82325 | 30.51 |
| -86.82325 | 30.51 |
| -86.823265 | 30.51 |
| -86.823265 | 30.51 |
| -86.823296 | 30.51 |
| -86.823296 | 30.51 |
| -86.823311 | 30.51 |
| -86.823311 | 30.51 |
| -86.823311 | 30.51 |
| -86.823311 | 30.51 |
| -86.823341 | 30.51 |
| -86.823341 | 30.51 |
| -86.823357 | 30.51 |
| -86.823357 | 30.51 |
| -86.823372 | 30.51 |
| -86.823372 | 30.51 |
| -86.823372 | 30.51 |
| -86.823372 | 30.51 |
| -86.823387 | 30.51 |
| -86.823387 | 30.51 |
| -86.823387 | 30.51 |
| -86.823387 | 30.51 |
| -86.823372 | 30.51 |
| -86.823372 | 30.51 |
| -86.823357 | 30.51 |
| -86.823357 | 30.51 |
| -86.823357 | 30.51 |
| -86.823341 | 30.51 |
| -86.823341 | 30.51 |
| -86.823311 | 30.51 |
| -86.823311 | 30.51 |
| -86.823311 | 30.51 |
| -86.82328 | 30.51 |
| -86.82325 | 30.51 |
| -86.82325 | 30.51 |
| -86.823189 | 30.51 |
| -86.823151 | 30.51 |
| -86.823151 | 30.51 |
| -86.82309 | 30.509 |
| -86.82309 | 30.509 |
| -86.823029 | 30.509 |
| -86.823029 | 30.509 |
| -86.822983 | 30.509 |
| -86.822983 | 30.509 |
| -86.822899 | 30.509 |
| -86.822899 | 30.509 |
| -86.822853 | 30.509 |
| -86.822853 | 30.509 |
| -86.822769 | 30.509 |
| -86.822769 | 30.509 |
| -86.822708 | 30.509 |
| -86.822708 | 30.509 |
| -86.822647 | 30.509 |
| -86.822647 | 30.509 |
| -86.822647 | 30.509 |
| -86.822647 | 30.509 |
| -86.822533 | 30.509 |
| -86.822533 | 30.509 |
| -86.822487 | 30.509 |
| -86.822487 | 30.509 |
| -86.822411 | 30.509 |
| -86.822411 | 30.509 |
| -86.822289 | 30.509 |
| -86.822289 | 30.509 |
| -86.822212 | 30.509 |
| -86.822212 | 30.509 |
| -86.822136 | 30.509 |
| -86.822136 | 30.509 |
| -86.822136 | 30.509 |
| -86.822136 | 30.509 |
| -86.822021 | 30.509 |
| -86.822021 | 30.509 |
| -86.82193 | 30.509 |
| -86.82193 | 30.509 |
| -86.821838 | 30.509 |
| -86.821838 | 30.509 |
| -86.821747 | 30.509 |
| -86.821747 | 30.509 |
| -86.821663 | 30.509 |
| -86.821663 | 30.509 |
| -86.821602 | 30.509 |
| -86.821602 | 30.509 |
| -86.821533 | 30.509 |
| -86.821533 | 30.509 |
| -86.821472 | 30.51 |
| -86.821472 | 30.51 |
| -86.821434 | 30.51 |
| -86.821434 | 30.51 |
| -86.821373 | 30.51 |
| -86.821373 | 30.51 |
| -86.821373 | 30.51 |
| -86.821342 | 30.51 |
| -86.821342 | 30.51 |
| -86.821342 | 30.51 |
| -86.821312 | 30.51 |
| -86.821312 | 30.51 |
| -86.821297 | 30.51 |
| -86.821297 | 30.51 |
| -86.821266 | 30.51 |
| -86.821266 | 30.51 |
| -86.821251 | 30.51 |
| -86.821251 | 30.51 |
| -86.821251 | 30.51 |
| -86.821251 | 30.51 |
| -86.821251 | 30.51 |
| -86.821251 | 30.51 |
| -86.821266 | 30.51 |
| -86.821266 | 30.51 |
| -86.821281 | 30.511 |
| -86.821281 | 30.511 |
| -86.821335 | 30.511 |
| -86.821335 | 30.511 |
| -86.821381 | 30.511 |
| -86.821381 | 30.511 |
| -86.821434 | 30.511 |
| -86.821434 | 30.511 |
| -86.821434 | 30.511 |
| -86.82151 | 30.511 |
| -86.82151 | 30.511 |
| -86.82151 | 30.511 |
| -86.821594 | 30.511 |
| -86.821594 | 30.511 |
| -86.821648 | 30.511 |
| -86.821648 | 30.511 |
| -86.821724 | 30.511 |
| -86.821724 | 30.511 |
| -86.8218 | 30.511 |
| -86.8218 | 30.511 |
| -86.821877 | 30.511 |
| -86.821899 | 30.511 |
| -86.821968 | 30.511 |
| -86.821968 | 30.511 |
| -86.822044 | 30.511 |
| -86.822044 | 30.511 |
| -86.822121 | 30.511 |
| -86.822121 | 30.511 |
| -86.822121 | 30.511 |
| -86.822121 | 30.511 |
| -86.822227 | 30.511 |
| -86.822227 | 30.511 |
| -86.822266 | 30.511 |
| -86.822266 | 30.511 |
| -86.822327 | 30.511 |
| -86.822327 | 30.511 |
| -86.82238 | 30.511 |
| -86.82238 | 30.511 |
| -86.822418 | 30.511 |
| -86.822418 | 30.511 |
| -86.822456 | 30.511 |
| -86.822456 | 30.511 |
| -86.822487 | 30.511 |
| -86.822487 | 30.511 |
| -86.822502 | 30.511 |
| -86.822502 | 30.511 |
| -86.822533 | 30.511 |
| -86.822533 | 30.511 |
| -86.822533 | 30.511 |
| -86.822548 | 30.511 |
| -86.822548 | 30.511 |
| -86.822548 | 30.511 |
| -86.822548 | 30.511 |
| -86.822578 | 30.511 |
| -86.822578 | 30.511 |
| -86.822594 | 30.51 |
| -86.822594 | 30.51 |
| -86.822609 | 30.51 |
| -86.822609 | 30.51 |
| -86.822624 | 30.51 |
| -86.822624 | 30.51 |
| -86.822624 | 30.51 |
| -86.822624 | 30.51 |
| -86.822639 | 30.51 |
| -86.822639 | 30.51 |
| -86.82267 | 30.51 |
| -86.82267 | 30.51 |
| -86.822685 | 30.51 |
| -86.822685 | 30.51 |
| -86.822716 | 30.51 |
| -86.822716 | 30.51 |
| -86.822716 | 30.51 |
| -86.822762 | 30.51 |
| -86.822762 | 30.51 |
| -86.822762 | 30.51 |
| -86.822792 | 30.51 |
| -86.822792 | 30.51 |
| -86.822838 | 30.51 |
| -86.822838 | 30.51 |
| -86.822868 | 30.51 |
| -86.822868 | 30.51 |
| -86.822914 | 30.51 |
| -86.822914 | 30.51 |
| -86.822945 | 30.51 |
| -86.822945 | 30.51 |
| -86.823006 | 30.51 |
| -86.823006 | 30.51 |
| -86.823029 | 30.51 |
| -86.823029 | 30.51 |
| -86.823074 | 30.51 |
| -86.823074 | 30.51 |
| -86.82312 | 30.51 |
| -86.82312 | 30.51 |
| -86.823166 | 30.51 |
| -86.823166 | 30.51 |
| -86.823204 | 30.51 |
| -86.823204 | 30.51 |
| -86.82325 | 30.51 |
| -86.82325 | 30.51 |
| -86.823296 | 30.51 |
| -86.823296 | 30.51 |
| -86.823364 | 30.509 |
| -86.823364 | 30.509 |
| -86.823433 | 30.509 |
| -86.823433 | 30.509 |
| -86.823456 | 30.509 |
| -86.823456 | 30.509 |
| -86.823509 | 30.509 |
| -86.823509 | 30.509 |
| -86.82357 | 30.509 |
| -86.82357 | 30.509 |
| -86.823586 | 30.509 |
| -86.823647 | 30.509 |
| -86.823708 | 30.509 |
| -86.823708 | 30.509 |
| -86.823753 | 30.509 |
| -86.823753 | 30.509 |
| -86.823753 | 30.509 |
| -86.823814 | 30.509 |
| -86.823814 | 30.509 |
| -86.823814 | 30.509 |
| -86.823883 | 30.509 |
| -86.823883 | 30.509 |
| -86.823944 | 30.509 |
| -86.823944 | 30.509 |
| -86.824028 | 30.509 |
| -86.824028 | 30.509 |
| -86.824104 | 30.509 |
| -86.824104 | 30.509 |
| -86.824173 | 30.509 |
| -86.824173 | 30.509 |
| -86.824226 | 30.509 |
| -86.824226 | 30.509 |
| -86.824303 | 30.509 |
| -86.824303 | 30.509 |
| -86.824364 | 30.509 |
| -86.824364 | 30.509 |
| -86.82444 | 30.509 |
| -86.82444 | 30.509 |
| -86.824493 | 30.509 |
| -86.824493 | 30.509 |
| -86.824554 | 30.509 |
| -86.824554 | 30.509 |
| -86.824615 | 30.509 |
| -86.824654 | 30.509 |
| -86.824677 | 30.509 |
| -86.824677 | 30.509 |
| -86.82476 | 30.509 |
| -86.82476 | 30.509 |
| -86.82476 | 30.509 |
| -86.824806 | 30.509 |
| -86.824806 | 30.509 |
| -86.824806 | 30.509 |
| -86.824898 | 30.509 |
| -86.824898 | 30.509 |
| -86.824928 | 30.509 |
| -86.824928 | 30.509 |
| -86.82502 | 30.508 |
| -86.825027 | 30.508 |
| -86.825081 | 30.508 |
| -86.825081 | 30.508 |
| -86.825127 | 30.508 |
| -86.825127 | 30.508 |
| -86.825188 | 30.508 |
| -86.825188 | 30.508 |
| -86.825188 | 30.508 |
| -86.825249 | 30.508 |
| -86.825249 | 30.508 |
| -86.82531 | 30.508 |
| -86.82531 | 30.508 |
| -86.825378 | 30.508 |
| -86.825378 | 30.508 |
| -86.825417 | 30.508 |
| -86.825417 | 30.508 |
| -86.825485 | 30.508 |
| -86.825485 | 30.508 |
| -86.825531 | 30.508 |
| -86.825531 | 30.508 |
| -86.825592 | 30.508 |
| -86.825592 | 30.508 |
| -86.825592 | 30.508 |
| -86.82563 | 30.508 |
| -86.82563 | 30.508 |
| -86.82563 | 30.508 |
| -86.825661 | 30.508 |
| -86.825661 | 30.508 |
| -86.825676 | 30.508 |
| -86.825676 | 30.508 |
| -86.825691 | 30.508 |
| -86.825691 | 30.508 |
| -86.825691 | 30.508 |
| -86.825691 | 30.508 |
| -86.825676 | 30.508 |
| -86.825676 | 30.508 |
| -86.825676 | 30.508 |
| -86.825676 | 30.508 |
| -86.825676 | 30.508 |
| -86.825676 | 30.508 |
| -86.825676 | 30.508 |
| -86.825676 | 30.508 |
| -86.825676 | 30.508 |
| -86.825676 | 30.508 |
| -86.825676 | 30.508 |
| -86.825676 | 30.508 |
| -86.825661 | 30.508 |
| -86.825661 | 30.508 |
| -86.825661 | 30.508 |
| -86.825661 | 30.508 |
| -86.825661 | 30.508 |
| -86.825661 | 30.508 |
| -86.825661 | 30.508 |
| -86.825661 | 30.508 |
| -86.825661 | 30.508 |
| -86.825661 | 30.508 |
| -86.825661 | 30.508 |
| -86.825661 | 30.508 |
| -86.825661 | 30.508 |
| -86.825661 | 30.508 |
| -86.825661 | 30.508 |
| -86.825661 | 30.508 |
| -86.825661 | 30.508 |
| -86.825661 | 30.508 |
| -86.825661 | 30.508 |
| -86.825661 | 30.508 |
| -86.825661 | 30.508 |
| -86.825661 | 30.508 |
| -86.825661 | 30.508 |
| -86.825661 | 30.508 |
| -86.825661 | 30.508 |
| -86.825661 | 30.508 |
| -86.825661 | 30.508 |
| -86.825661 | 30.508 |
| -86.825661 | 30.508 |
| -86.825661 | 30.508 |
| -86.825661 | 30.508 |
| -86.825661 | 30.508 |
| -86.825661 | 30.508 |
| -86.825661 | 30.508 |
| -86.825661 | 30.508 |
| -86.825661 | 30.508 |
| -86.825661 | 30.508 |
| -86.825661 | 30.508 |
| -86.825661 | 30.508 |
| -86.825661 | 30.508 |
| -86.825661 | 30.508 |
| -86.825661 | 30.508 |
| -86.825661 | 30.508 |